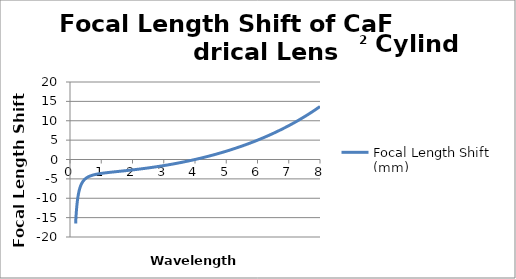
| Category | Focal Length Shift (mm) |
|---|---|
| 0.18 | -16.532 |
| 0.181 | -16.371 |
| 0.182 | -16.213 |
| 0.183 | -16.058 |
| 0.184 | -15.906 |
| 0.185 | -15.757 |
| 0.186 | -15.611 |
| 0.187 | -15.467 |
| 0.188 | -15.326 |
| 0.189 | -15.188 |
| 0.19 | -15.052 |
| 0.191 | -14.918 |
| 0.192 | -14.787 |
| 0.193 | -14.658 |
| 0.194 | -14.532 |
| 0.195 | -14.407 |
| 0.196 | -14.285 |
| 0.197 | -14.165 |
| 0.198 | -14.047 |
| 0.199 | -13.931 |
| 0.2 | -13.817 |
| 0.201 | -13.705 |
| 0.202 | -13.594 |
| 0.203 | -13.486 |
| 0.204 | -13.379 |
| 0.205 | -13.274 |
| 0.206 | -13.171 |
| 0.207 | -13.069 |
| 0.208 | -12.969 |
| 0.209 | -12.871 |
| 0.21 | -12.774 |
| 0.211 | -12.679 |
| 0.212 | -12.585 |
| 0.213 | -12.493 |
| 0.214 | -12.402 |
| 0.215 | -12.312 |
| 0.216 | -12.224 |
| 0.217 | -12.137 |
| 0.218 | -12.051 |
| 0.219 | -11.967 |
| 0.22 | -11.884 |
| 0.221 | -11.802 |
| 0.222 | -11.722 |
| 0.223 | -11.642 |
| 0.224 | -11.564 |
| 0.225 | -11.487 |
| 0.226 | -11.411 |
| 0.227 | -11.336 |
| 0.228 | -11.262 |
| 0.229 | -11.19 |
| 0.23 | -11.118 |
| 0.231 | -11.047 |
| 0.232 | -10.977 |
| 0.233 | -10.909 |
| 0.234 | -10.841 |
| 0.235 | -10.774 |
| 0.236 | -10.708 |
| 0.237 | -10.643 |
| 0.238 | -10.578 |
| 0.239 | -10.515 |
| 0.24 | -10.453 |
| 0.241 | -10.391 |
| 0.242 | -10.33 |
| 0.243 | -10.27 |
| 0.244 | -10.211 |
| 0.245 | -10.152 |
| 0.246 | -10.095 |
| 0.247 | -10.038 |
| 0.248 | -9.981 |
| 0.249 | -9.926 |
| 0.25 | -9.871 |
| 0.251 | -9.817 |
| 0.252 | -9.764 |
| 0.253 | -9.711 |
| 0.254 | -9.659 |
| 0.255 | -9.607 |
| 0.256 | -9.557 |
| 0.257 | -9.506 |
| 0.258 | -9.457 |
| 0.259 | -9.408 |
| 0.26 | -9.36 |
| 0.261 | -9.312 |
| 0.262 | -9.265 |
| 0.263 | -9.218 |
| 0.264 | -9.172 |
| 0.265 | -9.126 |
| 0.266 | -9.081 |
| 0.267 | -9.037 |
| 0.268 | -8.993 |
| 0.269 | -8.95 |
| 0.27 | -8.907 |
| 0.271 | -8.864 |
| 0.272 | -8.823 |
| 0.273 | -8.781 |
| 0.274 | -8.74 |
| 0.275 | -8.7 |
| 0.276 | -8.66 |
| 0.277 | -8.62 |
| 0.278 | -8.581 |
| 0.279 | -8.542 |
| 0.28 | -8.504 |
| 0.281 | -8.466 |
| 0.282 | -8.429 |
| 0.283 | -8.392 |
| 0.284 | -8.355 |
| 0.285 | -8.319 |
| 0.286 | -8.284 |
| 0.287 | -8.248 |
| 0.288 | -8.213 |
| 0.289 | -8.179 |
| 0.29 | -8.144 |
| 0.291 | -8.11 |
| 0.292 | -8.077 |
| 0.293 | -8.044 |
| 0.294 | -8.011 |
| 0.295 | -7.979 |
| 0.296 | -7.946 |
| 0.297 | -7.915 |
| 0.298 | -7.883 |
| 0.299 | -7.852 |
| 0.3 | -7.821 |
| 0.301 | -7.791 |
| 0.302 | -7.761 |
| 0.303 | -7.731 |
| 0.304 | -7.701 |
| 0.305 | -7.672 |
| 0.306 | -7.643 |
| 0.307 | -7.614 |
| 0.308 | -7.586 |
| 0.309 | -7.558 |
| 0.31 | -7.53 |
| 0.311 | -7.503 |
| 0.312 | -7.475 |
| 0.313 | -7.448 |
| 0.314 | -7.422 |
| 0.315 | -7.395 |
| 0.316 | -7.369 |
| 0.317 | -7.343 |
| 0.318 | -7.317 |
| 0.319 | -7.292 |
| 0.32 | -7.267 |
| 0.321 | -7.242 |
| 0.322 | -7.217 |
| 0.323 | -7.193 |
| 0.324 | -7.168 |
| 0.325 | -7.144 |
| 0.326 | -7.121 |
| 0.327 | -7.097 |
| 0.328 | -7.074 |
| 0.329 | -7.051 |
| 0.33 | -7.028 |
| 0.331 | -7.005 |
| 0.332 | -6.982 |
| 0.333 | -6.96 |
| 0.334 | -6.938 |
| 0.335 | -6.916 |
| 0.336 | -6.895 |
| 0.337 | -6.873 |
| 0.338 | -6.852 |
| 0.339 | -6.831 |
| 0.34 | -6.81 |
| 0.341 | -6.789 |
| 0.342 | -6.769 |
| 0.343 | -6.748 |
| 0.344 | -6.728 |
| 0.345 | -6.708 |
| 0.346 | -6.688 |
| 0.347 | -6.669 |
| 0.348 | -6.649 |
| 0.349 | -6.63 |
| 0.35 | -6.611 |
| 0.351 | -6.592 |
| 0.352 | -6.573 |
| 0.353 | -6.555 |
| 0.354 | -6.536 |
| 0.355 | -6.518 |
| 0.356 | -6.5 |
| 0.357 | -6.482 |
| 0.358 | -6.464 |
| 0.359 | -6.446 |
| 0.36 | -6.429 |
| 0.361 | -6.411 |
| 0.362 | -6.394 |
| 0.363 | -6.377 |
| 0.364 | -6.36 |
| 0.365 | -6.343 |
| 0.366 | -6.327 |
| 0.367 | -6.31 |
| 0.368 | -6.294 |
| 0.369 | -6.277 |
| 0.37 | -6.261 |
| 0.371 | -6.245 |
| 0.372 | -6.229 |
| 0.373 | -6.214 |
| 0.374 | -6.198 |
| 0.375 | -6.183 |
| 0.376 | -6.167 |
| 0.377 | -6.152 |
| 0.378 | -6.137 |
| 0.379 | -6.122 |
| 0.38 | -6.107 |
| 0.381 | -6.092 |
| 0.382 | -6.078 |
| 0.383 | -6.063 |
| 0.384 | -6.049 |
| 0.385 | -6.034 |
| 0.386 | -6.02 |
| 0.387 | -6.006 |
| 0.388 | -5.992 |
| 0.389 | -5.978 |
| 0.39 | -5.965 |
| 0.391 | -5.951 |
| 0.392 | -5.937 |
| 0.393 | -5.924 |
| 0.394 | -5.911 |
| 0.395 | -5.898 |
| 0.396 | -5.884 |
| 0.397 | -5.871 |
| 0.398 | -5.858 |
| 0.399 | -5.846 |
| 0.4 | -5.833 |
| 0.401 | -5.82 |
| 0.402 | -5.808 |
| 0.403 | -5.795 |
| 0.404 | -5.783 |
| 0.405 | -5.771 |
| 0.406 | -5.759 |
| 0.407 | -5.746 |
| 0.408 | -5.734 |
| 0.409 | -5.723 |
| 0.41 | -5.711 |
| 0.411 | -5.699 |
| 0.412 | -5.687 |
| 0.413 | -5.676 |
| 0.414 | -5.664 |
| 0.415 | -5.653 |
| 0.416 | -5.642 |
| 0.417 | -5.63 |
| 0.418 | -5.619 |
| 0.419 | -5.608 |
| 0.42 | -5.597 |
| 0.421 | -5.586 |
| 0.422 | -5.575 |
| 0.423 | -5.565 |
| 0.424 | -5.554 |
| 0.425 | -5.543 |
| 0.426 | -5.533 |
| 0.427 | -5.522 |
| 0.428 | -5.512 |
| 0.429 | -5.502 |
| 0.43 | -5.492 |
| 0.431 | -5.481 |
| 0.432 | -5.471 |
| 0.433 | -5.461 |
| 0.434 | -5.451 |
| 0.435 | -5.441 |
| 0.436 | -5.432 |
| 0.437 | -5.422 |
| 0.438 | -5.412 |
| 0.439 | -5.403 |
| 0.44 | -5.393 |
| 0.441 | -5.383 |
| 0.442 | -5.374 |
| 0.443 | -5.365 |
| 0.444 | -5.355 |
| 0.445 | -5.346 |
| 0.446 | -5.337 |
| 0.447 | -5.328 |
| 0.448 | -5.319 |
| 0.449 | -5.31 |
| 0.45 | -5.301 |
| 0.451 | -5.292 |
| 0.452 | -5.283 |
| 0.453 | -5.274 |
| 0.454 | -5.266 |
| 0.455 | -5.257 |
| 0.456 | -5.248 |
| 0.457 | -5.24 |
| 0.458 | -5.231 |
| 0.459 | -5.223 |
| 0.46 | -5.215 |
| 0.461 | -5.206 |
| 0.462 | -5.198 |
| 0.463 | -5.19 |
| 0.464 | -5.182 |
| 0.465 | -5.174 |
| 0.466 | -5.165 |
| 0.467 | -5.157 |
| 0.468 | -5.149 |
| 0.469 | -5.142 |
| 0.47 | -5.134 |
| 0.471 | -5.126 |
| 0.472 | -5.118 |
| 0.473 | -5.11 |
| 0.474 | -5.103 |
| 0.475 | -5.095 |
| 0.476 | -5.088 |
| 0.477 | -5.08 |
| 0.478 | -5.073 |
| 0.479 | -5.065 |
| 0.48 | -5.058 |
| 0.481 | -5.05 |
| 0.482 | -5.043 |
| 0.483 | -5.036 |
| 0.484 | -5.029 |
| 0.485 | -5.022 |
| 0.486 | -5.014 |
| 0.487 | -5.007 |
| 0.488 | -5 |
| 0.489 | -4.993 |
| 0.49 | -4.986 |
| 0.491 | -4.979 |
| 0.492 | -4.973 |
| 0.493 | -4.966 |
| 0.494 | -4.959 |
| 0.495 | -4.952 |
| 0.496 | -4.945 |
| 0.497 | -4.939 |
| 0.498 | -4.932 |
| 0.499 | -4.926 |
| 0.5 | -4.919 |
| 0.501 | -4.913 |
| 0.502 | -4.906 |
| 0.503 | -4.9 |
| 0.504 | -4.893 |
| 0.505 | -4.887 |
| 0.506 | -4.881 |
| 0.507 | -4.874 |
| 0.508 | -4.868 |
| 0.509 | -4.862 |
| 0.51 | -4.856 |
| 0.511 | -4.849 |
| 0.512 | -4.843 |
| 0.513 | -4.837 |
| 0.514 | -4.831 |
| 0.515 | -4.825 |
| 0.516 | -4.819 |
| 0.517 | -4.813 |
| 0.518 | -4.807 |
| 0.519 | -4.801 |
| 0.52 | -4.796 |
| 0.521 | -4.79 |
| 0.522 | -4.784 |
| 0.523 | -4.778 |
| 0.524 | -4.773 |
| 0.525 | -4.767 |
| 0.526 | -4.761 |
| 0.527 | -4.756 |
| 0.528 | -4.75 |
| 0.529 | -4.744 |
| 0.53 | -4.739 |
| 0.531 | -4.733 |
| 0.532 | -4.728 |
| 0.533 | -4.723 |
| 0.534 | -4.717 |
| 0.535 | -4.712 |
| 0.536 | -4.706 |
| 0.537 | -4.701 |
| 0.538 | -4.696 |
| 0.539 | -4.69 |
| 0.54 | -4.685 |
| 0.541 | -4.68 |
| 0.542 | -4.675 |
| 0.543 | -4.67 |
| 0.544 | -4.665 |
| 0.545 | -4.659 |
| 0.546 | -4.654 |
| 0.547 | -4.649 |
| 0.548 | -4.644 |
| 0.549 | -4.639 |
| 0.55 | -4.634 |
| 0.551 | -4.629 |
| 0.552 | -4.624 |
| 0.553 | -4.62 |
| 0.554 | -4.615 |
| 0.555 | -4.61 |
| 0.556 | -4.605 |
| 0.557 | -4.6 |
| 0.558 | -4.595 |
| 0.559 | -4.591 |
| 0.56 | -4.586 |
| 0.561 | -4.581 |
| 0.562 | -4.577 |
| 0.563 | -4.572 |
| 0.564 | -4.567 |
| 0.565 | -4.563 |
| 0.566 | -4.558 |
| 0.567 | -4.554 |
| 0.568 | -4.549 |
| 0.569 | -4.544 |
| 0.57 | -4.54 |
| 0.571 | -4.536 |
| 0.572 | -4.531 |
| 0.573 | -4.527 |
| 0.574 | -4.522 |
| 0.575 | -4.518 |
| 0.576 | -4.513 |
| 0.577 | -4.509 |
| 0.578 | -4.505 |
| 0.579 | -4.501 |
| 0.58 | -4.496 |
| 0.581 | -4.492 |
| 0.582 | -4.488 |
| 0.583 | -4.484 |
| 0.584 | -4.479 |
| 0.585 | -4.475 |
| 0.586 | -4.471 |
| 0.587 | -4.467 |
| 0.588 | -4.463 |
| 0.589 | -4.459 |
| 0.59 | -4.455 |
| 0.591 | -4.451 |
| 0.592 | -4.446 |
| 0.593 | -4.442 |
| 0.594 | -4.438 |
| 0.595 | -4.434 |
| 0.596 | -4.431 |
| 0.597 | -4.427 |
| 0.598 | -4.423 |
| 0.599 | -4.419 |
| 0.6 | -4.415 |
| 0.601 | -4.411 |
| 0.602 | -4.407 |
| 0.603 | -4.403 |
| 0.604 | -4.399 |
| 0.605 | -4.396 |
| 0.606 | -4.392 |
| 0.607 | -4.388 |
| 0.608 | -4.384 |
| 0.609 | -4.381 |
| 0.61 | -4.377 |
| 0.611 | -4.373 |
| 0.612 | -4.37 |
| 0.613 | -4.366 |
| 0.614 | -4.362 |
| 0.615 | -4.359 |
| 0.616 | -4.355 |
| 0.617 | -4.351 |
| 0.618 | -4.348 |
| 0.619 | -4.344 |
| 0.62 | -4.341 |
| 0.621 | -4.337 |
| 0.622 | -4.334 |
| 0.623 | -4.33 |
| 0.624 | -4.327 |
| 0.625 | -4.323 |
| 0.626 | -4.32 |
| 0.627 | -4.316 |
| 0.628 | -4.313 |
| 0.629 | -4.309 |
| 0.63 | -4.306 |
| 0.631 | -4.303 |
| 0.632 | -4.299 |
| 0.633 | -4.296 |
| 0.634 | -4.292 |
| 0.635 | -4.289 |
| 0.636 | -4.286 |
| 0.637 | -4.283 |
| 0.638 | -4.279 |
| 0.639 | -4.276 |
| 0.64 | -4.273 |
| 0.641 | -4.269 |
| 0.642 | -4.266 |
| 0.643 | -4.263 |
| 0.644 | -4.26 |
| 0.645 | -4.257 |
| 0.646 | -4.253 |
| 0.647 | -4.25 |
| 0.648 | -4.247 |
| 0.649 | -4.244 |
| 0.65 | -4.241 |
| 0.651 | -4.238 |
| 0.652 | -4.235 |
| 0.653 | -4.232 |
| 0.654 | -4.228 |
| 0.655 | -4.225 |
| 0.656 | -4.222 |
| 0.657 | -4.219 |
| 0.658 | -4.216 |
| 0.659 | -4.213 |
| 0.66 | -4.21 |
| 0.661 | -4.207 |
| 0.662 | -4.204 |
| 0.663 | -4.201 |
| 0.664 | -4.198 |
| 0.665 | -4.195 |
| 0.666 | -4.193 |
| 0.667 | -4.19 |
| 0.668 | -4.187 |
| 0.669 | -4.184 |
| 0.67 | -4.181 |
| 0.671 | -4.178 |
| 0.672 | -4.175 |
| 0.673 | -4.172 |
| 0.674 | -4.17 |
| 0.675 | -4.167 |
| 0.676 | -4.164 |
| 0.677 | -4.161 |
| 0.678 | -4.158 |
| 0.679 | -4.156 |
| 0.68 | -4.153 |
| 0.681 | -4.15 |
| 0.682 | -4.147 |
| 0.683 | -4.144 |
| 0.684 | -4.142 |
| 0.685 | -4.139 |
| 0.686 | -4.136 |
| 0.687 | -4.134 |
| 0.688 | -4.131 |
| 0.689 | -4.128 |
| 0.69 | -4.126 |
| 0.691 | -4.123 |
| 0.692 | -4.12 |
| 0.693 | -4.118 |
| 0.694 | -4.115 |
| 0.695 | -4.112 |
| 0.696 | -4.11 |
| 0.697 | -4.107 |
| 0.698 | -4.105 |
| 0.699 | -4.102 |
| 0.7 | -4.099 |
| 0.701 | -4.097 |
| 0.702 | -4.094 |
| 0.703 | -4.092 |
| 0.704 | -4.089 |
| 0.705 | -4.087 |
| 0.706 | -4.084 |
| 0.707 | -4.082 |
| 0.708 | -4.079 |
| 0.709 | -4.077 |
| 0.71 | -4.074 |
| 0.711 | -4.072 |
| 0.712 | -4.069 |
| 0.713 | -4.067 |
| 0.714 | -4.064 |
| 0.715 | -4.062 |
| 0.716 | -4.06 |
| 0.717 | -4.057 |
| 0.718 | -4.055 |
| 0.719 | -4.052 |
| 0.72 | -4.05 |
| 0.721 | -4.048 |
| 0.722 | -4.045 |
| 0.723 | -4.043 |
| 0.724 | -4.04 |
| 0.725 | -4.038 |
| 0.726 | -4.036 |
| 0.727 | -4.033 |
| 0.728 | -4.031 |
| 0.729 | -4.029 |
| 0.73 | -4.026 |
| 0.731 | -4.024 |
| 0.732 | -4.022 |
| 0.733 | -4.02 |
| 0.734 | -4.017 |
| 0.735 | -4.015 |
| 0.736 | -4.013 |
| 0.737 | -4.011 |
| 0.738 | -4.008 |
| 0.739 | -4.006 |
| 0.74 | -4.004 |
| 0.741 | -4.002 |
| 0.742 | -3.999 |
| 0.743 | -3.997 |
| 0.744 | -3.995 |
| 0.745 | -3.993 |
| 0.746 | -3.991 |
| 0.747 | -3.988 |
| 0.748 | -3.986 |
| 0.749 | -3.984 |
| 0.75 | -3.982 |
| 0.751 | -3.98 |
| 0.752 | -3.978 |
| 0.753 | -3.975 |
| 0.754 | -3.973 |
| 0.755 | -3.971 |
| 0.756 | -3.969 |
| 0.757 | -3.967 |
| 0.758 | -3.965 |
| 0.759 | -3.963 |
| 0.76 | -3.961 |
| 0.761 | -3.959 |
| 0.762 | -3.956 |
| 0.763 | -3.954 |
| 0.764 | -3.952 |
| 0.765 | -3.95 |
| 0.766 | -3.948 |
| 0.767 | -3.946 |
| 0.768 | -3.944 |
| 0.769 | -3.942 |
| 0.77 | -3.94 |
| 0.771 | -3.938 |
| 0.772 | -3.936 |
| 0.773 | -3.934 |
| 0.774 | -3.932 |
| 0.775 | -3.93 |
| 0.776 | -3.928 |
| 0.777 | -3.926 |
| 0.778 | -3.924 |
| 0.779 | -3.922 |
| 0.78 | -3.92 |
| 0.781 | -3.918 |
| 0.782 | -3.916 |
| 0.783 | -3.914 |
| 0.784 | -3.912 |
| 0.785 | -3.91 |
| 0.786 | -3.908 |
| 0.787 | -3.907 |
| 0.788 | -3.905 |
| 0.789 | -3.903 |
| 0.79 | -3.901 |
| 0.791 | -3.899 |
| 0.792 | -3.897 |
| 0.793 | -3.895 |
| 0.794 | -3.893 |
| 0.795 | -3.891 |
| 0.796 | -3.89 |
| 0.797 | -3.888 |
| 0.798 | -3.886 |
| 0.799 | -3.884 |
| 0.8 | -3.882 |
| 0.801 | -3.88 |
| 0.802 | -3.878 |
| 0.803 | -3.877 |
| 0.804 | -3.875 |
| 0.805 | -3.873 |
| 0.806 | -3.871 |
| 0.807 | -3.869 |
| 0.808 | -3.867 |
| 0.809 | -3.866 |
| 0.81 | -3.864 |
| 0.811 | -3.862 |
| 0.812 | -3.86 |
| 0.813 | -3.858 |
| 0.814 | -3.857 |
| 0.815 | -3.855 |
| 0.816 | -3.853 |
| 0.817 | -3.851 |
| 0.818 | -3.85 |
| 0.819 | -3.848 |
| 0.82 | -3.846 |
| 0.821 | -3.844 |
| 0.822 | -3.843 |
| 0.823 | -3.841 |
| 0.824 | -3.839 |
| 0.825 | -3.837 |
| 0.826 | -3.836 |
| 0.827 | -3.834 |
| 0.828 | -3.832 |
| 0.829 | -3.831 |
| 0.83 | -3.829 |
| 0.831 | -3.827 |
| 0.832 | -3.825 |
| 0.833 | -3.824 |
| 0.834 | -3.822 |
| 0.835 | -3.82 |
| 0.836 | -3.819 |
| 0.837 | -3.817 |
| 0.838 | -3.815 |
| 0.839 | -3.814 |
| 0.84 | -3.812 |
| 0.841 | -3.81 |
| 0.842 | -3.809 |
| 0.843 | -3.807 |
| 0.844 | -3.806 |
| 0.845 | -3.804 |
| 0.846 | -3.802 |
| 0.847 | -3.801 |
| 0.848 | -3.799 |
| 0.849 | -3.797 |
| 0.85 | -3.796 |
| 0.851 | -3.794 |
| 0.852 | -3.793 |
| 0.853 | -3.791 |
| 0.854 | -3.789 |
| 0.855 | -3.788 |
| 0.856 | -3.786 |
| 0.857 | -3.785 |
| 0.858 | -3.783 |
| 0.859 | -3.781 |
| 0.86 | -3.78 |
| 0.861 | -3.778 |
| 0.862 | -3.777 |
| 0.863 | -3.775 |
| 0.864 | -3.774 |
| 0.865 | -3.772 |
| 0.866 | -3.77 |
| 0.867 | -3.769 |
| 0.868 | -3.767 |
| 0.869 | -3.766 |
| 0.87 | -3.764 |
| 0.871 | -3.763 |
| 0.872 | -3.761 |
| 0.873 | -3.76 |
| 0.874 | -3.758 |
| 0.875 | -3.757 |
| 0.876 | -3.755 |
| 0.877 | -3.754 |
| 0.878 | -3.752 |
| 0.879 | -3.751 |
| 0.88 | -3.749 |
| 0.881 | -3.748 |
| 0.882 | -3.746 |
| 0.883 | -3.745 |
| 0.884 | -3.743 |
| 0.885 | -3.742 |
| 0.886 | -3.74 |
| 0.887 | -3.739 |
| 0.888 | -3.737 |
| 0.889 | -3.736 |
| 0.89 | -3.734 |
| 0.891 | -3.733 |
| 0.892 | -3.731 |
| 0.893 | -3.73 |
| 0.894 | -3.728 |
| 0.895 | -3.727 |
| 0.896 | -3.725 |
| 0.897 | -3.724 |
| 0.898 | -3.723 |
| 0.899 | -3.721 |
| 0.9 | -3.72 |
| 0.901 | -3.718 |
| 0.902 | -3.717 |
| 0.903 | -3.715 |
| 0.904 | -3.714 |
| 0.905 | -3.713 |
| 0.906 | -3.711 |
| 0.907 | -3.71 |
| 0.908 | -3.708 |
| 0.909 | -3.707 |
| 0.91 | -3.706 |
| 0.911 | -3.704 |
| 0.912 | -3.703 |
| 0.913 | -3.701 |
| 0.914 | -3.7 |
| 0.915 | -3.699 |
| 0.916 | -3.697 |
| 0.917 | -3.696 |
| 0.918 | -3.694 |
| 0.919 | -3.693 |
| 0.92 | -3.692 |
| 0.921 | -3.69 |
| 0.922 | -3.689 |
| 0.923 | -3.688 |
| 0.924 | -3.686 |
| 0.925 | -3.685 |
| 0.926 | -3.683 |
| 0.927 | -3.682 |
| 0.928 | -3.681 |
| 0.929 | -3.679 |
| 0.93 | -3.678 |
| 0.931 | -3.677 |
| 0.932 | -3.675 |
| 0.933 | -3.674 |
| 0.934 | -3.673 |
| 0.935 | -3.671 |
| 0.936 | -3.67 |
| 0.937 | -3.669 |
| 0.938 | -3.667 |
| 0.939 | -3.666 |
| 0.94 | -3.665 |
| 0.941 | -3.663 |
| 0.942 | -3.662 |
| 0.943 | -3.661 |
| 0.944 | -3.659 |
| 0.945 | -3.658 |
| 0.946 | -3.657 |
| 0.947 | -3.656 |
| 0.948 | -3.654 |
| 0.949 | -3.653 |
| 0.95 | -3.652 |
| 0.951 | -3.65 |
| 0.952 | -3.649 |
| 0.953 | -3.648 |
| 0.954 | -3.647 |
| 0.955 | -3.645 |
| 0.956 | -3.644 |
| 0.957 | -3.643 |
| 0.958 | -3.641 |
| 0.959 | -3.64 |
| 0.96 | -3.639 |
| 0.961 | -3.638 |
| 0.962 | -3.636 |
| 0.963 | -3.635 |
| 0.964 | -3.634 |
| 0.965 | -3.633 |
| 0.966 | -3.631 |
| 0.967 | -3.63 |
| 0.968 | -3.629 |
| 0.969 | -3.628 |
| 0.97 | -3.626 |
| 0.971 | -3.625 |
| 0.972 | -3.624 |
| 0.973 | -3.623 |
| 0.974 | -3.621 |
| 0.975 | -3.62 |
| 0.976 | -3.619 |
| 0.977 | -3.618 |
| 0.978 | -3.616 |
| 0.979 | -3.615 |
| 0.98 | -3.614 |
| 0.981 | -3.613 |
| 0.982 | -3.611 |
| 0.983 | -3.61 |
| 0.984 | -3.609 |
| 0.985 | -3.608 |
| 0.986 | -3.607 |
| 0.987 | -3.605 |
| 0.988 | -3.604 |
| 0.989 | -3.603 |
| 0.99 | -3.602 |
| 0.991 | -3.601 |
| 0.992 | -3.599 |
| 0.993 | -3.598 |
| 0.994 | -3.597 |
| 0.995 | -3.596 |
| 0.996 | -3.595 |
| 0.997 | -3.593 |
| 0.998 | -3.592 |
| 0.999 | -3.591 |
| 1.0 | -3.59 |
| 1.001 | -3.589 |
| 1.002 | -3.587 |
| 1.003 | -3.586 |
| 1.004 | -3.585 |
| 1.005 | -3.584 |
| 1.006 | -3.583 |
| 1.007 | -3.582 |
| 1.008 | -3.58 |
| 1.009 | -3.579 |
| 1.01 | -3.578 |
| 1.011 | -3.577 |
| 1.012 | -3.576 |
| 1.013 | -3.575 |
| 1.014 | -3.573 |
| 1.015 | -3.572 |
| 1.016 | -3.571 |
| 1.017 | -3.57 |
| 1.018 | -3.569 |
| 1.019 | -3.568 |
| 1.02 | -3.567 |
| 1.021 | -3.565 |
| 1.022 | -3.564 |
| 1.023 | -3.563 |
| 1.024 | -3.562 |
| 1.025 | -3.561 |
| 1.026 | -3.56 |
| 1.027 | -3.559 |
| 1.028 | -3.557 |
| 1.029 | -3.556 |
| 1.03 | -3.555 |
| 1.031 | -3.554 |
| 1.032 | -3.553 |
| 1.033 | -3.552 |
| 1.034 | -3.551 |
| 1.035 | -3.55 |
| 1.036 | -3.548 |
| 1.037 | -3.547 |
| 1.038 | -3.546 |
| 1.039 | -3.545 |
| 1.04 | -3.544 |
| 1.041 | -3.543 |
| 1.042 | -3.542 |
| 1.043 | -3.541 |
| 1.044 | -3.539 |
| 1.045 | -3.538 |
| 1.046 | -3.537 |
| 1.047 | -3.536 |
| 1.048 | -3.535 |
| 1.049 | -3.534 |
| 1.05 | -3.533 |
| 1.051 | -3.532 |
| 1.052 | -3.531 |
| 1.053 | -3.53 |
| 1.054 | -3.528 |
| 1.055 | -3.527 |
| 1.056 | -3.526 |
| 1.057 | -3.525 |
| 1.058 | -3.524 |
| 1.059 | -3.523 |
| 1.06 | -3.522 |
| 1.061 | -3.521 |
| 1.062 | -3.52 |
| 1.063 | -3.519 |
| 1.064 | -3.518 |
| 1.065 | -3.517 |
| 1.066 | -3.515 |
| 1.067 | -3.514 |
| 1.068 | -3.513 |
| 1.069 | -3.512 |
| 1.07 | -3.511 |
| 1.071 | -3.51 |
| 1.072 | -3.509 |
| 1.073 | -3.508 |
| 1.074 | -3.507 |
| 1.075 | -3.506 |
| 1.076 | -3.505 |
| 1.077 | -3.504 |
| 1.078 | -3.503 |
| 1.079 | -3.502 |
| 1.08 | -3.501 |
| 1.081 | -3.5 |
| 1.082 | -3.498 |
| 1.083 | -3.497 |
| 1.084 | -3.496 |
| 1.085 | -3.495 |
| 1.086 | -3.494 |
| 1.087 | -3.493 |
| 1.088 | -3.492 |
| 1.089 | -3.491 |
| 1.09 | -3.49 |
| 1.091 | -3.489 |
| 1.092 | -3.488 |
| 1.093 | -3.487 |
| 1.094 | -3.486 |
| 1.095 | -3.485 |
| 1.096 | -3.484 |
| 1.097 | -3.483 |
| 1.098 | -3.482 |
| 1.099 | -3.481 |
| 1.1 | -3.48 |
| 1.101 | -3.479 |
| 1.102 | -3.478 |
| 1.103 | -3.477 |
| 1.104 | -3.476 |
| 1.105 | -3.475 |
| 1.106 | -3.474 |
| 1.107 | -3.472 |
| 1.108 | -3.471 |
| 1.109 | -3.47 |
| 1.11 | -3.469 |
| 1.111 | -3.468 |
| 1.112 | -3.467 |
| 1.113 | -3.466 |
| 1.114 | -3.465 |
| 1.115 | -3.464 |
| 1.116 | -3.463 |
| 1.117 | -3.462 |
| 1.118 | -3.461 |
| 1.119 | -3.46 |
| 1.12 | -3.459 |
| 1.121 | -3.458 |
| 1.122 | -3.457 |
| 1.123 | -3.456 |
| 1.124 | -3.455 |
| 1.125 | -3.454 |
| 1.126 | -3.453 |
| 1.127 | -3.452 |
| 1.128 | -3.451 |
| 1.129 | -3.45 |
| 1.13 | -3.449 |
| 1.131 | -3.448 |
| 1.132 | -3.447 |
| 1.133 | -3.446 |
| 1.134 | -3.445 |
| 1.135 | -3.444 |
| 1.136 | -3.443 |
| 1.137 | -3.442 |
| 1.138 | -3.441 |
| 1.139 | -3.44 |
| 1.14 | -3.439 |
| 1.141 | -3.438 |
| 1.142 | -3.437 |
| 1.143 | -3.436 |
| 1.144 | -3.435 |
| 1.145 | -3.434 |
| 1.146 | -3.433 |
| 1.147 | -3.432 |
| 1.148 | -3.431 |
| 1.149 | -3.43 |
| 1.15 | -3.429 |
| 1.151 | -3.429 |
| 1.152 | -3.428 |
| 1.153 | -3.427 |
| 1.154 | -3.426 |
| 1.155 | -3.425 |
| 1.156 | -3.424 |
| 1.157 | -3.423 |
| 1.158 | -3.422 |
| 1.159 | -3.421 |
| 1.16 | -3.42 |
| 1.161 | -3.419 |
| 1.162 | -3.418 |
| 1.163 | -3.417 |
| 1.164 | -3.416 |
| 1.165 | -3.415 |
| 1.166 | -3.414 |
| 1.167 | -3.413 |
| 1.168 | -3.412 |
| 1.169 | -3.411 |
| 1.17 | -3.41 |
| 1.171 | -3.409 |
| 1.172 | -3.408 |
| 1.173 | -3.407 |
| 1.174 | -3.406 |
| 1.175 | -3.405 |
| 1.176 | -3.404 |
| 1.177 | -3.403 |
| 1.178 | -3.402 |
| 1.179 | -3.401 |
| 1.18 | -3.401 |
| 1.181 | -3.4 |
| 1.182 | -3.399 |
| 1.183 | -3.398 |
| 1.184 | -3.397 |
| 1.185 | -3.396 |
| 1.186 | -3.395 |
| 1.187 | -3.394 |
| 1.188 | -3.393 |
| 1.189 | -3.392 |
| 1.19 | -3.391 |
| 1.191 | -3.39 |
| 1.192 | -3.389 |
| 1.193 | -3.388 |
| 1.194 | -3.387 |
| 1.195 | -3.386 |
| 1.196 | -3.385 |
| 1.197 | -3.384 |
| 1.198 | -3.384 |
| 1.199 | -3.383 |
| 1.2 | -3.382 |
| 1.201 | -3.381 |
| 1.202 | -3.38 |
| 1.203 | -3.379 |
| 1.204 | -3.378 |
| 1.205 | -3.377 |
| 1.206 | -3.376 |
| 1.207 | -3.375 |
| 1.208 | -3.374 |
| 1.209 | -3.373 |
| 1.21 | -3.372 |
| 1.211 | -3.371 |
| 1.212 | -3.37 |
| 1.213 | -3.369 |
| 1.214 | -3.369 |
| 1.215 | -3.368 |
| 1.216 | -3.367 |
| 1.217 | -3.366 |
| 1.218 | -3.365 |
| 1.219 | -3.364 |
| 1.22 | -3.363 |
| 1.221 | -3.362 |
| 1.222 | -3.361 |
| 1.223 | -3.36 |
| 1.224 | -3.359 |
| 1.225 | -3.358 |
| 1.226 | -3.357 |
| 1.227 | -3.357 |
| 1.228 | -3.356 |
| 1.229 | -3.355 |
| 1.23 | -3.354 |
| 1.231 | -3.353 |
| 1.232 | -3.352 |
| 1.233 | -3.351 |
| 1.234 | -3.35 |
| 1.235 | -3.349 |
| 1.236 | -3.348 |
| 1.237 | -3.347 |
| 1.238 | -3.346 |
| 1.239 | -3.346 |
| 1.24 | -3.345 |
| 1.241 | -3.344 |
| 1.242 | -3.343 |
| 1.243 | -3.342 |
| 1.244 | -3.341 |
| 1.245 | -3.34 |
| 1.246 | -3.339 |
| 1.247 | -3.338 |
| 1.248 | -3.337 |
| 1.249 | -3.336 |
| 1.25 | -3.336 |
| 1.251 | -3.335 |
| 1.252 | -3.334 |
| 1.253 | -3.333 |
| 1.254 | -3.332 |
| 1.255 | -3.331 |
| 1.256 | -3.33 |
| 1.257 | -3.329 |
| 1.258 | -3.328 |
| 1.259 | -3.327 |
| 1.26 | -3.327 |
| 1.261 | -3.326 |
| 1.262 | -3.325 |
| 1.263 | -3.324 |
| 1.264 | -3.323 |
| 1.265 | -3.322 |
| 1.266 | -3.321 |
| 1.267 | -3.32 |
| 1.268 | -3.319 |
| 1.269 | -3.318 |
| 1.27 | -3.318 |
| 1.271 | -3.317 |
| 1.272 | -3.316 |
| 1.273 | -3.315 |
| 1.274 | -3.314 |
| 1.275 | -3.313 |
| 1.276 | -3.312 |
| 1.277 | -3.311 |
| 1.278 | -3.31 |
| 1.279 | -3.309 |
| 1.28 | -3.309 |
| 1.281 | -3.308 |
| 1.282 | -3.307 |
| 1.283 | -3.306 |
| 1.284 | -3.305 |
| 1.285 | -3.304 |
| 1.286 | -3.303 |
| 1.287 | -3.302 |
| 1.288 | -3.301 |
| 1.289 | -3.301 |
| 1.29 | -3.3 |
| 1.291 | -3.299 |
| 1.292 | -3.298 |
| 1.293 | -3.297 |
| 1.294 | -3.296 |
| 1.295 | -3.295 |
| 1.296 | -3.294 |
| 1.297 | -3.293 |
| 1.298 | -3.293 |
| 1.299 | -3.292 |
| 1.3 | -3.291 |
| 1.301 | -3.29 |
| 1.302 | -3.289 |
| 1.303 | -3.288 |
| 1.304 | -3.287 |
| 1.305 | -3.286 |
| 1.306 | -3.286 |
| 1.307 | -3.285 |
| 1.308 | -3.284 |
| 1.309 | -3.283 |
| 1.31 | -3.282 |
| 1.311 | -3.281 |
| 1.312 | -3.28 |
| 1.313 | -3.279 |
| 1.314 | -3.278 |
| 1.315 | -3.278 |
| 1.316 | -3.277 |
| 1.317 | -3.276 |
| 1.318 | -3.275 |
| 1.319 | -3.274 |
| 1.32 | -3.273 |
| 1.321 | -3.272 |
| 1.322 | -3.271 |
| 1.323 | -3.271 |
| 1.324 | -3.27 |
| 1.325 | -3.269 |
| 1.326 | -3.268 |
| 1.327 | -3.267 |
| 1.328 | -3.266 |
| 1.329 | -3.265 |
| 1.33 | -3.264 |
| 1.331 | -3.264 |
| 1.332 | -3.263 |
| 1.333 | -3.262 |
| 1.334 | -3.261 |
| 1.335 | -3.26 |
| 1.336 | -3.259 |
| 1.337 | -3.258 |
| 1.338 | -3.258 |
| 1.339 | -3.257 |
| 1.34 | -3.256 |
| 1.341 | -3.255 |
| 1.342 | -3.254 |
| 1.343 | -3.253 |
| 1.344 | -3.252 |
| 1.345 | -3.251 |
| 1.346 | -3.251 |
| 1.347 | -3.25 |
| 1.348 | -3.249 |
| 1.349 | -3.248 |
| 1.35 | -3.247 |
| 1.351 | -3.246 |
| 1.352 | -3.245 |
| 1.353 | -3.245 |
| 1.354 | -3.244 |
| 1.355 | -3.243 |
| 1.356 | -3.242 |
| 1.357 | -3.241 |
| 1.358 | -3.24 |
| 1.359 | -3.239 |
| 1.36 | -3.238 |
| 1.361 | -3.238 |
| 1.362 | -3.237 |
| 1.363 | -3.236 |
| 1.364 | -3.235 |
| 1.365 | -3.234 |
| 1.366 | -3.233 |
| 1.367 | -3.232 |
| 1.368 | -3.232 |
| 1.369 | -3.231 |
| 1.37 | -3.23 |
| 1.371 | -3.229 |
| 1.372 | -3.228 |
| 1.373 | -3.227 |
| 1.374 | -3.226 |
| 1.375 | -3.226 |
| 1.376 | -3.225 |
| 1.377 | -3.224 |
| 1.378 | -3.223 |
| 1.379 | -3.222 |
| 1.38 | -3.221 |
| 1.381 | -3.22 |
| 1.382 | -3.22 |
| 1.383 | -3.219 |
| 1.384 | -3.218 |
| 1.385 | -3.217 |
| 1.386 | -3.216 |
| 1.387 | -3.215 |
| 1.388 | -3.214 |
| 1.389 | -3.214 |
| 1.39 | -3.213 |
| 1.391 | -3.212 |
| 1.392 | -3.211 |
| 1.393 | -3.21 |
| 1.394 | -3.209 |
| 1.395 | -3.208 |
| 1.396 | -3.208 |
| 1.397 | -3.207 |
| 1.398 | -3.206 |
| 1.399 | -3.205 |
| 1.4 | -3.204 |
| 1.401 | -3.203 |
| 1.402 | -3.202 |
| 1.403 | -3.202 |
| 1.404 | -3.201 |
| 1.405 | -3.2 |
| 1.406 | -3.199 |
| 1.407 | -3.198 |
| 1.408 | -3.197 |
| 1.409 | -3.196 |
| 1.41 | -3.196 |
| 1.411 | -3.195 |
| 1.412 | -3.194 |
| 1.413 | -3.193 |
| 1.414 | -3.192 |
| 1.415 | -3.191 |
| 1.416 | -3.19 |
| 1.417 | -3.19 |
| 1.418 | -3.189 |
| 1.419 | -3.188 |
| 1.42 | -3.187 |
| 1.421 | -3.186 |
| 1.422 | -3.185 |
| 1.423 | -3.184 |
| 1.424 | -3.184 |
| 1.425 | -3.183 |
| 1.426 | -3.182 |
| 1.427 | -3.181 |
| 1.428 | -3.18 |
| 1.429 | -3.179 |
| 1.43 | -3.179 |
| 1.431 | -3.178 |
| 1.432 | -3.177 |
| 1.433 | -3.176 |
| 1.434 | -3.175 |
| 1.435 | -3.174 |
| 1.436 | -3.173 |
| 1.437 | -3.173 |
| 1.438 | -3.172 |
| 1.439 | -3.171 |
| 1.44 | -3.17 |
| 1.441 | -3.169 |
| 1.442 | -3.168 |
| 1.443 | -3.168 |
| 1.444 | -3.167 |
| 1.445 | -3.166 |
| 1.446 | -3.165 |
| 1.447 | -3.164 |
| 1.448 | -3.163 |
| 1.449 | -3.162 |
| 1.45 | -3.162 |
| 1.451 | -3.161 |
| 1.452 | -3.16 |
| 1.453 | -3.159 |
| 1.454 | -3.158 |
| 1.455 | -3.157 |
| 1.456 | -3.156 |
| 1.457 | -3.156 |
| 1.458 | -3.155 |
| 1.459 | -3.154 |
| 1.46 | -3.153 |
| 1.461 | -3.152 |
| 1.462 | -3.151 |
| 1.463 | -3.151 |
| 1.464 | -3.15 |
| 1.465 | -3.149 |
| 1.466 | -3.148 |
| 1.467 | -3.147 |
| 1.468 | -3.146 |
| 1.469 | -3.146 |
| 1.47 | -3.145 |
| 1.471 | -3.144 |
| 1.472 | -3.143 |
| 1.473 | -3.142 |
| 1.474 | -3.141 |
| 1.475 | -3.14 |
| 1.476 | -3.14 |
| 1.477 | -3.139 |
| 1.478 | -3.138 |
| 1.479 | -3.137 |
| 1.48 | -3.136 |
| 1.481 | -3.135 |
| 1.482 | -3.135 |
| 1.483 | -3.134 |
| 1.484 | -3.133 |
| 1.485 | -3.132 |
| 1.486 | -3.131 |
| 1.487 | -3.13 |
| 1.488 | -3.129 |
| 1.489 | -3.129 |
| 1.49 | -3.128 |
| 1.491 | -3.127 |
| 1.492 | -3.126 |
| 1.493 | -3.125 |
| 1.494 | -3.124 |
| 1.495 | -3.124 |
| 1.496 | -3.123 |
| 1.497 | -3.122 |
| 1.498 | -3.121 |
| 1.499 | -3.12 |
| 1.5 | -3.119 |
| 1.501 | -3.118 |
| 1.502 | -3.118 |
| 1.503 | -3.117 |
| 1.504 | -3.116 |
| 1.505 | -3.115 |
| 1.506 | -3.114 |
| 1.507 | -3.113 |
| 1.508 | -3.113 |
| 1.509 | -3.112 |
| 1.51 | -3.111 |
| 1.511 | -3.11 |
| 1.512 | -3.109 |
| 1.513 | -3.108 |
| 1.514 | -3.108 |
| 1.515 | -3.107 |
| 1.516 | -3.106 |
| 1.517 | -3.105 |
| 1.518 | -3.104 |
| 1.519 | -3.103 |
| 1.52 | -3.102 |
| 1.521 | -3.102 |
| 1.522 | -3.101 |
| 1.523 | -3.1 |
| 1.524 | -3.099 |
| 1.525 | -3.098 |
| 1.526 | -3.097 |
| 1.527 | -3.097 |
| 1.528 | -3.096 |
| 1.529 | -3.095 |
| 1.53 | -3.094 |
| 1.531 | -3.093 |
| 1.532 | -3.092 |
| 1.533 | -3.092 |
| 1.534 | -3.091 |
| 1.535 | -3.09 |
| 1.536 | -3.089 |
| 1.537 | -3.088 |
| 1.538 | -3.087 |
| 1.539 | -3.086 |
| 1.54 | -3.086 |
| 1.541 | -3.085 |
| 1.542 | -3.084 |
| 1.543 | -3.083 |
| 1.544 | -3.082 |
| 1.545 | -3.081 |
| 1.546 | -3.081 |
| 1.547 | -3.08 |
| 1.548 | -3.079 |
| 1.549 | -3.078 |
| 1.55 | -3.077 |
| 1.551 | -3.076 |
| 1.552 | -3.075 |
| 1.553 | -3.075 |
| 1.554 | -3.074 |
| 1.555 | -3.073 |
| 1.556 | -3.072 |
| 1.557 | -3.071 |
| 1.558 | -3.07 |
| 1.559 | -3.07 |
| 1.56 | -3.069 |
| 1.561 | -3.068 |
| 1.562 | -3.067 |
| 1.563 | -3.066 |
| 1.564 | -3.065 |
| 1.565 | -3.065 |
| 1.566 | -3.064 |
| 1.567 | -3.063 |
| 1.568 | -3.062 |
| 1.569 | -3.061 |
| 1.57 | -3.06 |
| 1.571 | -3.059 |
| 1.572 | -3.059 |
| 1.573 | -3.058 |
| 1.574 | -3.057 |
| 1.575 | -3.056 |
| 1.576 | -3.055 |
| 1.577 | -3.054 |
| 1.578 | -3.054 |
| 1.579 | -3.053 |
| 1.58 | -3.052 |
| 1.581 | -3.051 |
| 1.582 | -3.05 |
| 1.583 | -3.049 |
| 1.584 | -3.048 |
| 1.585 | -3.048 |
| 1.586 | -3.047 |
| 1.587 | -3.046 |
| 1.588 | -3.045 |
| 1.589 | -3.044 |
| 1.59 | -3.043 |
| 1.591 | -3.043 |
| 1.592 | -3.042 |
| 1.593 | -3.041 |
| 1.594 | -3.04 |
| 1.595 | -3.039 |
| 1.596 | -3.038 |
| 1.597 | -3.037 |
| 1.598 | -3.037 |
| 1.599 | -3.036 |
| 1.6 | -3.035 |
| 1.601 | -3.034 |
| 1.602 | -3.033 |
| 1.603 | -3.032 |
| 1.604 | -3.032 |
| 1.605 | -3.031 |
| 1.606 | -3.03 |
| 1.607 | -3.029 |
| 1.608 | -3.028 |
| 1.609 | -3.027 |
| 1.61 | -3.026 |
| 1.611 | -3.026 |
| 1.612 | -3.025 |
| 1.613 | -3.024 |
| 1.614 | -3.023 |
| 1.615 | -3.022 |
| 1.616 | -3.021 |
| 1.617 | -3.021 |
| 1.618 | -3.02 |
| 1.619 | -3.019 |
| 1.62 | -3.018 |
| 1.621 | -3.017 |
| 1.622 | -3.016 |
| 1.623 | -3.015 |
| 1.624 | -3.015 |
| 1.625 | -3.014 |
| 1.626 | -3.013 |
| 1.627 | -3.012 |
| 1.628 | -3.011 |
| 1.629 | -3.01 |
| 1.63 | -3.01 |
| 1.631 | -3.009 |
| 1.632 | -3.008 |
| 1.633 | -3.007 |
| 1.634 | -3.006 |
| 1.635 | -3.005 |
| 1.636 | -3.004 |
| 1.637 | -3.004 |
| 1.638 | -3.003 |
| 1.639 | -3.002 |
| 1.64 | -3.001 |
| 1.641 | -3 |
| 1.642 | -2.999 |
| 1.643 | -2.999 |
| 1.644 | -2.998 |
| 1.645 | -2.997 |
| 1.646 | -2.996 |
| 1.647 | -2.995 |
| 1.648 | -2.994 |
| 1.649 | -2.993 |
| 1.65 | -2.993 |
| 1.651 | -2.992 |
| 1.652 | -2.991 |
| 1.653 | -2.99 |
| 1.654 | -2.989 |
| 1.655 | -2.988 |
| 1.656 | -2.987 |
| 1.657 | -2.987 |
| 1.658 | -2.986 |
| 1.659 | -2.985 |
| 1.66 | -2.984 |
| 1.661 | -2.983 |
| 1.662 | -2.982 |
| 1.663 | -2.982 |
| 1.664 | -2.981 |
| 1.665 | -2.98 |
| 1.666 | -2.979 |
| 1.667 | -2.978 |
| 1.668 | -2.977 |
| 1.669 | -2.976 |
| 1.67 | -2.976 |
| 1.671 | -2.975 |
| 1.672 | -2.974 |
| 1.673 | -2.973 |
| 1.674 | -2.972 |
| 1.675 | -2.971 |
| 1.676 | -2.97 |
| 1.677 | -2.97 |
| 1.678 | -2.969 |
| 1.679 | -2.968 |
| 1.68 | -2.967 |
| 1.681 | -2.966 |
| 1.682 | -2.965 |
| 1.683 | -2.964 |
| 1.684 | -2.964 |
| 1.685 | -2.963 |
| 1.686 | -2.962 |
| 1.687 | -2.961 |
| 1.688 | -2.96 |
| 1.689 | -2.959 |
| 1.69 | -2.958 |
| 1.691 | -2.958 |
| 1.692 | -2.957 |
| 1.693 | -2.956 |
| 1.694 | -2.955 |
| 1.695 | -2.954 |
| 1.696 | -2.953 |
| 1.697 | -2.952 |
| 1.698 | -2.952 |
| 1.699 | -2.951 |
| 1.7 | -2.95 |
| 1.701 | -2.949 |
| 1.702 | -2.948 |
| 1.703 | -2.947 |
| 1.704 | -2.946 |
| 1.705 | -2.946 |
| 1.706 | -2.945 |
| 1.707 | -2.944 |
| 1.708 | -2.943 |
| 1.709 | -2.942 |
| 1.71 | -2.941 |
| 1.711 | -2.94 |
| 1.712 | -2.94 |
| 1.713 | -2.939 |
| 1.714 | -2.938 |
| 1.715 | -2.937 |
| 1.716 | -2.936 |
| 1.717 | -2.935 |
| 1.718 | -2.934 |
| 1.719 | -2.934 |
| 1.72 | -2.933 |
| 1.721 | -2.932 |
| 1.722 | -2.931 |
| 1.723 | -2.93 |
| 1.724 | -2.929 |
| 1.725 | -2.928 |
| 1.726 | -2.928 |
| 1.727 | -2.927 |
| 1.728 | -2.926 |
| 1.729 | -2.925 |
| 1.73 | -2.924 |
| 1.731 | -2.923 |
| 1.732 | -2.922 |
| 1.733 | -2.922 |
| 1.734 | -2.921 |
| 1.735 | -2.92 |
| 1.736 | -2.919 |
| 1.737 | -2.918 |
| 1.738 | -2.917 |
| 1.739 | -2.916 |
| 1.74 | -2.916 |
| 1.741 | -2.915 |
| 1.742 | -2.914 |
| 1.743 | -2.913 |
| 1.744 | -2.912 |
| 1.745 | -2.911 |
| 1.746 | -2.91 |
| 1.747 | -2.909 |
| 1.748 | -2.909 |
| 1.749 | -2.908 |
| 1.75 | -2.907 |
| 1.751 | -2.906 |
| 1.752 | -2.905 |
| 1.753 | -2.904 |
| 1.754 | -2.903 |
| 1.755 | -2.903 |
| 1.756 | -2.902 |
| 1.757 | -2.901 |
| 1.758 | -2.9 |
| 1.759 | -2.899 |
| 1.76 | -2.898 |
| 1.761 | -2.897 |
| 1.762 | -2.896 |
| 1.763 | -2.896 |
| 1.764 | -2.895 |
| 1.765 | -2.894 |
| 1.766 | -2.893 |
| 1.767 | -2.892 |
| 1.768 | -2.891 |
| 1.769 | -2.89 |
| 1.77 | -2.89 |
| 1.771 | -2.889 |
| 1.772 | -2.888 |
| 1.773 | -2.887 |
| 1.774 | -2.886 |
| 1.775 | -2.885 |
| 1.776 | -2.884 |
| 1.777 | -2.883 |
| 1.778 | -2.883 |
| 1.779 | -2.882 |
| 1.78 | -2.881 |
| 1.781 | -2.88 |
| 1.782 | -2.879 |
| 1.783 | -2.878 |
| 1.784 | -2.877 |
| 1.785 | -2.876 |
| 1.786 | -2.876 |
| 1.787 | -2.875 |
| 1.788 | -2.874 |
| 1.789 | -2.873 |
| 1.79 | -2.872 |
| 1.791 | -2.871 |
| 1.792 | -2.87 |
| 1.793 | -2.869 |
| 1.794 | -2.869 |
| 1.795 | -2.868 |
| 1.796 | -2.867 |
| 1.797 | -2.866 |
| 1.798 | -2.865 |
| 1.799 | -2.864 |
| 1.8 | -2.863 |
| 1.801 | -2.862 |
| 1.802 | -2.862 |
| 1.803 | -2.861 |
| 1.804 | -2.86 |
| 1.805 | -2.859 |
| 1.806 | -2.858 |
| 1.807 | -2.857 |
| 1.808 | -2.856 |
| 1.809 | -2.855 |
| 1.81 | -2.855 |
| 1.811 | -2.854 |
| 1.812 | -2.853 |
| 1.813 | -2.852 |
| 1.814 | -2.851 |
| 1.815 | -2.85 |
| 1.816 | -2.849 |
| 1.817 | -2.848 |
| 1.818 | -2.848 |
| 1.819 | -2.847 |
| 1.82 | -2.846 |
| 1.821 | -2.845 |
| 1.822 | -2.844 |
| 1.823 | -2.843 |
| 1.824 | -2.842 |
| 1.825 | -2.841 |
| 1.826 | -2.841 |
| 1.827 | -2.84 |
| 1.828 | -2.839 |
| 1.829 | -2.838 |
| 1.83 | -2.837 |
| 1.831 | -2.836 |
| 1.832 | -2.835 |
| 1.833 | -2.834 |
| 1.834 | -2.833 |
| 1.835 | -2.833 |
| 1.836 | -2.832 |
| 1.837 | -2.831 |
| 1.838 | -2.83 |
| 1.839 | -2.829 |
| 1.84 | -2.828 |
| 1.841 | -2.827 |
| 1.842 | -2.826 |
| 1.843 | -2.826 |
| 1.844 | -2.825 |
| 1.845 | -2.824 |
| 1.846 | -2.823 |
| 1.847 | -2.822 |
| 1.848 | -2.821 |
| 1.849 | -2.82 |
| 1.85 | -2.819 |
| 1.851 | -2.818 |
| 1.852 | -2.818 |
| 1.853 | -2.817 |
| 1.854 | -2.816 |
| 1.855 | -2.815 |
| 1.856 | -2.814 |
| 1.857 | -2.813 |
| 1.858 | -2.812 |
| 1.859 | -2.811 |
| 1.86 | -2.81 |
| 1.861 | -2.81 |
| 1.862 | -2.809 |
| 1.863 | -2.808 |
| 1.864 | -2.807 |
| 1.865 | -2.806 |
| 1.866 | -2.805 |
| 1.867 | -2.804 |
| 1.868 | -2.803 |
| 1.869 | -2.802 |
| 1.87 | -2.802 |
| 1.871 | -2.801 |
| 1.872 | -2.8 |
| 1.873 | -2.799 |
| 1.874 | -2.798 |
| 1.875 | -2.797 |
| 1.876 | -2.796 |
| 1.877 | -2.795 |
| 1.878 | -2.794 |
| 1.879 | -2.794 |
| 1.88 | -2.793 |
| 1.881 | -2.792 |
| 1.882 | -2.791 |
| 1.883 | -2.79 |
| 1.884 | -2.789 |
| 1.885 | -2.788 |
| 1.886 | -2.787 |
| 1.887 | -2.786 |
| 1.888 | -2.785 |
| 1.889 | -2.785 |
| 1.89 | -2.784 |
| 1.891 | -2.783 |
| 1.892 | -2.782 |
| 1.893 | -2.781 |
| 1.894 | -2.78 |
| 1.895 | -2.779 |
| 1.896 | -2.778 |
| 1.897 | -2.777 |
| 1.898 | -2.777 |
| 1.899 | -2.776 |
| 1.9 | -2.775 |
| 1.901 | -2.774 |
| 1.902 | -2.773 |
| 1.903 | -2.772 |
| 1.904 | -2.771 |
| 1.905 | -2.77 |
| 1.906 | -2.769 |
| 1.907 | -2.768 |
| 1.908 | -2.768 |
| 1.909 | -2.767 |
| 1.91 | -2.766 |
| 1.911 | -2.765 |
| 1.912 | -2.764 |
| 1.913 | -2.763 |
| 1.914 | -2.762 |
| 1.915 | -2.761 |
| 1.916 | -2.76 |
| 1.917 | -2.759 |
| 1.918 | -2.758 |
| 1.919 | -2.758 |
| 1.92 | -2.757 |
| 1.921 | -2.756 |
| 1.922 | -2.755 |
| 1.923 | -2.754 |
| 1.924 | -2.753 |
| 1.925 | -2.752 |
| 1.926 | -2.751 |
| 1.927 | -2.75 |
| 1.928 | -2.749 |
| 1.929 | -2.749 |
| 1.93 | -2.748 |
| 1.931 | -2.747 |
| 1.932 | -2.746 |
| 1.933 | -2.745 |
| 1.934 | -2.744 |
| 1.935 | -2.743 |
| 1.936 | -2.742 |
| 1.937 | -2.741 |
| 1.938 | -2.74 |
| 1.939 | -2.739 |
| 1.94 | -2.739 |
| 1.941 | -2.738 |
| 1.942 | -2.737 |
| 1.943 | -2.736 |
| 1.944 | -2.735 |
| 1.945 | -2.734 |
| 1.946 | -2.733 |
| 1.947 | -2.732 |
| 1.948 | -2.731 |
| 1.949 | -2.73 |
| 1.95 | -2.729 |
| 1.951 | -2.729 |
| 1.952 | -2.728 |
| 1.953 | -2.727 |
| 1.954 | -2.726 |
| 1.955 | -2.725 |
| 1.956 | -2.724 |
| 1.957 | -2.723 |
| 1.958 | -2.722 |
| 1.959 | -2.721 |
| 1.96 | -2.72 |
| 1.961 | -2.719 |
| 1.962 | -2.718 |
| 1.963 | -2.718 |
| 1.964 | -2.717 |
| 1.965 | -2.716 |
| 1.966 | -2.715 |
| 1.967 | -2.714 |
| 1.968 | -2.713 |
| 1.969 | -2.712 |
| 1.97 | -2.711 |
| 1.971 | -2.71 |
| 1.972 | -2.709 |
| 1.973 | -2.708 |
| 1.974 | -2.707 |
| 1.975 | -2.707 |
| 1.976 | -2.706 |
| 1.977 | -2.705 |
| 1.978 | -2.704 |
| 1.979 | -2.703 |
| 1.98 | -2.702 |
| 1.981 | -2.701 |
| 1.982 | -2.7 |
| 1.983 | -2.699 |
| 1.984 | -2.698 |
| 1.985 | -2.697 |
| 1.986 | -2.696 |
| 1.987 | -2.696 |
| 1.988 | -2.695 |
| 1.989 | -2.694 |
| 1.99 | -2.693 |
| 1.991 | -2.692 |
| 1.992 | -2.691 |
| 1.993 | -2.69 |
| 1.994 | -2.689 |
| 1.995 | -2.688 |
| 1.996 | -2.687 |
| 1.997 | -2.686 |
| 1.998 | -2.685 |
| 1.999 | -2.684 |
| 2.0 | -2.684 |
| 2.001 | -2.683 |
| 2.002 | -2.682 |
| 2.003 | -2.681 |
| 2.004 | -2.68 |
| 2.005 | -2.679 |
| 2.006 | -2.678 |
| 2.007 | -2.677 |
| 2.008 | -2.676 |
| 2.009 | -2.675 |
| 2.01 | -2.674 |
| 2.011 | -2.673 |
| 2.012 | -2.672 |
| 2.013 | -2.671 |
| 2.014 | -2.671 |
| 2.015 | -2.67 |
| 2.016 | -2.669 |
| 2.017 | -2.668 |
| 2.018 | -2.667 |
| 2.019 | -2.666 |
| 2.02 | -2.665 |
| 2.021 | -2.664 |
| 2.022 | -2.663 |
| 2.023 | -2.662 |
| 2.024 | -2.661 |
| 2.025 | -2.66 |
| 2.026 | -2.659 |
| 2.027 | -2.658 |
| 2.028 | -2.657 |
| 2.029 | -2.657 |
| 2.03 | -2.656 |
| 2.031 | -2.655 |
| 2.032 | -2.654 |
| 2.033 | -2.653 |
| 2.034 | -2.652 |
| 2.035 | -2.651 |
| 2.036 | -2.65 |
| 2.037 | -2.649 |
| 2.038 | -2.648 |
| 2.039 | -2.647 |
| 2.04 | -2.646 |
| 2.041 | -2.645 |
| 2.042 | -2.644 |
| 2.043 | -2.643 |
| 2.044 | -2.642 |
| 2.045 | -2.642 |
| 2.046 | -2.641 |
| 2.047 | -2.64 |
| 2.048 | -2.639 |
| 2.049 | -2.638 |
| 2.05 | -2.637 |
| 2.051 | -2.636 |
| 2.052 | -2.635 |
| 2.053 | -2.634 |
| 2.054 | -2.633 |
| 2.055 | -2.632 |
| 2.056 | -2.631 |
| 2.057 | -2.63 |
| 2.058 | -2.629 |
| 2.059 | -2.628 |
| 2.06 | -2.627 |
| 2.061 | -2.626 |
| 2.062 | -2.626 |
| 2.063 | -2.625 |
| 2.064 | -2.624 |
| 2.065 | -2.623 |
| 2.066 | -2.622 |
| 2.067 | -2.621 |
| 2.068 | -2.62 |
| 2.069 | -2.619 |
| 2.07 | -2.618 |
| 2.071 | -2.617 |
| 2.072 | -2.616 |
| 2.073 | -2.615 |
| 2.074 | -2.614 |
| 2.075 | -2.613 |
| 2.076 | -2.612 |
| 2.077 | -2.611 |
| 2.078 | -2.61 |
| 2.079 | -2.609 |
| 2.08 | -2.608 |
| 2.081 | -2.607 |
| 2.082 | -2.607 |
| 2.083 | -2.606 |
| 2.084 | -2.605 |
| 2.085 | -2.604 |
| 2.086 | -2.603 |
| 2.087 | -2.602 |
| 2.088 | -2.601 |
| 2.089 | -2.6 |
| 2.09 | -2.599 |
| 2.091 | -2.598 |
| 2.092 | -2.597 |
| 2.093 | -2.596 |
| 2.094 | -2.595 |
| 2.095 | -2.594 |
| 2.096 | -2.593 |
| 2.097 | -2.592 |
| 2.098 | -2.591 |
| 2.099 | -2.59 |
| 2.1 | -2.589 |
| 2.101 | -2.588 |
| 2.102 | -2.587 |
| 2.103 | -2.586 |
| 2.104 | -2.586 |
| 2.105 | -2.585 |
| 2.106 | -2.584 |
| 2.107 | -2.583 |
| 2.108 | -2.582 |
| 2.109 | -2.581 |
| 2.11 | -2.58 |
| 2.111 | -2.579 |
| 2.112 | -2.578 |
| 2.113 | -2.577 |
| 2.114 | -2.576 |
| 2.115 | -2.575 |
| 2.116 | -2.574 |
| 2.117 | -2.573 |
| 2.118 | -2.572 |
| 2.119 | -2.571 |
| 2.12 | -2.57 |
| 2.121 | -2.569 |
| 2.122 | -2.568 |
| 2.123 | -2.567 |
| 2.124 | -2.566 |
| 2.125 | -2.565 |
| 2.126 | -2.564 |
| 2.127 | -2.563 |
| 2.128 | -2.562 |
| 2.129 | -2.561 |
| 2.13 | -2.56 |
| 2.131 | -2.56 |
| 2.132 | -2.559 |
| 2.133 | -2.558 |
| 2.134 | -2.557 |
| 2.135 | -2.556 |
| 2.136 | -2.555 |
| 2.137 | -2.554 |
| 2.138 | -2.553 |
| 2.139 | -2.552 |
| 2.14 | -2.551 |
| 2.141 | -2.55 |
| 2.142 | -2.549 |
| 2.143 | -2.548 |
| 2.144 | -2.547 |
| 2.145 | -2.546 |
| 2.146 | -2.545 |
| 2.147 | -2.544 |
| 2.148 | -2.543 |
| 2.149 | -2.542 |
| 2.15 | -2.541 |
| 2.151 | -2.54 |
| 2.152 | -2.539 |
| 2.153 | -2.538 |
| 2.154 | -2.537 |
| 2.155 | -2.536 |
| 2.156 | -2.535 |
| 2.157 | -2.534 |
| 2.158 | -2.533 |
| 2.159 | -2.532 |
| 2.16 | -2.531 |
| 2.161 | -2.53 |
| 2.162 | -2.529 |
| 2.163 | -2.528 |
| 2.164 | -2.527 |
| 2.165 | -2.526 |
| 2.166 | -2.525 |
| 2.167 | -2.524 |
| 2.168 | -2.523 |
| 2.169 | -2.523 |
| 2.17 | -2.522 |
| 2.171 | -2.521 |
| 2.172 | -2.52 |
| 2.173 | -2.519 |
| 2.174 | -2.518 |
| 2.175 | -2.517 |
| 2.176 | -2.516 |
| 2.177 | -2.515 |
| 2.178 | -2.514 |
| 2.179 | -2.513 |
| 2.18 | -2.512 |
| 2.181 | -2.511 |
| 2.182 | -2.51 |
| 2.183 | -2.509 |
| 2.184 | -2.508 |
| 2.185 | -2.507 |
| 2.186 | -2.506 |
| 2.187 | -2.505 |
| 2.188 | -2.504 |
| 2.189 | -2.503 |
| 2.19 | -2.502 |
| 2.191 | -2.501 |
| 2.192 | -2.5 |
| 2.193 | -2.499 |
| 2.194 | -2.498 |
| 2.195 | -2.497 |
| 2.196 | -2.496 |
| 2.197 | -2.495 |
| 2.198 | -2.494 |
| 2.199 | -2.493 |
| 2.2 | -2.492 |
| 2.201 | -2.491 |
| 2.202 | -2.49 |
| 2.203 | -2.489 |
| 2.204 | -2.488 |
| 2.205 | -2.487 |
| 2.206 | -2.486 |
| 2.207 | -2.485 |
| 2.208 | -2.484 |
| 2.209 | -2.483 |
| 2.21 | -2.482 |
| 2.211 | -2.481 |
| 2.212 | -2.48 |
| 2.213 | -2.479 |
| 2.214 | -2.478 |
| 2.215 | -2.477 |
| 2.216 | -2.476 |
| 2.217 | -2.475 |
| 2.218 | -2.474 |
| 2.219 | -2.473 |
| 2.22 | -2.472 |
| 2.221 | -2.471 |
| 2.222 | -2.47 |
| 2.223 | -2.469 |
| 2.224 | -2.468 |
| 2.225 | -2.467 |
| 2.226 | -2.466 |
| 2.227 | -2.465 |
| 2.228 | -2.464 |
| 2.229 | -2.463 |
| 2.23 | -2.462 |
| 2.231 | -2.461 |
| 2.232 | -2.46 |
| 2.233 | -2.459 |
| 2.234 | -2.458 |
| 2.235 | -2.457 |
| 2.236 | -2.456 |
| 2.237 | -2.455 |
| 2.238 | -2.454 |
| 2.239 | -2.453 |
| 2.24 | -2.452 |
| 2.241 | -2.451 |
| 2.242 | -2.45 |
| 2.243 | -2.449 |
| 2.244 | -2.448 |
| 2.245 | -2.447 |
| 2.246 | -2.446 |
| 2.247 | -2.445 |
| 2.248 | -2.444 |
| 2.249 | -2.443 |
| 2.25 | -2.442 |
| 2.251 | -2.441 |
| 2.252 | -2.44 |
| 2.253 | -2.439 |
| 2.254 | -2.438 |
| 2.255 | -2.437 |
| 2.256 | -2.436 |
| 2.257 | -2.435 |
| 2.258 | -2.434 |
| 2.259 | -2.433 |
| 2.26 | -2.432 |
| 2.261 | -2.431 |
| 2.262 | -2.43 |
| 2.263 | -2.429 |
| 2.264 | -2.428 |
| 2.265 | -2.427 |
| 2.266 | -2.426 |
| 2.267 | -2.425 |
| 2.268 | -2.424 |
| 2.269 | -2.423 |
| 2.27 | -2.422 |
| 2.271 | -2.421 |
| 2.272 | -2.42 |
| 2.273 | -2.419 |
| 2.274 | -2.418 |
| 2.275 | -2.417 |
| 2.276 | -2.416 |
| 2.277 | -2.415 |
| 2.278 | -2.414 |
| 2.279 | -2.413 |
| 2.28 | -2.412 |
| 2.281 | -2.411 |
| 2.282 | -2.409 |
| 2.283 | -2.408 |
| 2.284 | -2.407 |
| 2.285 | -2.406 |
| 2.286 | -2.405 |
| 2.287 | -2.404 |
| 2.288 | -2.403 |
| 2.289 | -2.402 |
| 2.29 | -2.401 |
| 2.291 | -2.4 |
| 2.292 | -2.399 |
| 2.293 | -2.398 |
| 2.294 | -2.397 |
| 2.295 | -2.396 |
| 2.296 | -2.395 |
| 2.297 | -2.394 |
| 2.298 | -2.393 |
| 2.299 | -2.392 |
| 2.3 | -2.391 |
| 2.301 | -2.39 |
| 2.302 | -2.389 |
| 2.303 | -2.388 |
| 2.304 | -2.387 |
| 2.305 | -2.386 |
| 2.306 | -2.385 |
| 2.307 | -2.384 |
| 2.308 | -2.383 |
| 2.309 | -2.382 |
| 2.31 | -2.381 |
| 2.311 | -2.38 |
| 2.312 | -2.379 |
| 2.313 | -2.378 |
| 2.314 | -2.377 |
| 2.315 | -2.376 |
| 2.316 | -2.375 |
| 2.317 | -2.374 |
| 2.318 | -2.373 |
| 2.319 | -2.371 |
| 2.32 | -2.37 |
| 2.321 | -2.369 |
| 2.322 | -2.368 |
| 2.323 | -2.367 |
| 2.324 | -2.366 |
| 2.325 | -2.365 |
| 2.326 | -2.364 |
| 2.327 | -2.363 |
| 2.328 | -2.362 |
| 2.329 | -2.361 |
| 2.33 | -2.36 |
| 2.331 | -2.359 |
| 2.332 | -2.358 |
| 2.333 | -2.357 |
| 2.334 | -2.356 |
| 2.335 | -2.355 |
| 2.336 | -2.354 |
| 2.337 | -2.353 |
| 2.338 | -2.352 |
| 2.339 | -2.351 |
| 2.34 | -2.35 |
| 2.341 | -2.349 |
| 2.342 | -2.348 |
| 2.343 | -2.347 |
| 2.344 | -2.346 |
| 2.345 | -2.344 |
| 2.346 | -2.343 |
| 2.347 | -2.342 |
| 2.348 | -2.341 |
| 2.349 | -2.34 |
| 2.35 | -2.339 |
| 2.351 | -2.338 |
| 2.352 | -2.337 |
| 2.353 | -2.336 |
| 2.354 | -2.335 |
| 2.355 | -2.334 |
| 2.356 | -2.333 |
| 2.357 | -2.332 |
| 2.358 | -2.331 |
| 2.359 | -2.33 |
| 2.36 | -2.329 |
| 2.361 | -2.328 |
| 2.362 | -2.327 |
| 2.363 | -2.326 |
| 2.364 | -2.325 |
| 2.365 | -2.324 |
| 2.366 | -2.322 |
| 2.367 | -2.321 |
| 2.368 | -2.32 |
| 2.369 | -2.319 |
| 2.37 | -2.318 |
| 2.371 | -2.317 |
| 2.372 | -2.316 |
| 2.373 | -2.315 |
| 2.374 | -2.314 |
| 2.375 | -2.313 |
| 2.376 | -2.312 |
| 2.377 | -2.311 |
| 2.378 | -2.31 |
| 2.379 | -2.309 |
| 2.38 | -2.308 |
| 2.381 | -2.307 |
| 2.382 | -2.306 |
| 2.383 | -2.305 |
| 2.384 | -2.303 |
| 2.385 | -2.302 |
| 2.386 | -2.301 |
| 2.387 | -2.3 |
| 2.388 | -2.299 |
| 2.389 | -2.298 |
| 2.39 | -2.297 |
| 2.391 | -2.296 |
| 2.392 | -2.295 |
| 2.393 | -2.294 |
| 2.394 | -2.293 |
| 2.395 | -2.292 |
| 2.396 | -2.291 |
| 2.397 | -2.29 |
| 2.398 | -2.289 |
| 2.399 | -2.288 |
| 2.4 | -2.286 |
| 2.401 | -2.285 |
| 2.402 | -2.284 |
| 2.403 | -2.283 |
| 2.404 | -2.282 |
| 2.405 | -2.281 |
| 2.406 | -2.28 |
| 2.407 | -2.279 |
| 2.408 | -2.278 |
| 2.409 | -2.277 |
| 2.41 | -2.276 |
| 2.411 | -2.275 |
| 2.412 | -2.274 |
| 2.413 | -2.273 |
| 2.414 | -2.272 |
| 2.415 | -2.27 |
| 2.416 | -2.269 |
| 2.417 | -2.268 |
| 2.418 | -2.267 |
| 2.419 | -2.266 |
| 2.42 | -2.265 |
| 2.421 | -2.264 |
| 2.422 | -2.263 |
| 2.423 | -2.262 |
| 2.424 | -2.261 |
| 2.425 | -2.26 |
| 2.426 | -2.259 |
| 2.427 | -2.258 |
| 2.428 | -2.256 |
| 2.429 | -2.255 |
| 2.43 | -2.254 |
| 2.431 | -2.253 |
| 2.432 | -2.252 |
| 2.433 | -2.251 |
| 2.434 | -2.25 |
| 2.435 | -2.249 |
| 2.436 | -2.248 |
| 2.437 | -2.247 |
| 2.438 | -2.246 |
| 2.439 | -2.245 |
| 2.44 | -2.244 |
| 2.441 | -2.242 |
| 2.442 | -2.241 |
| 2.443 | -2.24 |
| 2.444 | -2.239 |
| 2.445 | -2.238 |
| 2.446 | -2.237 |
| 2.447 | -2.236 |
| 2.448 | -2.235 |
| 2.449 | -2.234 |
| 2.45 | -2.233 |
| 2.451 | -2.232 |
| 2.452 | -2.231 |
| 2.453 | -2.229 |
| 2.454 | -2.228 |
| 2.455 | -2.227 |
| 2.456 | -2.226 |
| 2.457 | -2.225 |
| 2.458 | -2.224 |
| 2.459 | -2.223 |
| 2.46 | -2.222 |
| 2.461 | -2.221 |
| 2.462 | -2.22 |
| 2.463 | -2.219 |
| 2.464 | -2.218 |
| 2.465 | -2.216 |
| 2.466 | -2.215 |
| 2.467 | -2.214 |
| 2.468 | -2.213 |
| 2.469 | -2.212 |
| 2.47 | -2.211 |
| 2.471 | -2.21 |
| 2.472 | -2.209 |
| 2.473 | -2.208 |
| 2.474 | -2.207 |
| 2.475 | -2.205 |
| 2.476 | -2.204 |
| 2.477 | -2.203 |
| 2.478 | -2.202 |
| 2.479 | -2.201 |
| 2.48 | -2.2 |
| 2.481 | -2.199 |
| 2.482 | -2.198 |
| 2.483 | -2.197 |
| 2.484 | -2.196 |
| 2.485 | -2.195 |
| 2.486 | -2.193 |
| 2.487 | -2.192 |
| 2.488 | -2.191 |
| 2.489 | -2.19 |
| 2.49 | -2.189 |
| 2.491 | -2.188 |
| 2.492 | -2.187 |
| 2.493 | -2.186 |
| 2.494 | -2.185 |
| 2.495 | -2.184 |
| 2.496 | -2.182 |
| 2.497 | -2.181 |
| 2.498 | -2.18 |
| 2.499 | -2.179 |
| 2.5 | -2.178 |
| 2.501 | -2.177 |
| 2.502 | -2.176 |
| 2.503 | -2.175 |
| 2.504 | -2.174 |
| 2.505 | -2.172 |
| 2.506 | -2.171 |
| 2.507 | -2.17 |
| 2.508 | -2.169 |
| 2.509 | -2.168 |
| 2.51 | -2.167 |
| 2.511 | -2.166 |
| 2.512 | -2.165 |
| 2.513 | -2.164 |
| 2.514 | -2.162 |
| 2.515 | -2.161 |
| 2.516 | -2.16 |
| 2.517 | -2.159 |
| 2.518 | -2.158 |
| 2.519 | -2.157 |
| 2.52 | -2.156 |
| 2.521 | -2.155 |
| 2.522 | -2.154 |
| 2.523 | -2.152 |
| 2.524 | -2.151 |
| 2.525 | -2.15 |
| 2.526 | -2.149 |
| 2.527 | -2.148 |
| 2.528 | -2.147 |
| 2.529 | -2.146 |
| 2.53 | -2.145 |
| 2.531 | -2.144 |
| 2.532 | -2.142 |
| 2.533 | -2.141 |
| 2.534 | -2.14 |
| 2.535 | -2.139 |
| 2.536 | -2.138 |
| 2.537 | -2.137 |
| 2.538 | -2.136 |
| 2.539 | -2.135 |
| 2.54 | -2.133 |
| 2.541 | -2.132 |
| 2.542 | -2.131 |
| 2.543 | -2.13 |
| 2.544 | -2.129 |
| 2.545 | -2.128 |
| 2.546 | -2.127 |
| 2.547 | -2.126 |
| 2.548 | -2.125 |
| 2.549 | -2.123 |
| 2.55 | -2.122 |
| 2.551 | -2.121 |
| 2.552 | -2.12 |
| 2.553 | -2.119 |
| 2.554 | -2.118 |
| 2.555 | -2.117 |
| 2.556 | -2.116 |
| 2.557 | -2.114 |
| 2.558 | -2.113 |
| 2.559 | -2.112 |
| 2.56 | -2.111 |
| 2.561 | -2.11 |
| 2.562 | -2.109 |
| 2.563 | -2.108 |
| 2.564 | -2.106 |
| 2.565 | -2.105 |
| 2.566 | -2.104 |
| 2.567 | -2.103 |
| 2.568 | -2.102 |
| 2.569 | -2.101 |
| 2.57 | -2.1 |
| 2.571 | -2.099 |
| 2.572 | -2.097 |
| 2.573 | -2.096 |
| 2.574 | -2.095 |
| 2.575 | -2.094 |
| 2.576 | -2.093 |
| 2.577 | -2.092 |
| 2.578 | -2.091 |
| 2.579 | -2.089 |
| 2.58 | -2.088 |
| 2.581 | -2.087 |
| 2.582 | -2.086 |
| 2.583 | -2.085 |
| 2.584 | -2.084 |
| 2.585 | -2.083 |
| 2.586 | -2.081 |
| 2.587 | -2.08 |
| 2.588 | -2.079 |
| 2.589 | -2.078 |
| 2.59 | -2.077 |
| 2.591 | -2.076 |
| 2.592 | -2.075 |
| 2.593 | -2.074 |
| 2.594 | -2.072 |
| 2.595 | -2.071 |
| 2.596 | -2.07 |
| 2.597 | -2.069 |
| 2.598 | -2.068 |
| 2.599 | -2.067 |
| 2.6 | -2.065 |
| 2.601 | -2.064 |
| 2.602 | -2.063 |
| 2.603 | -2.062 |
| 2.604 | -2.061 |
| 2.605 | -2.06 |
| 2.606 | -2.059 |
| 2.607 | -2.057 |
| 2.608 | -2.056 |
| 2.609 | -2.055 |
| 2.61 | -2.054 |
| 2.611 | -2.053 |
| 2.612 | -2.052 |
| 2.613 | -2.051 |
| 2.614 | -2.049 |
| 2.615 | -2.048 |
| 2.616 | -2.047 |
| 2.617 | -2.046 |
| 2.618 | -2.045 |
| 2.619 | -2.044 |
| 2.62 | -2.042 |
| 2.621 | -2.041 |
| 2.622 | -2.04 |
| 2.623 | -2.039 |
| 2.624 | -2.038 |
| 2.625 | -2.037 |
| 2.626 | -2.036 |
| 2.627 | -2.034 |
| 2.628 | -2.033 |
| 2.629 | -2.032 |
| 2.63 | -2.031 |
| 2.631 | -2.03 |
| 2.632 | -2.029 |
| 2.633 | -2.027 |
| 2.634 | -2.026 |
| 2.635 | -2.025 |
| 2.636 | -2.024 |
| 2.637 | -2.023 |
| 2.638 | -2.022 |
| 2.639 | -2.02 |
| 2.64 | -2.019 |
| 2.641 | -2.018 |
| 2.642 | -2.017 |
| 2.643 | -2.016 |
| 2.644 | -2.015 |
| 2.645 | -2.014 |
| 2.646 | -2.012 |
| 2.647 | -2.011 |
| 2.648 | -2.01 |
| 2.649 | -2.009 |
| 2.65 | -2.008 |
| 2.651 | -2.007 |
| 2.652 | -2.005 |
| 2.653 | -2.004 |
| 2.654 | -2.003 |
| 2.655 | -2.002 |
| 2.656 | -2.001 |
| 2.657 | -1.999 |
| 2.658 | -1.998 |
| 2.659 | -1.997 |
| 2.66 | -1.996 |
| 2.661 | -1.995 |
| 2.662 | -1.994 |
| 2.663 | -1.992 |
| 2.664 | -1.991 |
| 2.665 | -1.99 |
| 2.666 | -1.989 |
| 2.667 | -1.988 |
| 2.668 | -1.987 |
| 2.669 | -1.985 |
| 2.67 | -1.984 |
| 2.671 | -1.983 |
| 2.672 | -1.982 |
| 2.673 | -1.981 |
| 2.674 | -1.98 |
| 2.675 | -1.978 |
| 2.676 | -1.977 |
| 2.677 | -1.976 |
| 2.678 | -1.975 |
| 2.679 | -1.974 |
| 2.68 | -1.972 |
| 2.681 | -1.971 |
| 2.682 | -1.97 |
| 2.683 | -1.969 |
| 2.684 | -1.968 |
| 2.685 | -1.967 |
| 2.686 | -1.965 |
| 2.687 | -1.964 |
| 2.688 | -1.963 |
| 2.689 | -1.962 |
| 2.69 | -1.961 |
| 2.691 | -1.959 |
| 2.692 | -1.958 |
| 2.693 | -1.957 |
| 2.694 | -1.956 |
| 2.695 | -1.955 |
| 2.696 | -1.954 |
| 2.697 | -1.952 |
| 2.698 | -1.951 |
| 2.699 | -1.95 |
| 2.7 | -1.949 |
| 2.701 | -1.948 |
| 2.702 | -1.946 |
| 2.703 | -1.945 |
| 2.704 | -1.944 |
| 2.705 | -1.943 |
| 2.706 | -1.942 |
| 2.707 | -1.94 |
| 2.708 | -1.939 |
| 2.709 | -1.938 |
| 2.71 | -1.937 |
| 2.711 | -1.936 |
| 2.712 | -1.935 |
| 2.713 | -1.933 |
| 2.714 | -1.932 |
| 2.715 | -1.931 |
| 2.716 | -1.93 |
| 2.717 | -1.929 |
| 2.718 | -1.927 |
| 2.719 | -1.926 |
| 2.72 | -1.925 |
| 2.721 | -1.924 |
| 2.722 | -1.923 |
| 2.723 | -1.921 |
| 2.724 | -1.92 |
| 2.725 | -1.919 |
| 2.726 | -1.918 |
| 2.727 | -1.917 |
| 2.728 | -1.915 |
| 2.729 | -1.914 |
| 2.73 | -1.913 |
| 2.731 | -1.912 |
| 2.732 | -1.911 |
| 2.733 | -1.909 |
| 2.734 | -1.908 |
| 2.735 | -1.907 |
| 2.736 | -1.906 |
| 2.737 | -1.905 |
| 2.738 | -1.903 |
| 2.739 | -1.902 |
| 2.74 | -1.901 |
| 2.741 | -1.9 |
| 2.742 | -1.899 |
| 2.743 | -1.897 |
| 2.744 | -1.896 |
| 2.745 | -1.895 |
| 2.746 | -1.894 |
| 2.747 | -1.892 |
| 2.748 | -1.891 |
| 2.749 | -1.89 |
| 2.75 | -1.889 |
| 2.751 | -1.888 |
| 2.752 | -1.886 |
| 2.753 | -1.885 |
| 2.754 | -1.884 |
| 2.755 | -1.883 |
| 2.756 | -1.882 |
| 2.757 | -1.88 |
| 2.758 | -1.879 |
| 2.759 | -1.878 |
| 2.76 | -1.877 |
| 2.761 | -1.876 |
| 2.762 | -1.874 |
| 2.763 | -1.873 |
| 2.764 | -1.872 |
| 2.765 | -1.871 |
| 2.766 | -1.869 |
| 2.767 | -1.868 |
| 2.768 | -1.867 |
| 2.769 | -1.866 |
| 2.77 | -1.865 |
| 2.771 | -1.863 |
| 2.772 | -1.862 |
| 2.773 | -1.861 |
| 2.774 | -1.86 |
| 2.775 | -1.858 |
| 2.776 | -1.857 |
| 2.777 | -1.856 |
| 2.778 | -1.855 |
| 2.779 | -1.854 |
| 2.78 | -1.852 |
| 2.781 | -1.851 |
| 2.782 | -1.85 |
| 2.783 | -1.849 |
| 2.784 | -1.847 |
| 2.785 | -1.846 |
| 2.786 | -1.845 |
| 2.787 | -1.844 |
| 2.788 | -1.843 |
| 2.789 | -1.841 |
| 2.79 | -1.84 |
| 2.791 | -1.839 |
| 2.792 | -1.838 |
| 2.793 | -1.836 |
| 2.794 | -1.835 |
| 2.795 | -1.834 |
| 2.796 | -1.833 |
| 2.797 | -1.831 |
| 2.798 | -1.83 |
| 2.799 | -1.829 |
| 2.8 | -1.828 |
| 2.801 | -1.827 |
| 2.802 | -1.825 |
| 2.803 | -1.824 |
| 2.804 | -1.823 |
| 2.805 | -1.822 |
| 2.806 | -1.82 |
| 2.807 | -1.819 |
| 2.808 | -1.818 |
| 2.809 | -1.817 |
| 2.81 | -1.815 |
| 2.811 | -1.814 |
| 2.812 | -1.813 |
| 2.813 | -1.812 |
| 2.814 | -1.81 |
| 2.815 | -1.809 |
| 2.816 | -1.808 |
| 2.817 | -1.807 |
| 2.818 | -1.806 |
| 2.819 | -1.804 |
| 2.82 | -1.803 |
| 2.821 | -1.802 |
| 2.822 | -1.801 |
| 2.823 | -1.799 |
| 2.824 | -1.798 |
| 2.825 | -1.797 |
| 2.826 | -1.796 |
| 2.827 | -1.794 |
| 2.828 | -1.793 |
| 2.829 | -1.792 |
| 2.83 | -1.791 |
| 2.831 | -1.789 |
| 2.832 | -1.788 |
| 2.833 | -1.787 |
| 2.834 | -1.786 |
| 2.835 | -1.784 |
| 2.836 | -1.783 |
| 2.837 | -1.782 |
| 2.838 | -1.781 |
| 2.839 | -1.779 |
| 2.84 | -1.778 |
| 2.841 | -1.777 |
| 2.842 | -1.776 |
| 2.843 | -1.774 |
| 2.844 | -1.773 |
| 2.845 | -1.772 |
| 2.846 | -1.771 |
| 2.847 | -1.769 |
| 2.848 | -1.768 |
| 2.849 | -1.767 |
| 2.85 | -1.766 |
| 2.851 | -1.764 |
| 2.852 | -1.763 |
| 2.853 | -1.762 |
| 2.854 | -1.761 |
| 2.855 | -1.759 |
| 2.856 | -1.758 |
| 2.857 | -1.757 |
| 2.858 | -1.756 |
| 2.859 | -1.754 |
| 2.86 | -1.753 |
| 2.861 | -1.752 |
| 2.862 | -1.751 |
| 2.863 | -1.749 |
| 2.864 | -1.748 |
| 2.865 | -1.747 |
| 2.866 | -1.746 |
| 2.867 | -1.744 |
| 2.868 | -1.743 |
| 2.869 | -1.742 |
| 2.87 | -1.74 |
| 2.871 | -1.739 |
| 2.872 | -1.738 |
| 2.873 | -1.737 |
| 2.874 | -1.735 |
| 2.875 | -1.734 |
| 2.876 | -1.733 |
| 2.877 | -1.732 |
| 2.878 | -1.73 |
| 2.879 | -1.729 |
| 2.88 | -1.728 |
| 2.881 | -1.727 |
| 2.882 | -1.725 |
| 2.883 | -1.724 |
| 2.884 | -1.723 |
| 2.885 | -1.721 |
| 2.886 | -1.72 |
| 2.887 | -1.719 |
| 2.888 | -1.718 |
| 2.889 | -1.716 |
| 2.89 | -1.715 |
| 2.891 | -1.714 |
| 2.892 | -1.713 |
| 2.893 | -1.711 |
| 2.894 | -1.71 |
| 2.895 | -1.709 |
| 2.896 | -1.707 |
| 2.897 | -1.706 |
| 2.898 | -1.705 |
| 2.899 | -1.704 |
| 2.9 | -1.702 |
| 2.901 | -1.701 |
| 2.902 | -1.7 |
| 2.903 | -1.699 |
| 2.904 | -1.697 |
| 2.905 | -1.696 |
| 2.906 | -1.695 |
| 2.907 | -1.693 |
| 2.908 | -1.692 |
| 2.909 | -1.691 |
| 2.91 | -1.69 |
| 2.911 | -1.688 |
| 2.912 | -1.687 |
| 2.913 | -1.686 |
| 2.914 | -1.684 |
| 2.915 | -1.683 |
| 2.916 | -1.682 |
| 2.917 | -1.681 |
| 2.918 | -1.679 |
| 2.919 | -1.678 |
| 2.92 | -1.677 |
| 2.921 | -1.675 |
| 2.922 | -1.674 |
| 2.923 | -1.673 |
| 2.924 | -1.672 |
| 2.925 | -1.67 |
| 2.926 | -1.669 |
| 2.927 | -1.668 |
| 2.928 | -1.666 |
| 2.929 | -1.665 |
| 2.93 | -1.664 |
| 2.931 | -1.663 |
| 2.932 | -1.661 |
| 2.933 | -1.66 |
| 2.934 | -1.659 |
| 2.935 | -1.657 |
| 2.936 | -1.656 |
| 2.937 | -1.655 |
| 2.938 | -1.654 |
| 2.939 | -1.652 |
| 2.94 | -1.651 |
| 2.941 | -1.65 |
| 2.942 | -1.648 |
| 2.943 | -1.647 |
| 2.944 | -1.646 |
| 2.945 | -1.644 |
| 2.946 | -1.643 |
| 2.947 | -1.642 |
| 2.948 | -1.641 |
| 2.949 | -1.639 |
| 2.95 | -1.638 |
| 2.951 | -1.637 |
| 2.952 | -1.635 |
| 2.953 | -1.634 |
| 2.954 | -1.633 |
| 2.955 | -1.631 |
| 2.956 | -1.63 |
| 2.957 | -1.629 |
| 2.958 | -1.628 |
| 2.959 | -1.626 |
| 2.96 | -1.625 |
| 2.961 | -1.624 |
| 2.962 | -1.622 |
| 2.963 | -1.621 |
| 2.964 | -1.62 |
| 2.965 | -1.618 |
| 2.966 | -1.617 |
| 2.967 | -1.616 |
| 2.968 | -1.614 |
| 2.969 | -1.613 |
| 2.97 | -1.612 |
| 2.971 | -1.611 |
| 2.972 | -1.609 |
| 2.973 | -1.608 |
| 2.974 | -1.607 |
| 2.975 | -1.605 |
| 2.976 | -1.604 |
| 2.977 | -1.603 |
| 2.978 | -1.601 |
| 2.979 | -1.6 |
| 2.98 | -1.599 |
| 2.981 | -1.597 |
| 2.982 | -1.596 |
| 2.983 | -1.595 |
| 2.984 | -1.594 |
| 2.985 | -1.592 |
| 2.986 | -1.591 |
| 2.987 | -1.59 |
| 2.988 | -1.588 |
| 2.989 | -1.587 |
| 2.99 | -1.586 |
| 2.991 | -1.584 |
| 2.992 | -1.583 |
| 2.993 | -1.582 |
| 2.994 | -1.58 |
| 2.995 | -1.579 |
| 2.996 | -1.578 |
| 2.997 | -1.576 |
| 2.998 | -1.575 |
| 2.999 | -1.574 |
| 3.0 | -1.572 |
| 3.001 | -1.571 |
| 3.002 | -1.57 |
| 3.003 | -1.568 |
| 3.004 | -1.567 |
| 3.005 | -1.566 |
| 3.006 | -1.564 |
| 3.007 | -1.563 |
| 3.008 | -1.562 |
| 3.009 | -1.56 |
| 3.01 | -1.559 |
| 3.011 | -1.558 |
| 3.012 | -1.556 |
| 3.013 | -1.555 |
| 3.014 | -1.554 |
| 3.015 | -1.553 |
| 3.016 | -1.551 |
| 3.017 | -1.55 |
| 3.018 | -1.549 |
| 3.019 | -1.547 |
| 3.02 | -1.546 |
| 3.021 | -1.545 |
| 3.022 | -1.543 |
| 3.023 | -1.542 |
| 3.024 | -1.541 |
| 3.025 | -1.539 |
| 3.026 | -1.538 |
| 3.027 | -1.537 |
| 3.028 | -1.535 |
| 3.029 | -1.534 |
| 3.03 | -1.533 |
| 3.031 | -1.531 |
| 3.032 | -1.53 |
| 3.033 | -1.528 |
| 3.034 | -1.527 |
| 3.035 | -1.526 |
| 3.036 | -1.524 |
| 3.037 | -1.523 |
| 3.038 | -1.522 |
| 3.039 | -1.52 |
| 3.04 | -1.519 |
| 3.041 | -1.518 |
| 3.042 | -1.516 |
| 3.043 | -1.515 |
| 3.044 | -1.514 |
| 3.045 | -1.512 |
| 3.046 | -1.511 |
| 3.047 | -1.51 |
| 3.048 | -1.508 |
| 3.049 | -1.507 |
| 3.05 | -1.506 |
| 3.051 | -1.504 |
| 3.052 | -1.503 |
| 3.053 | -1.502 |
| 3.054 | -1.5 |
| 3.055 | -1.499 |
| 3.056 | -1.498 |
| 3.057 | -1.496 |
| 3.058 | -1.495 |
| 3.059 | -1.494 |
| 3.06 | -1.492 |
| 3.061 | -1.491 |
| 3.062 | -1.489 |
| 3.063 | -1.488 |
| 3.064 | -1.487 |
| 3.065 | -1.485 |
| 3.066 | -1.484 |
| 3.067 | -1.483 |
| 3.068 | -1.481 |
| 3.069 | -1.48 |
| 3.07 | -1.479 |
| 3.071 | -1.477 |
| 3.072 | -1.476 |
| 3.073 | -1.475 |
| 3.074 | -1.473 |
| 3.075 | -1.472 |
| 3.076 | -1.471 |
| 3.077 | -1.469 |
| 3.078 | -1.468 |
| 3.079 | -1.466 |
| 3.08 | -1.465 |
| 3.081 | -1.464 |
| 3.082 | -1.462 |
| 3.083 | -1.461 |
| 3.084 | -1.46 |
| 3.085 | -1.458 |
| 3.086 | -1.457 |
| 3.087 | -1.456 |
| 3.088 | -1.454 |
| 3.089 | -1.453 |
| 3.09 | -1.451 |
| 3.091 | -1.45 |
| 3.092 | -1.449 |
| 3.093 | -1.447 |
| 3.094 | -1.446 |
| 3.095 | -1.445 |
| 3.096 | -1.443 |
| 3.097 | -1.442 |
| 3.098 | -1.441 |
| 3.099 | -1.439 |
| 3.1 | -1.438 |
| 3.101 | -1.436 |
| 3.102 | -1.435 |
| 3.103 | -1.434 |
| 3.104 | -1.432 |
| 3.105 | -1.431 |
| 3.106 | -1.43 |
| 3.107 | -1.428 |
| 3.108 | -1.427 |
| 3.109 | -1.425 |
| 3.11 | -1.424 |
| 3.111 | -1.423 |
| 3.112 | -1.421 |
| 3.113 | -1.42 |
| 3.114 | -1.419 |
| 3.115 | -1.417 |
| 3.116 | -1.416 |
| 3.117 | -1.414 |
| 3.118 | -1.413 |
| 3.119 | -1.412 |
| 3.12 | -1.41 |
| 3.121 | -1.409 |
| 3.122 | -1.408 |
| 3.123 | -1.406 |
| 3.124 | -1.405 |
| 3.125 | -1.403 |
| 3.126 | -1.402 |
| 3.127 | -1.401 |
| 3.128 | -1.399 |
| 3.129 | -1.398 |
| 3.13 | -1.396 |
| 3.131 | -1.395 |
| 3.132 | -1.394 |
| 3.133 | -1.392 |
| 3.134 | -1.391 |
| 3.135 | -1.39 |
| 3.136 | -1.388 |
| 3.137 | -1.387 |
| 3.138 | -1.385 |
| 3.139 | -1.384 |
| 3.14 | -1.383 |
| 3.141 | -1.381 |
| 3.142 | -1.38 |
| 3.143 | -1.378 |
| 3.144 | -1.377 |
| 3.145 | -1.376 |
| 3.146 | -1.374 |
| 3.147 | -1.373 |
| 3.148 | -1.371 |
| 3.149 | -1.37 |
| 3.15 | -1.369 |
| 3.151 | -1.367 |
| 3.152 | -1.366 |
| 3.153 | -1.365 |
| 3.154 | -1.363 |
| 3.155 | -1.362 |
| 3.156 | -1.36 |
| 3.157 | -1.359 |
| 3.158 | -1.358 |
| 3.159 | -1.356 |
| 3.16 | -1.355 |
| 3.161 | -1.353 |
| 3.162 | -1.352 |
| 3.163 | -1.351 |
| 3.164 | -1.349 |
| 3.165 | -1.348 |
| 3.166 | -1.346 |
| 3.167 | -1.345 |
| 3.168 | -1.344 |
| 3.169 | -1.342 |
| 3.17 | -1.341 |
| 3.171 | -1.339 |
| 3.172 | -1.338 |
| 3.173 | -1.337 |
| 3.174 | -1.335 |
| 3.175 | -1.334 |
| 3.176 | -1.332 |
| 3.177 | -1.331 |
| 3.178 | -1.33 |
| 3.179 | -1.328 |
| 3.18 | -1.327 |
| 3.181 | -1.325 |
| 3.182 | -1.324 |
| 3.183 | -1.322 |
| 3.184 | -1.321 |
| 3.185 | -1.32 |
| 3.186 | -1.318 |
| 3.187 | -1.317 |
| 3.188 | -1.315 |
| 3.189 | -1.314 |
| 3.19 | -1.313 |
| 3.191 | -1.311 |
| 3.192 | -1.31 |
| 3.193 | -1.308 |
| 3.194 | -1.307 |
| 3.195 | -1.306 |
| 3.196 | -1.304 |
| 3.197 | -1.303 |
| 3.198 | -1.301 |
| 3.199 | -1.3 |
| 3.2 | -1.298 |
| 3.201 | -1.297 |
| 3.202 | -1.296 |
| 3.203 | -1.294 |
| 3.204 | -1.293 |
| 3.205 | -1.291 |
| 3.206 | -1.29 |
| 3.207 | -1.288 |
| 3.208 | -1.287 |
| 3.209 | -1.286 |
| 3.21 | -1.284 |
| 3.211 | -1.283 |
| 3.212 | -1.281 |
| 3.213 | -1.28 |
| 3.214 | -1.279 |
| 3.215 | -1.277 |
| 3.216 | -1.276 |
| 3.217 | -1.274 |
| 3.218 | -1.273 |
| 3.219 | -1.271 |
| 3.22 | -1.27 |
| 3.221 | -1.269 |
| 3.222 | -1.267 |
| 3.223 | -1.266 |
| 3.224 | -1.264 |
| 3.225 | -1.263 |
| 3.226 | -1.261 |
| 3.227 | -1.26 |
| 3.228 | -1.259 |
| 3.229 | -1.257 |
| 3.23 | -1.256 |
| 3.231 | -1.254 |
| 3.232 | -1.253 |
| 3.233 | -1.251 |
| 3.234 | -1.25 |
| 3.235 | -1.249 |
| 3.236 | -1.247 |
| 3.237 | -1.246 |
| 3.238 | -1.244 |
| 3.239 | -1.243 |
| 3.24 | -1.241 |
| 3.241 | -1.24 |
| 3.242 | -1.238 |
| 3.243 | -1.237 |
| 3.244 | -1.236 |
| 3.245 | -1.234 |
| 3.246 | -1.233 |
| 3.247 | -1.231 |
| 3.248 | -1.23 |
| 3.249 | -1.228 |
| 3.25 | -1.227 |
| 3.251 | -1.225 |
| 3.252 | -1.224 |
| 3.253 | -1.223 |
| 3.254 | -1.221 |
| 3.255 | -1.22 |
| 3.256 | -1.218 |
| 3.257 | -1.217 |
| 3.258 | -1.215 |
| 3.259 | -1.214 |
| 3.26 | -1.212 |
| 3.261 | -1.211 |
| 3.262 | -1.21 |
| 3.263 | -1.208 |
| 3.264 | -1.207 |
| 3.265 | -1.205 |
| 3.266 | -1.204 |
| 3.267 | -1.202 |
| 3.268 | -1.201 |
| 3.269 | -1.199 |
| 3.27 | -1.198 |
| 3.271 | -1.197 |
| 3.272 | -1.195 |
| 3.273 | -1.194 |
| 3.274 | -1.192 |
| 3.275 | -1.191 |
| 3.276 | -1.189 |
| 3.277 | -1.188 |
| 3.278 | -1.186 |
| 3.279 | -1.185 |
| 3.28 | -1.183 |
| 3.281 | -1.182 |
| 3.282 | -1.181 |
| 3.283 | -1.179 |
| 3.284 | -1.178 |
| 3.285 | -1.176 |
| 3.286 | -1.175 |
| 3.287 | -1.173 |
| 3.288 | -1.172 |
| 3.289 | -1.17 |
| 3.29 | -1.169 |
| 3.291 | -1.167 |
| 3.292 | -1.166 |
| 3.293 | -1.164 |
| 3.294 | -1.163 |
| 3.295 | -1.162 |
| 3.296 | -1.16 |
| 3.297 | -1.159 |
| 3.298 | -1.157 |
| 3.299 | -1.156 |
| 3.3 | -1.154 |
| 3.301 | -1.153 |
| 3.302 | -1.151 |
| 3.303 | -1.15 |
| 3.304 | -1.148 |
| 3.305 | -1.147 |
| 3.306 | -1.145 |
| 3.307 | -1.144 |
| 3.308 | -1.142 |
| 3.309 | -1.141 |
| 3.31 | -1.14 |
| 3.311 | -1.138 |
| 3.312 | -1.137 |
| 3.313 | -1.135 |
| 3.314 | -1.134 |
| 3.315 | -1.132 |
| 3.316 | -1.131 |
| 3.317 | -1.129 |
| 3.318 | -1.128 |
| 3.319 | -1.126 |
| 3.32 | -1.125 |
| 3.321 | -1.123 |
| 3.322 | -1.122 |
| 3.323 | -1.12 |
| 3.324 | -1.119 |
| 3.325 | -1.117 |
| 3.326 | -1.116 |
| 3.327 | -1.114 |
| 3.328 | -1.113 |
| 3.329 | -1.111 |
| 3.33 | -1.11 |
| 3.331 | -1.109 |
| 3.332 | -1.107 |
| 3.333 | -1.106 |
| 3.334 | -1.104 |
| 3.335 | -1.103 |
| 3.336 | -1.101 |
| 3.337 | -1.1 |
| 3.338 | -1.098 |
| 3.339 | -1.097 |
| 3.34 | -1.095 |
| 3.341 | -1.094 |
| 3.342 | -1.092 |
| 3.343 | -1.091 |
| 3.344 | -1.089 |
| 3.345 | -1.088 |
| 3.346 | -1.086 |
| 3.347 | -1.085 |
| 3.348 | -1.083 |
| 3.349 | -1.082 |
| 3.35 | -1.08 |
| 3.351 | -1.079 |
| 3.352 | -1.077 |
| 3.353 | -1.076 |
| 3.354 | -1.074 |
| 3.355 | -1.073 |
| 3.356 | -1.071 |
| 3.357 | -1.07 |
| 3.358 | -1.068 |
| 3.359 | -1.067 |
| 3.36 | -1.065 |
| 3.361 | -1.064 |
| 3.362 | -1.062 |
| 3.363 | -1.061 |
| 3.364 | -1.059 |
| 3.365 | -1.058 |
| 3.366 | -1.056 |
| 3.367 | -1.055 |
| 3.368 | -1.053 |
| 3.369 | -1.052 |
| 3.37 | -1.05 |
| 3.371 | -1.049 |
| 3.372 | -1.047 |
| 3.373 | -1.046 |
| 3.374 | -1.044 |
| 3.375 | -1.043 |
| 3.376 | -1.041 |
| 3.377 | -1.04 |
| 3.378 | -1.038 |
| 3.379 | -1.037 |
| 3.38 | -1.035 |
| 3.381 | -1.034 |
| 3.382 | -1.032 |
| 3.383 | -1.031 |
| 3.384 | -1.029 |
| 3.385 | -1.028 |
| 3.386 | -1.026 |
| 3.387 | -1.025 |
| 3.388 | -1.023 |
| 3.389 | -1.022 |
| 3.39 | -1.02 |
| 3.391 | -1.019 |
| 3.392 | -1.017 |
| 3.393 | -1.016 |
| 3.394 | -1.014 |
| 3.395 | -1.013 |
| 3.396 | -1.011 |
| 3.397 | -1.01 |
| 3.398 | -1.008 |
| 3.399 | -1.007 |
| 3.4 | -1.005 |
| 3.401 | -1.004 |
| 3.402 | -1.002 |
| 3.403 | -1 |
| 3.404 | -0.999 |
| 3.405 | -0.997 |
| 3.406 | -0.996 |
| 3.407 | -0.994 |
| 3.408 | -0.993 |
| 3.409 | -0.991 |
| 3.41 | -0.99 |
| 3.411 | -0.988 |
| 3.412 | -0.987 |
| 3.413 | -0.985 |
| 3.414 | -0.984 |
| 3.415 | -0.982 |
| 3.416 | -0.981 |
| 3.417 | -0.979 |
| 3.418 | -0.978 |
| 3.419 | -0.976 |
| 3.42 | -0.975 |
| 3.421 | -0.973 |
| 3.422 | -0.972 |
| 3.423 | -0.97 |
| 3.424 | -0.969 |
| 3.425 | -0.967 |
| 3.426 | -0.965 |
| 3.427 | -0.964 |
| 3.428 | -0.962 |
| 3.429 | -0.961 |
| 3.43 | -0.959 |
| 3.431 | -0.958 |
| 3.432 | -0.956 |
| 3.433 | -0.955 |
| 3.434 | -0.953 |
| 3.435 | -0.952 |
| 3.436 | -0.95 |
| 3.437 | -0.949 |
| 3.438 | -0.947 |
| 3.439 | -0.946 |
| 3.44 | -0.944 |
| 3.441 | -0.942 |
| 3.442 | -0.941 |
| 3.443 | -0.939 |
| 3.444 | -0.938 |
| 3.445 | -0.936 |
| 3.446 | -0.935 |
| 3.447 | -0.933 |
| 3.448 | -0.932 |
| 3.449 | -0.93 |
| 3.45 | -0.929 |
| 3.451 | -0.927 |
| 3.452 | -0.926 |
| 3.453 | -0.924 |
| 3.454 | -0.922 |
| 3.455 | -0.921 |
| 3.456 | -0.919 |
| 3.457 | -0.918 |
| 3.458 | -0.916 |
| 3.459 | -0.915 |
| 3.46 | -0.913 |
| 3.461 | -0.912 |
| 3.462 | -0.91 |
| 3.463 | -0.908 |
| 3.464 | -0.907 |
| 3.465 | -0.905 |
| 3.466 | -0.904 |
| 3.467 | -0.902 |
| 3.468 | -0.901 |
| 3.469 | -0.899 |
| 3.47 | -0.898 |
| 3.471 | -0.896 |
| 3.472 | -0.895 |
| 3.473 | -0.893 |
| 3.474 | -0.891 |
| 3.475 | -0.89 |
| 3.476 | -0.888 |
| 3.477 | -0.887 |
| 3.478 | -0.885 |
| 3.479 | -0.884 |
| 3.48 | -0.882 |
| 3.481 | -0.881 |
| 3.482 | -0.879 |
| 3.483 | -0.877 |
| 3.484 | -0.876 |
| 3.485 | -0.874 |
| 3.486 | -0.873 |
| 3.487 | -0.871 |
| 3.488 | -0.87 |
| 3.489 | -0.868 |
| 3.49 | -0.866 |
| 3.491 | -0.865 |
| 3.492 | -0.863 |
| 3.493 | -0.862 |
| 3.494 | -0.86 |
| 3.495 | -0.859 |
| 3.496 | -0.857 |
| 3.497 | -0.856 |
| 3.498 | -0.854 |
| 3.499 | -0.852 |
| 3.5 | -0.851 |
| 3.501 | -0.849 |
| 3.502 | -0.848 |
| 3.503 | -0.846 |
| 3.504 | -0.845 |
| 3.505 | -0.843 |
| 3.506 | -0.841 |
| 3.507 | -0.84 |
| 3.508 | -0.838 |
| 3.509 | -0.837 |
| 3.51 | -0.835 |
| 3.511 | -0.834 |
| 3.512 | -0.832 |
| 3.513 | -0.83 |
| 3.514 | -0.829 |
| 3.515 | -0.827 |
| 3.516 | -0.826 |
| 3.517 | -0.824 |
| 3.518 | -0.823 |
| 3.519 | -0.821 |
| 3.52 | -0.819 |
| 3.521 | -0.818 |
| 3.522 | -0.816 |
| 3.523 | -0.815 |
| 3.524 | -0.813 |
| 3.525 | -0.811 |
| 3.526 | -0.81 |
| 3.527 | -0.808 |
| 3.528 | -0.807 |
| 3.529 | -0.805 |
| 3.53 | -0.804 |
| 3.531 | -0.802 |
| 3.532 | -0.8 |
| 3.533 | -0.799 |
| 3.534 | -0.797 |
| 3.535 | -0.796 |
| 3.536 | -0.794 |
| 3.537 | -0.792 |
| 3.538 | -0.791 |
| 3.539 | -0.789 |
| 3.54 | -0.788 |
| 3.541 | -0.786 |
| 3.542 | -0.785 |
| 3.543 | -0.783 |
| 3.544 | -0.781 |
| 3.545 | -0.78 |
| 3.546 | -0.778 |
| 3.547 | -0.777 |
| 3.548 | -0.775 |
| 3.549 | -0.773 |
| 3.55 | -0.772 |
| 3.551 | -0.77 |
| 3.552 | -0.769 |
| 3.553 | -0.767 |
| 3.554 | -0.765 |
| 3.555 | -0.764 |
| 3.556 | -0.762 |
| 3.557 | -0.761 |
| 3.558 | -0.759 |
| 3.559 | -0.757 |
| 3.56 | -0.756 |
| 3.561 | -0.754 |
| 3.562 | -0.753 |
| 3.563 | -0.751 |
| 3.564 | -0.749 |
| 3.565 | -0.748 |
| 3.566 | -0.746 |
| 3.567 | -0.745 |
| 3.568 | -0.743 |
| 3.569 | -0.741 |
| 3.57 | -0.74 |
| 3.571 | -0.738 |
| 3.572 | -0.737 |
| 3.573 | -0.735 |
| 3.574 | -0.733 |
| 3.575 | -0.732 |
| 3.576 | -0.73 |
| 3.577 | -0.729 |
| 3.578 | -0.727 |
| 3.579 | -0.725 |
| 3.58 | -0.724 |
| 3.581 | -0.722 |
| 3.582 | -0.721 |
| 3.583 | -0.719 |
| 3.584 | -0.717 |
| 3.585 | -0.716 |
| 3.586 | -0.714 |
| 3.587 | -0.712 |
| 3.588 | -0.711 |
| 3.589 | -0.709 |
| 3.59 | -0.708 |
| 3.591 | -0.706 |
| 3.592 | -0.704 |
| 3.593 | -0.703 |
| 3.594 | -0.701 |
| 3.595 | -0.7 |
| 3.596 | -0.698 |
| 3.597 | -0.696 |
| 3.598 | -0.695 |
| 3.599 | -0.693 |
| 3.6 | -0.691 |
| 3.601 | -0.69 |
| 3.602 | -0.688 |
| 3.603 | -0.687 |
| 3.604 | -0.685 |
| 3.605 | -0.683 |
| 3.606 | -0.682 |
| 3.607 | -0.68 |
| 3.608 | -0.679 |
| 3.609 | -0.677 |
| 3.61 | -0.675 |
| 3.611 | -0.674 |
| 3.612 | -0.672 |
| 3.613 | -0.67 |
| 3.614 | -0.669 |
| 3.615 | -0.667 |
| 3.616 | -0.666 |
| 3.617 | -0.664 |
| 3.618 | -0.662 |
| 3.619 | -0.661 |
| 3.62 | -0.659 |
| 3.621 | -0.657 |
| 3.622 | -0.656 |
| 3.623 | -0.654 |
| 3.624 | -0.652 |
| 3.625 | -0.651 |
| 3.626 | -0.649 |
| 3.627 | -0.648 |
| 3.628 | -0.646 |
| 3.629 | -0.644 |
| 3.63 | -0.643 |
| 3.631 | -0.641 |
| 3.632 | -0.639 |
| 3.633 | -0.638 |
| 3.634 | -0.636 |
| 3.635 | -0.634 |
| 3.636 | -0.633 |
| 3.637 | -0.631 |
| 3.638 | -0.63 |
| 3.639 | -0.628 |
| 3.64 | -0.626 |
| 3.641 | -0.625 |
| 3.642 | -0.623 |
| 3.643 | -0.621 |
| 3.644 | -0.62 |
| 3.645 | -0.618 |
| 3.646 | -0.616 |
| 3.647 | -0.615 |
| 3.648 | -0.613 |
| 3.649 | -0.611 |
| 3.65 | -0.61 |
| 3.651 | -0.608 |
| 3.652 | -0.607 |
| 3.653 | -0.605 |
| 3.654 | -0.603 |
| 3.655 | -0.602 |
| 3.656 | -0.6 |
| 3.657 | -0.598 |
| 3.658 | -0.597 |
| 3.659 | -0.595 |
| 3.66 | -0.593 |
| 3.661 | -0.592 |
| 3.662 | -0.59 |
| 3.663 | -0.588 |
| 3.664 | -0.587 |
| 3.665 | -0.585 |
| 3.666 | -0.583 |
| 3.667 | -0.582 |
| 3.668 | -0.58 |
| 3.669 | -0.578 |
| 3.67 | -0.577 |
| 3.671 | -0.575 |
| 3.672 | -0.573 |
| 3.673 | -0.572 |
| 3.674 | -0.57 |
| 3.675 | -0.569 |
| 3.676 | -0.567 |
| 3.677 | -0.565 |
| 3.678 | -0.564 |
| 3.679 | -0.562 |
| 3.68 | -0.56 |
| 3.681 | -0.559 |
| 3.682 | -0.557 |
| 3.683 | -0.555 |
| 3.684 | -0.554 |
| 3.685 | -0.552 |
| 3.686 | -0.55 |
| 3.687 | -0.549 |
| 3.688 | -0.547 |
| 3.689 | -0.545 |
| 3.69 | -0.544 |
| 3.691 | -0.542 |
| 3.692 | -0.54 |
| 3.693 | -0.539 |
| 3.694 | -0.537 |
| 3.695 | -0.535 |
| 3.696 | -0.534 |
| 3.697 | -0.532 |
| 3.698 | -0.53 |
| 3.699 | -0.529 |
| 3.7 | -0.527 |
| 3.701 | -0.525 |
| 3.702 | -0.524 |
| 3.703 | -0.522 |
| 3.704 | -0.52 |
| 3.705 | -0.518 |
| 3.706 | -0.517 |
| 3.707 | -0.515 |
| 3.708 | -0.513 |
| 3.709 | -0.512 |
| 3.71 | -0.51 |
| 3.711 | -0.508 |
| 3.712 | -0.507 |
| 3.713 | -0.505 |
| 3.714 | -0.503 |
| 3.715 | -0.502 |
| 3.716 | -0.5 |
| 3.717 | -0.498 |
| 3.718 | -0.497 |
| 3.719 | -0.495 |
| 3.72 | -0.493 |
| 3.721 | -0.492 |
| 3.722 | -0.49 |
| 3.723 | -0.488 |
| 3.724 | -0.487 |
| 3.725 | -0.485 |
| 3.726 | -0.483 |
| 3.727 | -0.482 |
| 3.728 | -0.48 |
| 3.729 | -0.478 |
| 3.73 | -0.476 |
| 3.731 | -0.475 |
| 3.732 | -0.473 |
| 3.733 | -0.471 |
| 3.734 | -0.47 |
| 3.735 | -0.468 |
| 3.736 | -0.466 |
| 3.737 | -0.465 |
| 3.738 | -0.463 |
| 3.739 | -0.461 |
| 3.74 | -0.46 |
| 3.741 | -0.458 |
| 3.742 | -0.456 |
| 3.743 | -0.454 |
| 3.744 | -0.453 |
| 3.745 | -0.451 |
| 3.746 | -0.449 |
| 3.747 | -0.448 |
| 3.748 | -0.446 |
| 3.749 | -0.444 |
| 3.75 | -0.443 |
| 3.751 | -0.441 |
| 3.752 | -0.439 |
| 3.753 | -0.437 |
| 3.754 | -0.436 |
| 3.755 | -0.434 |
| 3.756 | -0.432 |
| 3.757 | -0.431 |
| 3.758 | -0.429 |
| 3.759 | -0.427 |
| 3.76 | -0.426 |
| 3.761 | -0.424 |
| 3.762 | -0.422 |
| 3.763 | -0.42 |
| 3.764 | -0.419 |
| 3.765 | -0.417 |
| 3.766 | -0.415 |
| 3.767 | -0.414 |
| 3.768 | -0.412 |
| 3.769 | -0.41 |
| 3.77 | -0.408 |
| 3.771 | -0.407 |
| 3.772 | -0.405 |
| 3.773 | -0.403 |
| 3.774 | -0.402 |
| 3.775 | -0.4 |
| 3.776 | -0.398 |
| 3.777 | -0.396 |
| 3.778 | -0.395 |
| 3.779 | -0.393 |
| 3.78 | -0.391 |
| 3.781 | -0.39 |
| 3.782 | -0.388 |
| 3.783 | -0.386 |
| 3.784 | -0.384 |
| 3.785 | -0.383 |
| 3.786 | -0.381 |
| 3.787 | -0.379 |
| 3.788 | -0.378 |
| 3.789 | -0.376 |
| 3.79 | -0.374 |
| 3.791 | -0.372 |
| 3.792 | -0.371 |
| 3.793 | -0.369 |
| 3.794 | -0.367 |
| 3.795 | -0.366 |
| 3.796 | -0.364 |
| 3.797 | -0.362 |
| 3.798 | -0.36 |
| 3.799 | -0.359 |
| 3.8 | -0.357 |
| 3.801 | -0.355 |
| 3.802 | -0.353 |
| 3.803 | -0.352 |
| 3.804 | -0.35 |
| 3.805 | -0.348 |
| 3.806 | -0.347 |
| 3.807 | -0.345 |
| 3.808 | -0.343 |
| 3.809 | -0.341 |
| 3.81 | -0.34 |
| 3.811 | -0.338 |
| 3.812 | -0.336 |
| 3.813 | -0.334 |
| 3.814 | -0.333 |
| 3.815 | -0.331 |
| 3.816 | -0.329 |
| 3.817 | -0.327 |
| 3.818 | -0.326 |
| 3.819 | -0.324 |
| 3.82 | -0.322 |
| 3.821 | -0.321 |
| 3.822 | -0.319 |
| 3.823 | -0.317 |
| 3.824 | -0.315 |
| 3.825 | -0.314 |
| 3.826 | -0.312 |
| 3.827 | -0.31 |
| 3.828 | -0.308 |
| 3.829 | -0.307 |
| 3.83 | -0.305 |
| 3.831 | -0.303 |
| 3.832 | -0.301 |
| 3.833 | -0.3 |
| 3.834 | -0.298 |
| 3.835 | -0.296 |
| 3.836 | -0.294 |
| 3.837 | -0.293 |
| 3.838 | -0.291 |
| 3.839 | -0.289 |
| 3.84 | -0.287 |
| 3.841 | -0.286 |
| 3.842 | -0.284 |
| 3.843 | -0.282 |
| 3.844 | -0.28 |
| 3.845 | -0.279 |
| 3.846 | -0.277 |
| 3.847 | -0.275 |
| 3.848 | -0.273 |
| 3.849 | -0.272 |
| 3.85 | -0.27 |
| 3.851 | -0.268 |
| 3.852 | -0.266 |
| 3.853 | -0.265 |
| 3.854 | -0.263 |
| 3.855 | -0.261 |
| 3.856 | -0.259 |
| 3.857 | -0.258 |
| 3.858 | -0.256 |
| 3.859 | -0.254 |
| 3.86 | -0.252 |
| 3.861 | -0.251 |
| 3.862 | -0.249 |
| 3.863 | -0.247 |
| 3.864 | -0.245 |
| 3.865 | -0.244 |
| 3.866 | -0.242 |
| 3.867 | -0.24 |
| 3.868 | -0.238 |
| 3.869 | -0.236 |
| 3.87 | -0.235 |
| 3.871 | -0.233 |
| 3.872 | -0.231 |
| 3.873 | -0.229 |
| 3.874 | -0.228 |
| 3.875 | -0.226 |
| 3.876 | -0.224 |
| 3.877 | -0.222 |
| 3.878 | -0.221 |
| 3.879 | -0.219 |
| 3.88 | -0.217 |
| 3.881 | -0.215 |
| 3.882 | -0.213 |
| 3.883 | -0.212 |
| 3.884 | -0.21 |
| 3.885 | -0.208 |
| 3.886 | -0.206 |
| 3.887 | -0.205 |
| 3.888 | -0.203 |
| 3.889 | -0.201 |
| 3.89 | -0.199 |
| 3.891 | -0.197 |
| 3.892 | -0.196 |
| 3.893 | -0.194 |
| 3.894 | -0.192 |
| 3.895 | -0.19 |
| 3.896 | -0.189 |
| 3.897 | -0.187 |
| 3.898 | -0.185 |
| 3.899 | -0.183 |
| 3.9 | -0.181 |
| 3.901 | -0.18 |
| 3.902 | -0.178 |
| 3.903 | -0.176 |
| 3.904 | -0.174 |
| 3.905 | -0.173 |
| 3.906 | -0.171 |
| 3.907 | -0.169 |
| 3.908 | -0.167 |
| 3.909 | -0.165 |
| 3.91 | -0.164 |
| 3.911 | -0.162 |
| 3.912 | -0.16 |
| 3.913 | -0.158 |
| 3.914 | -0.156 |
| 3.915 | -0.155 |
| 3.916 | -0.153 |
| 3.917 | -0.151 |
| 3.918 | -0.149 |
| 3.919 | -0.148 |
| 3.92 | -0.146 |
| 3.921 | -0.144 |
| 3.922 | -0.142 |
| 3.923 | -0.14 |
| 3.924 | -0.139 |
| 3.925 | -0.137 |
| 3.926 | -0.135 |
| 3.927 | -0.133 |
| 3.928 | -0.131 |
| 3.929 | -0.13 |
| 3.93 | -0.128 |
| 3.931 | -0.126 |
| 3.932 | -0.124 |
| 3.933 | -0.122 |
| 3.934 | -0.121 |
| 3.935 | -0.119 |
| 3.936 | -0.117 |
| 3.937 | -0.115 |
| 3.938 | -0.113 |
| 3.939 | -0.112 |
| 3.94 | -0.11 |
| 3.941 | -0.108 |
| 3.942 | -0.106 |
| 3.943 | -0.104 |
| 3.944 | -0.103 |
| 3.945 | -0.101 |
| 3.946 | -0.099 |
| 3.947 | -0.097 |
| 3.948 | -0.095 |
| 3.949 | -0.093 |
| 3.95 | -0.092 |
| 3.951 | -0.09 |
| 3.952 | -0.088 |
| 3.953 | -0.086 |
| 3.954 | -0.084 |
| 3.955 | -0.083 |
| 3.956 | -0.081 |
| 3.957 | -0.079 |
| 3.958 | -0.077 |
| 3.959 | -0.075 |
| 3.96 | -0.074 |
| 3.961 | -0.072 |
| 3.962 | -0.07 |
| 3.963 | -0.068 |
| 3.964 | -0.066 |
| 3.965 | -0.064 |
| 3.966 | -0.063 |
| 3.967 | -0.061 |
| 3.968 | -0.059 |
| 3.969 | -0.057 |
| 3.97 | -0.055 |
| 3.971 | -0.054 |
| 3.972 | -0.052 |
| 3.973 | -0.05 |
| 3.974 | -0.048 |
| 3.975 | -0.046 |
| 3.976 | -0.044 |
| 3.977 | -0.043 |
| 3.978 | -0.041 |
| 3.979 | -0.039 |
| 3.98 | -0.037 |
| 3.981 | -0.035 |
| 3.982 | -0.033 |
| 3.983 | -0.032 |
| 3.984 | -0.03 |
| 3.985 | -0.028 |
| 3.986 | -0.026 |
| 3.987 | -0.024 |
| 3.988 | -0.022 |
| 3.989 | -0.021 |
| 3.99 | -0.019 |
| 3.991 | -0.017 |
| 3.992 | -0.015 |
| 3.993 | -0.013 |
| 3.994 | -0.012 |
| 3.995 | -0.01 |
| 3.996 | -0.008 |
| 3.997 | -0.006 |
| 3.998 | -0.004 |
| 3.999 | -0.002 |
| 4.0 | 0 |
| 4.001 | 0.001 |
| 4.002 | 0.003 |
| 4.003 | 0.005 |
| 4.004 | 0.007 |
| 4.005 | 0.009 |
| 4.006 | 0.011 |
| 4.007 | 0.012 |
| 4.008 | 0.014 |
| 4.009 | 0.016 |
| 4.01 | 0.018 |
| 4.011 | 0.02 |
| 4.012 | 0.022 |
| 4.013 | 0.023 |
| 4.014 | 0.025 |
| 4.015 | 0.027 |
| 4.016 | 0.029 |
| 4.017 | 0.031 |
| 4.018 | 0.033 |
| 4.019 | 0.035 |
| 4.02 | 0.036 |
| 4.021 | 0.038 |
| 4.022 | 0.04 |
| 4.023 | 0.042 |
| 4.024 | 0.044 |
| 4.025 | 0.046 |
| 4.026 | 0.048 |
| 4.027 | 0.049 |
| 4.028 | 0.051 |
| 4.029 | 0.053 |
| 4.03 | 0.055 |
| 4.031 | 0.057 |
| 4.032 | 0.059 |
| 4.033 | 0.06 |
| 4.034 | 0.062 |
| 4.035 | 0.064 |
| 4.036 | 0.066 |
| 4.037 | 0.068 |
| 4.038 | 0.07 |
| 4.039 | 0.072 |
| 4.04 | 0.074 |
| 4.041 | 0.075 |
| 4.042 | 0.077 |
| 4.043 | 0.079 |
| 4.044 | 0.081 |
| 4.045 | 0.083 |
| 4.046 | 0.085 |
| 4.047 | 0.087 |
| 4.048 | 0.088 |
| 4.049 | 0.09 |
| 4.05 | 0.092 |
| 4.051 | 0.094 |
| 4.052 | 0.096 |
| 4.053 | 0.098 |
| 4.054 | 0.1 |
| 4.055 | 0.101 |
| 4.056 | 0.103 |
| 4.057 | 0.105 |
| 4.058 | 0.107 |
| 4.059 | 0.109 |
| 4.06 | 0.111 |
| 4.061 | 0.113 |
| 4.062 | 0.115 |
| 4.063 | 0.116 |
| 4.064 | 0.118 |
| 4.065 | 0.12 |
| 4.066 | 0.122 |
| 4.067 | 0.124 |
| 4.068 | 0.126 |
| 4.069 | 0.128 |
| 4.07 | 0.13 |
| 4.071 | 0.131 |
| 4.072 | 0.133 |
| 4.073 | 0.135 |
| 4.074 | 0.137 |
| 4.075 | 0.139 |
| 4.076 | 0.141 |
| 4.077 | 0.143 |
| 4.078 | 0.145 |
| 4.079 | 0.147 |
| 4.08 | 0.148 |
| 4.081 | 0.15 |
| 4.082 | 0.152 |
| 4.083 | 0.154 |
| 4.084 | 0.156 |
| 4.085 | 0.158 |
| 4.086 | 0.16 |
| 4.087 | 0.162 |
| 4.088 | 0.163 |
| 4.089 | 0.165 |
| 4.09 | 0.167 |
| 4.091 | 0.169 |
| 4.092 | 0.171 |
| 4.093 | 0.173 |
| 4.094 | 0.175 |
| 4.095 | 0.177 |
| 4.096 | 0.179 |
| 4.097 | 0.181 |
| 4.098 | 0.182 |
| 4.099 | 0.184 |
| 4.1 | 0.186 |
| 4.101 | 0.188 |
| 4.102 | 0.19 |
| 4.103 | 0.192 |
| 4.104 | 0.194 |
| 4.105 | 0.196 |
| 4.106 | 0.198 |
| 4.107 | 0.199 |
| 4.108 | 0.201 |
| 4.109 | 0.203 |
| 4.11 | 0.205 |
| 4.111 | 0.207 |
| 4.112 | 0.209 |
| 4.113 | 0.211 |
| 4.114 | 0.213 |
| 4.115 | 0.215 |
| 4.116 | 0.217 |
| 4.117 | 0.218 |
| 4.118 | 0.22 |
| 4.119 | 0.222 |
| 4.12 | 0.224 |
| 4.121 | 0.226 |
| 4.122 | 0.228 |
| 4.123 | 0.23 |
| 4.124 | 0.232 |
| 4.125 | 0.234 |
| 4.126 | 0.236 |
| 4.127 | 0.238 |
| 4.128 | 0.239 |
| 4.129 | 0.241 |
| 4.13 | 0.243 |
| 4.131 | 0.245 |
| 4.132 | 0.247 |
| 4.133 | 0.249 |
| 4.134 | 0.251 |
| 4.135 | 0.253 |
| 4.136 | 0.255 |
| 4.137 | 0.257 |
| 4.138 | 0.259 |
| 4.139 | 0.261 |
| 4.14 | 0.262 |
| 4.141 | 0.264 |
| 4.142 | 0.266 |
| 4.143 | 0.268 |
| 4.144 | 0.27 |
| 4.145 | 0.272 |
| 4.146 | 0.274 |
| 4.147 | 0.276 |
| 4.148 | 0.278 |
| 4.149 | 0.28 |
| 4.15 | 0.282 |
| 4.151 | 0.284 |
| 4.152 | 0.286 |
| 4.153 | 0.287 |
| 4.154 | 0.289 |
| 4.155 | 0.291 |
| 4.156 | 0.293 |
| 4.157 | 0.295 |
| 4.158 | 0.297 |
| 4.159 | 0.299 |
| 4.16 | 0.301 |
| 4.161 | 0.303 |
| 4.162 | 0.305 |
| 4.163 | 0.307 |
| 4.164 | 0.309 |
| 4.165 | 0.311 |
| 4.166 | 0.313 |
| 4.167 | 0.314 |
| 4.168 | 0.316 |
| 4.169 | 0.318 |
| 4.17 | 0.32 |
| 4.171 | 0.322 |
| 4.172 | 0.324 |
| 4.173 | 0.326 |
| 4.174 | 0.328 |
| 4.175 | 0.33 |
| 4.176 | 0.332 |
| 4.177 | 0.334 |
| 4.178 | 0.336 |
| 4.179 | 0.338 |
| 4.18 | 0.34 |
| 4.181 | 0.342 |
| 4.182 | 0.344 |
| 4.183 | 0.346 |
| 4.184 | 0.347 |
| 4.185 | 0.349 |
| 4.186 | 0.351 |
| 4.187 | 0.353 |
| 4.188 | 0.355 |
| 4.189 | 0.357 |
| 4.19 | 0.359 |
| 4.191 | 0.361 |
| 4.192 | 0.363 |
| 4.193 | 0.365 |
| 4.194 | 0.367 |
| 4.195 | 0.369 |
| 4.196 | 0.371 |
| 4.197 | 0.373 |
| 4.198 | 0.375 |
| 4.199 | 0.377 |
| 4.2 | 0.379 |
| 4.201 | 0.381 |
| 4.202 | 0.383 |
| 4.203 | 0.385 |
| 4.204 | 0.386 |
| 4.205 | 0.388 |
| 4.206 | 0.39 |
| 4.207 | 0.392 |
| 4.208 | 0.394 |
| 4.209 | 0.396 |
| 4.21 | 0.398 |
| 4.211 | 0.4 |
| 4.212 | 0.402 |
| 4.213 | 0.404 |
| 4.214 | 0.406 |
| 4.215 | 0.408 |
| 4.216 | 0.41 |
| 4.217 | 0.412 |
| 4.218 | 0.414 |
| 4.219 | 0.416 |
| 4.22 | 0.418 |
| 4.221 | 0.42 |
| 4.222 | 0.422 |
| 4.223 | 0.424 |
| 4.224 | 0.426 |
| 4.225 | 0.428 |
| 4.226 | 0.43 |
| 4.227 | 0.432 |
| 4.228 | 0.434 |
| 4.229 | 0.436 |
| 4.23 | 0.438 |
| 4.231 | 0.44 |
| 4.232 | 0.441 |
| 4.233 | 0.443 |
| 4.234 | 0.445 |
| 4.235 | 0.447 |
| 4.236 | 0.449 |
| 4.237 | 0.451 |
| 4.238 | 0.453 |
| 4.239 | 0.455 |
| 4.24 | 0.457 |
| 4.241 | 0.459 |
| 4.242 | 0.461 |
| 4.243 | 0.463 |
| 4.244 | 0.465 |
| 4.245 | 0.467 |
| 4.246 | 0.469 |
| 4.247 | 0.471 |
| 4.248 | 0.473 |
| 4.249 | 0.475 |
| 4.25 | 0.477 |
| 4.251 | 0.479 |
| 4.252 | 0.481 |
| 4.253 | 0.483 |
| 4.254 | 0.485 |
| 4.255 | 0.487 |
| 4.256 | 0.489 |
| 4.257 | 0.491 |
| 4.258 | 0.493 |
| 4.259 | 0.495 |
| 4.26 | 0.497 |
| 4.261 | 0.499 |
| 4.262 | 0.501 |
| 4.263 | 0.503 |
| 4.264 | 0.505 |
| 4.265 | 0.507 |
| 4.266 | 0.509 |
| 4.267 | 0.511 |
| 4.268 | 0.513 |
| 4.269 | 0.515 |
| 4.27 | 0.517 |
| 4.271 | 0.519 |
| 4.272 | 0.521 |
| 4.273 | 0.523 |
| 4.274 | 0.525 |
| 4.275 | 0.527 |
| 4.276 | 0.529 |
| 4.277 | 0.531 |
| 4.278 | 0.533 |
| 4.279 | 0.535 |
| 4.28 | 0.537 |
| 4.281 | 0.539 |
| 4.282 | 0.541 |
| 4.283 | 0.543 |
| 4.284 | 0.545 |
| 4.285 | 0.547 |
| 4.286 | 0.549 |
| 4.287 | 0.551 |
| 4.288 | 0.553 |
| 4.289 | 0.555 |
| 4.29 | 0.557 |
| 4.291 | 0.559 |
| 4.292 | 0.561 |
| 4.293 | 0.563 |
| 4.294 | 0.565 |
| 4.295 | 0.567 |
| 4.296 | 0.569 |
| 4.297 | 0.571 |
| 4.298 | 0.573 |
| 4.299 | 0.575 |
| 4.3 | 0.577 |
| 4.301 | 0.579 |
| 4.302 | 0.581 |
| 4.303 | 0.583 |
| 4.304 | 0.585 |
| 4.305 | 0.587 |
| 4.306 | 0.589 |
| 4.307 | 0.591 |
| 4.308 | 0.593 |
| 4.309 | 0.595 |
| 4.31 | 0.597 |
| 4.311 | 0.599 |
| 4.312 | 0.601 |
| 4.313 | 0.603 |
| 4.314 | 0.605 |
| 4.315 | 0.607 |
| 4.316 | 0.609 |
| 4.317 | 0.611 |
| 4.318 | 0.613 |
| 4.319 | 0.615 |
| 4.32 | 0.617 |
| 4.321 | 0.619 |
| 4.322 | 0.621 |
| 4.323 | 0.623 |
| 4.324 | 0.626 |
| 4.325 | 0.628 |
| 4.326 | 0.63 |
| 4.327 | 0.632 |
| 4.328 | 0.634 |
| 4.329 | 0.636 |
| 4.33 | 0.638 |
| 4.331 | 0.64 |
| 4.332 | 0.642 |
| 4.333 | 0.644 |
| 4.334 | 0.646 |
| 4.335 | 0.648 |
| 4.336 | 0.65 |
| 4.337 | 0.652 |
| 4.338 | 0.654 |
| 4.339 | 0.656 |
| 4.34 | 0.658 |
| 4.341 | 0.66 |
| 4.342 | 0.662 |
| 4.343 | 0.664 |
| 4.344 | 0.666 |
| 4.345 | 0.668 |
| 4.346 | 0.67 |
| 4.347 | 0.672 |
| 4.348 | 0.674 |
| 4.349 | 0.676 |
| 4.35 | 0.678 |
| 4.351 | 0.68 |
| 4.352 | 0.683 |
| 4.353 | 0.685 |
| 4.354 | 0.687 |
| 4.355 | 0.689 |
| 4.356 | 0.691 |
| 4.357 | 0.693 |
| 4.358 | 0.695 |
| 4.359 | 0.697 |
| 4.36 | 0.699 |
| 4.361 | 0.701 |
| 4.362 | 0.703 |
| 4.363 | 0.705 |
| 4.364 | 0.707 |
| 4.365 | 0.709 |
| 4.366 | 0.711 |
| 4.367 | 0.713 |
| 4.368 | 0.715 |
| 4.369 | 0.717 |
| 4.37 | 0.719 |
| 4.371 | 0.721 |
| 4.372 | 0.724 |
| 4.373 | 0.726 |
| 4.374 | 0.728 |
| 4.375 | 0.73 |
| 4.376 | 0.732 |
| 4.377 | 0.734 |
| 4.378 | 0.736 |
| 4.379 | 0.738 |
| 4.38 | 0.74 |
| 4.381 | 0.742 |
| 4.382 | 0.744 |
| 4.383 | 0.746 |
| 4.384 | 0.748 |
| 4.385 | 0.75 |
| 4.386 | 0.752 |
| 4.387 | 0.754 |
| 4.388 | 0.757 |
| 4.389 | 0.759 |
| 4.39 | 0.761 |
| 4.391 | 0.763 |
| 4.392 | 0.765 |
| 4.393 | 0.767 |
| 4.394 | 0.769 |
| 4.395 | 0.771 |
| 4.396 | 0.773 |
| 4.397 | 0.775 |
| 4.398 | 0.777 |
| 4.399 | 0.779 |
| 4.4 | 0.781 |
| 4.401 | 0.783 |
| 4.402 | 0.786 |
| 4.403 | 0.788 |
| 4.404 | 0.79 |
| 4.405 | 0.792 |
| 4.406 | 0.794 |
| 4.407 | 0.796 |
| 4.408 | 0.798 |
| 4.409 | 0.8 |
| 4.41 | 0.802 |
| 4.411 | 0.804 |
| 4.412 | 0.806 |
| 4.413 | 0.808 |
| 4.414 | 0.81 |
| 4.415 | 0.813 |
| 4.416 | 0.815 |
| 4.417 | 0.817 |
| 4.418 | 0.819 |
| 4.419 | 0.821 |
| 4.42 | 0.823 |
| 4.421 | 0.825 |
| 4.422 | 0.827 |
| 4.423 | 0.829 |
| 4.424 | 0.831 |
| 4.425 | 0.833 |
| 4.426 | 0.836 |
| 4.427 | 0.838 |
| 4.428 | 0.84 |
| 4.429 | 0.842 |
| 4.43 | 0.844 |
| 4.431 | 0.846 |
| 4.432 | 0.848 |
| 4.433 | 0.85 |
| 4.434 | 0.852 |
| 4.435 | 0.854 |
| 4.436 | 0.856 |
| 4.437 | 0.859 |
| 4.438 | 0.861 |
| 4.439 | 0.863 |
| 4.44 | 0.865 |
| 4.441 | 0.867 |
| 4.442 | 0.869 |
| 4.443 | 0.871 |
| 4.444 | 0.873 |
| 4.445 | 0.875 |
| 4.446 | 0.877 |
| 4.447 | 0.88 |
| 4.448 | 0.882 |
| 4.449 | 0.884 |
| 4.45 | 0.886 |
| 4.451 | 0.888 |
| 4.452 | 0.89 |
| 4.453 | 0.892 |
| 4.454 | 0.894 |
| 4.455 | 0.896 |
| 4.456 | 0.899 |
| 4.457 | 0.901 |
| 4.458 | 0.903 |
| 4.459 | 0.905 |
| 4.46 | 0.907 |
| 4.461 | 0.909 |
| 4.462 | 0.911 |
| 4.463 | 0.913 |
| 4.464 | 0.915 |
| 4.465 | 0.918 |
| 4.466 | 0.92 |
| 4.467 | 0.922 |
| 4.468 | 0.924 |
| 4.469 | 0.926 |
| 4.47 | 0.928 |
| 4.471 | 0.93 |
| 4.472 | 0.932 |
| 4.473 | 0.934 |
| 4.474 | 0.937 |
| 4.475 | 0.939 |
| 4.476 | 0.941 |
| 4.477 | 0.943 |
| 4.478 | 0.945 |
| 4.479 | 0.947 |
| 4.48 | 0.949 |
| 4.481 | 0.951 |
| 4.482 | 0.954 |
| 4.483 | 0.956 |
| 4.484 | 0.958 |
| 4.485 | 0.96 |
| 4.486 | 0.962 |
| 4.487 | 0.964 |
| 4.488 | 0.966 |
| 4.489 | 0.968 |
| 4.49 | 0.971 |
| 4.491 | 0.973 |
| 4.492 | 0.975 |
| 4.493 | 0.977 |
| 4.494 | 0.979 |
| 4.495 | 0.981 |
| 4.496 | 0.983 |
| 4.497 | 0.986 |
| 4.498 | 0.988 |
| 4.499 | 0.99 |
| 4.5 | 0.992 |
| 4.501 | 0.994 |
| 4.502 | 0.996 |
| 4.503 | 0.998 |
| 4.504 | 1 |
| 4.505 | 1.003 |
| 4.506 | 1.005 |
| 4.507 | 1.007 |
| 4.508 | 1.009 |
| 4.509 | 1.011 |
| 4.51 | 1.013 |
| 4.511 | 1.015 |
| 4.512 | 1.018 |
| 4.513 | 1.02 |
| 4.514 | 1.022 |
| 4.515 | 1.024 |
| 4.516 | 1.026 |
| 4.517 | 1.028 |
| 4.518 | 1.03 |
| 4.519 | 1.033 |
| 4.52 | 1.035 |
| 4.521 | 1.037 |
| 4.522 | 1.039 |
| 4.523 | 1.041 |
| 4.524 | 1.043 |
| 4.525 | 1.046 |
| 4.526 | 1.048 |
| 4.527 | 1.05 |
| 4.528 | 1.052 |
| 4.529 | 1.054 |
| 4.53 | 1.056 |
| 4.531 | 1.058 |
| 4.532 | 1.061 |
| 4.533 | 1.063 |
| 4.534 | 1.065 |
| 4.535 | 1.067 |
| 4.536 | 1.069 |
| 4.537 | 1.071 |
| 4.538 | 1.074 |
| 4.539 | 1.076 |
| 4.54 | 1.078 |
| 4.541 | 1.08 |
| 4.542 | 1.082 |
| 4.543 | 1.084 |
| 4.544 | 1.087 |
| 4.545 | 1.089 |
| 4.546 | 1.091 |
| 4.547 | 1.093 |
| 4.548 | 1.095 |
| 4.549 | 1.097 |
| 4.55 | 1.1 |
| 4.551 | 1.102 |
| 4.552 | 1.104 |
| 4.553 | 1.106 |
| 4.554 | 1.108 |
| 4.555 | 1.11 |
| 4.556 | 1.113 |
| 4.557 | 1.115 |
| 4.558 | 1.117 |
| 4.559 | 1.119 |
| 4.56 | 1.121 |
| 4.561 | 1.123 |
| 4.562 | 1.126 |
| 4.563 | 1.128 |
| 4.564 | 1.13 |
| 4.565 | 1.132 |
| 4.566 | 1.134 |
| 4.567 | 1.136 |
| 4.568 | 1.139 |
| 4.569 | 1.141 |
| 4.57 | 1.143 |
| 4.571 | 1.145 |
| 4.572 | 1.147 |
| 4.573 | 1.15 |
| 4.574 | 1.152 |
| 4.575 | 1.154 |
| 4.576 | 1.156 |
| 4.577 | 1.158 |
| 4.578 | 1.16 |
| 4.579 | 1.163 |
| 4.58 | 1.165 |
| 4.581 | 1.167 |
| 4.582 | 1.169 |
| 4.583 | 1.171 |
| 4.584 | 1.174 |
| 4.585 | 1.176 |
| 4.586 | 1.178 |
| 4.587 | 1.18 |
| 4.588 | 1.182 |
| 4.589 | 1.185 |
| 4.59 | 1.187 |
| 4.591 | 1.189 |
| 4.592 | 1.191 |
| 4.593 | 1.193 |
| 4.594 | 1.196 |
| 4.595 | 1.198 |
| 4.596 | 1.2 |
| 4.597 | 1.202 |
| 4.598 | 1.204 |
| 4.599 | 1.207 |
| 4.6 | 1.209 |
| 4.601 | 1.211 |
| 4.602 | 1.213 |
| 4.603 | 1.215 |
| 4.604 | 1.218 |
| 4.605 | 1.22 |
| 4.606 | 1.222 |
| 4.607 | 1.224 |
| 4.608 | 1.226 |
| 4.609 | 1.229 |
| 4.61 | 1.231 |
| 4.611 | 1.233 |
| 4.612 | 1.235 |
| 4.613 | 1.237 |
| 4.614 | 1.24 |
| 4.615 | 1.242 |
| 4.616 | 1.244 |
| 4.617 | 1.246 |
| 4.618 | 1.248 |
| 4.619 | 1.251 |
| 4.62 | 1.253 |
| 4.621 | 1.255 |
| 4.622 | 1.257 |
| 4.623 | 1.26 |
| 4.624 | 1.262 |
| 4.625 | 1.264 |
| 4.626 | 1.266 |
| 4.627 | 1.268 |
| 4.628 | 1.271 |
| 4.629 | 1.273 |
| 4.63 | 1.275 |
| 4.631 | 1.277 |
| 4.632 | 1.279 |
| 4.633 | 1.282 |
| 4.634 | 1.284 |
| 4.635 | 1.286 |
| 4.636 | 1.288 |
| 4.637 | 1.291 |
| 4.638 | 1.293 |
| 4.639 | 1.295 |
| 4.64 | 1.297 |
| 4.641 | 1.299 |
| 4.642 | 1.302 |
| 4.643 | 1.304 |
| 4.644 | 1.306 |
| 4.645 | 1.308 |
| 4.646 | 1.311 |
| 4.647 | 1.313 |
| 4.648 | 1.315 |
| 4.649 | 1.317 |
| 4.65 | 1.32 |
| 4.651 | 1.322 |
| 4.652 | 1.324 |
| 4.653 | 1.326 |
| 4.654 | 1.328 |
| 4.655 | 1.331 |
| 4.656 | 1.333 |
| 4.657 | 1.335 |
| 4.658 | 1.337 |
| 4.659 | 1.34 |
| 4.66 | 1.342 |
| 4.661 | 1.344 |
| 4.662 | 1.346 |
| 4.663 | 1.349 |
| 4.664 | 1.351 |
| 4.665 | 1.353 |
| 4.666 | 1.355 |
| 4.667 | 1.358 |
| 4.668 | 1.36 |
| 4.669 | 1.362 |
| 4.67 | 1.364 |
| 4.671 | 1.367 |
| 4.672 | 1.369 |
| 4.673 | 1.371 |
| 4.674 | 1.373 |
| 4.675 | 1.376 |
| 4.676 | 1.378 |
| 4.677 | 1.38 |
| 4.678 | 1.382 |
| 4.679 | 1.385 |
| 4.68 | 1.387 |
| 4.681 | 1.389 |
| 4.682 | 1.391 |
| 4.683 | 1.394 |
| 4.684 | 1.396 |
| 4.685 | 1.398 |
| 4.686 | 1.4 |
| 4.687 | 1.403 |
| 4.688 | 1.405 |
| 4.689 | 1.407 |
| 4.69 | 1.409 |
| 4.691 | 1.412 |
| 4.692 | 1.414 |
| 4.693 | 1.416 |
| 4.694 | 1.418 |
| 4.695 | 1.421 |
| 4.696 | 1.423 |
| 4.697 | 1.425 |
| 4.698 | 1.427 |
| 4.699 | 1.43 |
| 4.7 | 1.432 |
| 4.701 | 1.434 |
| 4.702 | 1.436 |
| 4.703 | 1.439 |
| 4.704 | 1.441 |
| 4.705 | 1.443 |
| 4.706 | 1.446 |
| 4.707 | 1.448 |
| 4.708 | 1.45 |
| 4.709 | 1.452 |
| 4.71 | 1.455 |
| 4.711 | 1.457 |
| 4.712 | 1.459 |
| 4.713 | 1.461 |
| 4.714 | 1.464 |
| 4.715 | 1.466 |
| 4.716 | 1.468 |
| 4.717 | 1.471 |
| 4.718 | 1.473 |
| 4.719 | 1.475 |
| 4.72 | 1.477 |
| 4.721 | 1.48 |
| 4.722 | 1.482 |
| 4.723 | 1.484 |
| 4.724 | 1.486 |
| 4.725 | 1.489 |
| 4.726 | 1.491 |
| 4.727 | 1.493 |
| 4.728 | 1.496 |
| 4.729 | 1.498 |
| 4.73 | 1.5 |
| 4.731 | 1.502 |
| 4.732 | 1.505 |
| 4.733 | 1.507 |
| 4.734 | 1.509 |
| 4.735 | 1.512 |
| 4.736 | 1.514 |
| 4.737 | 1.516 |
| 4.738 | 1.518 |
| 4.739 | 1.521 |
| 4.74 | 1.523 |
| 4.741 | 1.525 |
| 4.742 | 1.528 |
| 4.743 | 1.53 |
| 4.744 | 1.532 |
| 4.745 | 1.535 |
| 4.746 | 1.537 |
| 4.747 | 1.539 |
| 4.748 | 1.541 |
| 4.749 | 1.544 |
| 4.75 | 1.546 |
| 4.751 | 1.548 |
| 4.752 | 1.551 |
| 4.753 | 1.553 |
| 4.754 | 1.555 |
| 4.755 | 1.558 |
| 4.756 | 1.56 |
| 4.757 | 1.562 |
| 4.758 | 1.564 |
| 4.759 | 1.567 |
| 4.76 | 1.569 |
| 4.761 | 1.571 |
| 4.762 | 1.574 |
| 4.763 | 1.576 |
| 4.764 | 1.578 |
| 4.765 | 1.581 |
| 4.766 | 1.583 |
| 4.767 | 1.585 |
| 4.768 | 1.587 |
| 4.769 | 1.59 |
| 4.77 | 1.592 |
| 4.771 | 1.594 |
| 4.772 | 1.597 |
| 4.773 | 1.599 |
| 4.774 | 1.601 |
| 4.775 | 1.604 |
| 4.776 | 1.606 |
| 4.777 | 1.608 |
| 4.778 | 1.611 |
| 4.779 | 1.613 |
| 4.78 | 1.615 |
| 4.781 | 1.618 |
| 4.782 | 1.62 |
| 4.783 | 1.622 |
| 4.784 | 1.624 |
| 4.785 | 1.627 |
| 4.786 | 1.629 |
| 4.787 | 1.631 |
| 4.788 | 1.634 |
| 4.789 | 1.636 |
| 4.79 | 1.638 |
| 4.791 | 1.641 |
| 4.792 | 1.643 |
| 4.793 | 1.645 |
| 4.794 | 1.648 |
| 4.795 | 1.65 |
| 4.796 | 1.652 |
| 4.797 | 1.655 |
| 4.798 | 1.657 |
| 4.799 | 1.659 |
| 4.8 | 1.662 |
| 4.801 | 1.664 |
| 4.802 | 1.666 |
| 4.803 | 1.669 |
| 4.804 | 1.671 |
| 4.805 | 1.673 |
| 4.806 | 1.676 |
| 4.807 | 1.678 |
| 4.808 | 1.68 |
| 4.809 | 1.683 |
| 4.81 | 1.685 |
| 4.811 | 1.687 |
| 4.812 | 1.69 |
| 4.813 | 1.692 |
| 4.814 | 1.694 |
| 4.815 | 1.697 |
| 4.816 | 1.699 |
| 4.817 | 1.701 |
| 4.818 | 1.704 |
| 4.819 | 1.706 |
| 4.82 | 1.708 |
| 4.821 | 1.711 |
| 4.822 | 1.713 |
| 4.823 | 1.716 |
| 4.824 | 1.718 |
| 4.825 | 1.72 |
| 4.826 | 1.723 |
| 4.827 | 1.725 |
| 4.828 | 1.727 |
| 4.829 | 1.73 |
| 4.83 | 1.732 |
| 4.831 | 1.734 |
| 4.832 | 1.737 |
| 4.833 | 1.739 |
| 4.834 | 1.741 |
| 4.835 | 1.744 |
| 4.836 | 1.746 |
| 4.837 | 1.748 |
| 4.838 | 1.751 |
| 4.839 | 1.753 |
| 4.84 | 1.755 |
| 4.841 | 1.758 |
| 4.842 | 1.76 |
| 4.843 | 1.763 |
| 4.844 | 1.765 |
| 4.845 | 1.767 |
| 4.846 | 1.77 |
| 4.847 | 1.772 |
| 4.848 | 1.774 |
| 4.849 | 1.777 |
| 4.85 | 1.779 |
| 4.851 | 1.781 |
| 4.852 | 1.784 |
| 4.853 | 1.786 |
| 4.854 | 1.789 |
| 4.855 | 1.791 |
| 4.856 | 1.793 |
| 4.857 | 1.796 |
| 4.858 | 1.798 |
| 4.859 | 1.8 |
| 4.86 | 1.803 |
| 4.861 | 1.805 |
| 4.862 | 1.808 |
| 4.863 | 1.81 |
| 4.864 | 1.812 |
| 4.865 | 1.815 |
| 4.866 | 1.817 |
| 4.867 | 1.819 |
| 4.868 | 1.822 |
| 4.869 | 1.824 |
| 4.87 | 1.827 |
| 4.871 | 1.829 |
| 4.872 | 1.831 |
| 4.873 | 1.834 |
| 4.874 | 1.836 |
| 4.875 | 1.838 |
| 4.876 | 1.841 |
| 4.877 | 1.843 |
| 4.878 | 1.846 |
| 4.879 | 1.848 |
| 4.88 | 1.85 |
| 4.881 | 1.853 |
| 4.882 | 1.855 |
| 4.883 | 1.857 |
| 4.884 | 1.86 |
| 4.885 | 1.862 |
| 4.886 | 1.865 |
| 4.887 | 1.867 |
| 4.888 | 1.869 |
| 4.889 | 1.872 |
| 4.89 | 1.874 |
| 4.891 | 1.877 |
| 4.892 | 1.879 |
| 4.893 | 1.881 |
| 4.894 | 1.884 |
| 4.895 | 1.886 |
| 4.896 | 1.889 |
| 4.897 | 1.891 |
| 4.898 | 1.893 |
| 4.899 | 1.896 |
| 4.9 | 1.898 |
| 4.901 | 1.901 |
| 4.902 | 1.903 |
| 4.903 | 1.905 |
| 4.904 | 1.908 |
| 4.905 | 1.91 |
| 4.906 | 1.913 |
| 4.907 | 1.915 |
| 4.908 | 1.917 |
| 4.909 | 1.92 |
| 4.91 | 1.922 |
| 4.911 | 1.925 |
| 4.912 | 1.927 |
| 4.913 | 1.929 |
| 4.914 | 1.932 |
| 4.915 | 1.934 |
| 4.916 | 1.937 |
| 4.917 | 1.939 |
| 4.918 | 1.941 |
| 4.919 | 1.944 |
| 4.92 | 1.946 |
| 4.921 | 1.949 |
| 4.922 | 1.951 |
| 4.923 | 1.954 |
| 4.924 | 1.956 |
| 4.925 | 1.958 |
| 4.926 | 1.961 |
| 4.927 | 1.963 |
| 4.928 | 1.966 |
| 4.929 | 1.968 |
| 4.93 | 1.97 |
| 4.931 | 1.973 |
| 4.932 | 1.975 |
| 4.933 | 1.978 |
| 4.934 | 1.98 |
| 4.935 | 1.983 |
| 4.936 | 1.985 |
| 4.937 | 1.987 |
| 4.938 | 1.99 |
| 4.939 | 1.992 |
| 4.94 | 1.995 |
| 4.941 | 1.997 |
| 4.942 | 2 |
| 4.943 | 2.002 |
| 4.944 | 2.004 |
| 4.945 | 2.007 |
| 4.946 | 2.009 |
| 4.947 | 2.012 |
| 4.948 | 2.014 |
| 4.949 | 2.017 |
| 4.95 | 2.019 |
| 4.951 | 2.021 |
| 4.952 | 2.024 |
| 4.953 | 2.026 |
| 4.954 | 2.029 |
| 4.955 | 2.031 |
| 4.956 | 2.034 |
| 4.957 | 2.036 |
| 4.958 | 2.038 |
| 4.959 | 2.041 |
| 4.96 | 2.043 |
| 4.961 | 2.046 |
| 4.962 | 2.048 |
| 4.963 | 2.051 |
| 4.964 | 2.053 |
| 4.965 | 2.056 |
| 4.966 | 2.058 |
| 4.967 | 2.06 |
| 4.968 | 2.063 |
| 4.969 | 2.065 |
| 4.97 | 2.068 |
| 4.971 | 2.07 |
| 4.972 | 2.073 |
| 4.973 | 2.075 |
| 4.974 | 2.078 |
| 4.975 | 2.08 |
| 4.976 | 2.082 |
| 4.977 | 2.085 |
| 4.978 | 2.087 |
| 4.979 | 2.09 |
| 4.98 | 2.092 |
| 4.981 | 2.095 |
| 4.982 | 2.097 |
| 4.983 | 2.1 |
| 4.984 | 2.102 |
| 4.985 | 2.105 |
| 4.986 | 2.107 |
| 4.987 | 2.109 |
| 4.988 | 2.112 |
| 4.989 | 2.114 |
| 4.99 | 2.117 |
| 4.991 | 2.119 |
| 4.992 | 2.122 |
| 4.993 | 2.124 |
| 4.994 | 2.127 |
| 4.995 | 2.129 |
| 4.996 | 2.132 |
| 4.997 | 2.134 |
| 4.998 | 2.137 |
| 4.999 | 2.139 |
| 5.0 | 2.141 |
| 5.001 | 2.144 |
| 5.002 | 2.146 |
| 5.003 | 2.149 |
| 5.004 | 2.151 |
| 5.005 | 2.154 |
| 5.006 | 2.156 |
| 5.007 | 2.159 |
| 5.008 | 2.161 |
| 5.009 | 2.164 |
| 5.01 | 2.166 |
| 5.011 | 2.169 |
| 5.012 | 2.171 |
| 5.013 | 2.174 |
| 5.014 | 2.176 |
| 5.015 | 2.179 |
| 5.016 | 2.181 |
| 5.017 | 2.184 |
| 5.018 | 2.186 |
| 5.019 | 2.188 |
| 5.02 | 2.191 |
| 5.021 | 2.193 |
| 5.022 | 2.196 |
| 5.023 | 2.198 |
| 5.024 | 2.201 |
| 5.025 | 2.203 |
| 5.026 | 2.206 |
| 5.027 | 2.208 |
| 5.028 | 2.211 |
| 5.029 | 2.213 |
| 5.03 | 2.216 |
| 5.031 | 2.218 |
| 5.032 | 2.221 |
| 5.033 | 2.223 |
| 5.034 | 2.226 |
| 5.035 | 2.228 |
| 5.036 | 2.231 |
| 5.037 | 2.233 |
| 5.038 | 2.236 |
| 5.039 | 2.238 |
| 5.04 | 2.241 |
| 5.041 | 2.243 |
| 5.042 | 2.246 |
| 5.043 | 2.248 |
| 5.044 | 2.251 |
| 5.045 | 2.253 |
| 5.046 | 2.256 |
| 5.047 | 2.258 |
| 5.048 | 2.261 |
| 5.049 | 2.263 |
| 5.05 | 2.266 |
| 5.051 | 2.268 |
| 5.052 | 2.271 |
| 5.053 | 2.273 |
| 5.054 | 2.276 |
| 5.055 | 2.278 |
| 5.056 | 2.281 |
| 5.057 | 2.283 |
| 5.058 | 2.286 |
| 5.059 | 2.288 |
| 5.06 | 2.291 |
| 5.061 | 2.293 |
| 5.062 | 2.296 |
| 5.063 | 2.298 |
| 5.064 | 2.301 |
| 5.065 | 2.303 |
| 5.066 | 2.306 |
| 5.067 | 2.308 |
| 5.068 | 2.311 |
| 5.069 | 2.313 |
| 5.07 | 2.316 |
| 5.071 | 2.318 |
| 5.072 | 2.321 |
| 5.073 | 2.323 |
| 5.074 | 2.326 |
| 5.075 | 2.328 |
| 5.076 | 2.331 |
| 5.077 | 2.334 |
| 5.078 | 2.336 |
| 5.079 | 2.339 |
| 5.08 | 2.341 |
| 5.081 | 2.344 |
| 5.082 | 2.346 |
| 5.083 | 2.349 |
| 5.084 | 2.351 |
| 5.085 | 2.354 |
| 5.086 | 2.356 |
| 5.087 | 2.359 |
| 5.088 | 2.361 |
| 5.089 | 2.364 |
| 5.09 | 2.366 |
| 5.091 | 2.369 |
| 5.092 | 2.371 |
| 5.093 | 2.374 |
| 5.094 | 2.377 |
| 5.095 | 2.379 |
| 5.096 | 2.382 |
| 5.097 | 2.384 |
| 5.098 | 2.387 |
| 5.099 | 2.389 |
| 5.1 | 2.392 |
| 5.101 | 2.394 |
| 5.102 | 2.397 |
| 5.103 | 2.399 |
| 5.104 | 2.402 |
| 5.105 | 2.404 |
| 5.106 | 2.407 |
| 5.107 | 2.41 |
| 5.108 | 2.412 |
| 5.109 | 2.415 |
| 5.11 | 2.417 |
| 5.111 | 2.42 |
| 5.112 | 2.422 |
| 5.113 | 2.425 |
| 5.114 | 2.427 |
| 5.115 | 2.43 |
| 5.116 | 2.432 |
| 5.117 | 2.435 |
| 5.118 | 2.438 |
| 5.119 | 2.44 |
| 5.12 | 2.443 |
| 5.121 | 2.445 |
| 5.122 | 2.448 |
| 5.123 | 2.45 |
| 5.124 | 2.453 |
| 5.125 | 2.455 |
| 5.126 | 2.458 |
| 5.127 | 2.461 |
| 5.128 | 2.463 |
| 5.129 | 2.466 |
| 5.13 | 2.468 |
| 5.131 | 2.471 |
| 5.132 | 2.473 |
| 5.133 | 2.476 |
| 5.134 | 2.478 |
| 5.135 | 2.481 |
| 5.136 | 2.484 |
| 5.137 | 2.486 |
| 5.138 | 2.489 |
| 5.139 | 2.491 |
| 5.14 | 2.494 |
| 5.141 | 2.496 |
| 5.142 | 2.499 |
| 5.143 | 2.502 |
| 5.144 | 2.504 |
| 5.145 | 2.507 |
| 5.146 | 2.509 |
| 5.147 | 2.512 |
| 5.148 | 2.514 |
| 5.149 | 2.517 |
| 5.15 | 2.52 |
| 5.151 | 2.522 |
| 5.152 | 2.525 |
| 5.153 | 2.527 |
| 5.154 | 2.53 |
| 5.155 | 2.532 |
| 5.156 | 2.535 |
| 5.157 | 2.538 |
| 5.158 | 2.54 |
| 5.159 | 2.543 |
| 5.16 | 2.545 |
| 5.161 | 2.548 |
| 5.162 | 2.55 |
| 5.163 | 2.553 |
| 5.164 | 2.556 |
| 5.165 | 2.558 |
| 5.166 | 2.561 |
| 5.167 | 2.563 |
| 5.168 | 2.566 |
| 5.169 | 2.569 |
| 5.17 | 2.571 |
| 5.171 | 2.574 |
| 5.172 | 2.576 |
| 5.173 | 2.579 |
| 5.174 | 2.582 |
| 5.175 | 2.584 |
| 5.176 | 2.587 |
| 5.177 | 2.589 |
| 5.178 | 2.592 |
| 5.179 | 2.594 |
| 5.18 | 2.597 |
| 5.181 | 2.6 |
| 5.182 | 2.602 |
| 5.183 | 2.605 |
| 5.184 | 2.607 |
| 5.185 | 2.61 |
| 5.186 | 2.613 |
| 5.187 | 2.615 |
| 5.188 | 2.618 |
| 5.189 | 2.62 |
| 5.19 | 2.623 |
| 5.191 | 2.626 |
| 5.192 | 2.628 |
| 5.193 | 2.631 |
| 5.194 | 2.634 |
| 5.195 | 2.636 |
| 5.196 | 2.639 |
| 5.197 | 2.641 |
| 5.198 | 2.644 |
| 5.199 | 2.647 |
| 5.2 | 2.649 |
| 5.201 | 2.652 |
| 5.202 | 2.654 |
| 5.203 | 2.657 |
| 5.204 | 2.66 |
| 5.205 | 2.662 |
| 5.206 | 2.665 |
| 5.207 | 2.667 |
| 5.208 | 2.67 |
| 5.209 | 2.673 |
| 5.21 | 2.675 |
| 5.211 | 2.678 |
| 5.212 | 2.681 |
| 5.213 | 2.683 |
| 5.214 | 2.686 |
| 5.215 | 2.688 |
| 5.216 | 2.691 |
| 5.217 | 2.694 |
| 5.218 | 2.696 |
| 5.219 | 2.699 |
| 5.22 | 2.702 |
| 5.221 | 2.704 |
| 5.222 | 2.707 |
| 5.223 | 2.709 |
| 5.224 | 2.712 |
| 5.225 | 2.715 |
| 5.226 | 2.717 |
| 5.227 | 2.72 |
| 5.228 | 2.723 |
| 5.229 | 2.725 |
| 5.23 | 2.728 |
| 5.231 | 2.73 |
| 5.232 | 2.733 |
| 5.233 | 2.736 |
| 5.234 | 2.738 |
| 5.235 | 2.741 |
| 5.236 | 2.744 |
| 5.237 | 2.746 |
| 5.238 | 2.749 |
| 5.239 | 2.752 |
| 5.24 | 2.754 |
| 5.241 | 2.757 |
| 5.242 | 2.759 |
| 5.243 | 2.762 |
| 5.244 | 2.765 |
| 5.245 | 2.767 |
| 5.246 | 2.77 |
| 5.247 | 2.773 |
| 5.248 | 2.775 |
| 5.249 | 2.778 |
| 5.25 | 2.781 |
| 5.251 | 2.783 |
| 5.252 | 2.786 |
| 5.253 | 2.789 |
| 5.254 | 2.791 |
| 5.255 | 2.794 |
| 5.256 | 2.796 |
| 5.257 | 2.799 |
| 5.258 | 2.802 |
| 5.259 | 2.804 |
| 5.26 | 2.807 |
| 5.261 | 2.81 |
| 5.262 | 2.812 |
| 5.263 | 2.815 |
| 5.264 | 2.818 |
| 5.265 | 2.82 |
| 5.266 | 2.823 |
| 5.267 | 2.826 |
| 5.268 | 2.828 |
| 5.269 | 2.831 |
| 5.27 | 2.834 |
| 5.271 | 2.836 |
| 5.272 | 2.839 |
| 5.273 | 2.842 |
| 5.274 | 2.844 |
| 5.275 | 2.847 |
| 5.276 | 2.85 |
| 5.277 | 2.852 |
| 5.278 | 2.855 |
| 5.279 | 2.858 |
| 5.28 | 2.86 |
| 5.281 | 2.863 |
| 5.282 | 2.866 |
| 5.283 | 2.868 |
| 5.284 | 2.871 |
| 5.285 | 2.874 |
| 5.286 | 2.876 |
| 5.287 | 2.879 |
| 5.288 | 2.882 |
| 5.289 | 2.884 |
| 5.29 | 2.887 |
| 5.291 | 2.89 |
| 5.292 | 2.892 |
| 5.293 | 2.895 |
| 5.294 | 2.898 |
| 5.295 | 2.9 |
| 5.296 | 2.903 |
| 5.297 | 2.906 |
| 5.298 | 2.909 |
| 5.299 | 2.911 |
| 5.3 | 2.914 |
| 5.301 | 2.917 |
| 5.302 | 2.919 |
| 5.303 | 2.922 |
| 5.304 | 2.925 |
| 5.305 | 2.927 |
| 5.306 | 2.93 |
| 5.307 | 2.933 |
| 5.308 | 2.935 |
| 5.309 | 2.938 |
| 5.31 | 2.941 |
| 5.311 | 2.943 |
| 5.312 | 2.946 |
| 5.313 | 2.949 |
| 5.314 | 2.952 |
| 5.315 | 2.954 |
| 5.316 | 2.957 |
| 5.317 | 2.96 |
| 5.318 | 2.962 |
| 5.319 | 2.965 |
| 5.32 | 2.968 |
| 5.321 | 2.97 |
| 5.322 | 2.973 |
| 5.323 | 2.976 |
| 5.324 | 2.979 |
| 5.325 | 2.981 |
| 5.326 | 2.984 |
| 5.327 | 2.987 |
| 5.328 | 2.989 |
| 5.329 | 2.992 |
| 5.33 | 2.995 |
| 5.331 | 2.997 |
| 5.332 | 3 |
| 5.333 | 3.003 |
| 5.334 | 3.006 |
| 5.335 | 3.008 |
| 5.336 | 3.011 |
| 5.337 | 3.014 |
| 5.338 | 3.016 |
| 5.339 | 3.019 |
| 5.34 | 3.022 |
| 5.341 | 3.025 |
| 5.342 | 3.027 |
| 5.343 | 3.03 |
| 5.344 | 3.033 |
| 5.345 | 3.035 |
| 5.346 | 3.038 |
| 5.347 | 3.041 |
| 5.348 | 3.044 |
| 5.349 | 3.046 |
| 5.35 | 3.049 |
| 5.351 | 3.052 |
| 5.352 | 3.055 |
| 5.353 | 3.057 |
| 5.354 | 3.06 |
| 5.355 | 3.063 |
| 5.356 | 3.065 |
| 5.357 | 3.068 |
| 5.358 | 3.071 |
| 5.359 | 3.074 |
| 5.36 | 3.076 |
| 5.361 | 3.079 |
| 5.362 | 3.082 |
| 5.363 | 3.085 |
| 5.364 | 3.087 |
| 5.365 | 3.09 |
| 5.366 | 3.093 |
| 5.367 | 3.095 |
| 5.368 | 3.098 |
| 5.369 | 3.101 |
| 5.37 | 3.104 |
| 5.371 | 3.106 |
| 5.372 | 3.109 |
| 5.373 | 3.112 |
| 5.374 | 3.115 |
| 5.375 | 3.117 |
| 5.376 | 3.12 |
| 5.377 | 3.123 |
| 5.378 | 3.126 |
| 5.379 | 3.128 |
| 5.38 | 3.131 |
| 5.381 | 3.134 |
| 5.382 | 3.137 |
| 5.383 | 3.139 |
| 5.384 | 3.142 |
| 5.385 | 3.145 |
| 5.386 | 3.148 |
| 5.387 | 3.15 |
| 5.388 | 3.153 |
| 5.389 | 3.156 |
| 5.39 | 3.159 |
| 5.391 | 3.161 |
| 5.392 | 3.164 |
| 5.393 | 3.167 |
| 5.394 | 3.17 |
| 5.395 | 3.172 |
| 5.396 | 3.175 |
| 5.397 | 3.178 |
| 5.398 | 3.181 |
| 5.399 | 3.183 |
| 5.4 | 3.186 |
| 5.401 | 3.189 |
| 5.402 | 3.192 |
| 5.403 | 3.194 |
| 5.404 | 3.197 |
| 5.405 | 3.2 |
| 5.406 | 3.203 |
| 5.407 | 3.205 |
| 5.408 | 3.208 |
| 5.409 | 3.211 |
| 5.41 | 3.214 |
| 5.411 | 3.217 |
| 5.412 | 3.219 |
| 5.413 | 3.222 |
| 5.414 | 3.225 |
| 5.415 | 3.228 |
| 5.416 | 3.23 |
| 5.417 | 3.233 |
| 5.418 | 3.236 |
| 5.419 | 3.239 |
| 5.42 | 3.241 |
| 5.421 | 3.244 |
| 5.422 | 3.247 |
| 5.423 | 3.25 |
| 5.424 | 3.253 |
| 5.425 | 3.255 |
| 5.426 | 3.258 |
| 5.427 | 3.261 |
| 5.428 | 3.264 |
| 5.429 | 3.266 |
| 5.43 | 3.269 |
| 5.431 | 3.272 |
| 5.432 | 3.275 |
| 5.433 | 3.278 |
| 5.434 | 3.28 |
| 5.435 | 3.283 |
| 5.436 | 3.286 |
| 5.437 | 3.289 |
| 5.438 | 3.292 |
| 5.439 | 3.294 |
| 5.44 | 3.297 |
| 5.441 | 3.3 |
| 5.442 | 3.303 |
| 5.443 | 3.306 |
| 5.444 | 3.308 |
| 5.445 | 3.311 |
| 5.446 | 3.314 |
| 5.447 | 3.317 |
| 5.448 | 3.32 |
| 5.449 | 3.322 |
| 5.45 | 3.325 |
| 5.451 | 3.328 |
| 5.452 | 3.331 |
| 5.453 | 3.334 |
| 5.454 | 3.336 |
| 5.455 | 3.339 |
| 5.456 | 3.342 |
| 5.457 | 3.345 |
| 5.458 | 3.348 |
| 5.459 | 3.35 |
| 5.46 | 3.353 |
| 5.461 | 3.356 |
| 5.462 | 3.359 |
| 5.463 | 3.362 |
| 5.464 | 3.364 |
| 5.465 | 3.367 |
| 5.466 | 3.37 |
| 5.467 | 3.373 |
| 5.468 | 3.376 |
| 5.469 | 3.378 |
| 5.47 | 3.381 |
| 5.471 | 3.384 |
| 5.472 | 3.387 |
| 5.473 | 3.39 |
| 5.474 | 3.392 |
| 5.475 | 3.395 |
| 5.476 | 3.398 |
| 5.477 | 3.401 |
| 5.478 | 3.404 |
| 5.479 | 3.407 |
| 5.48 | 3.409 |
| 5.481 | 3.412 |
| 5.482 | 3.415 |
| 5.483 | 3.418 |
| 5.484 | 3.421 |
| 5.485 | 3.424 |
| 5.486 | 3.426 |
| 5.487 | 3.429 |
| 5.488 | 3.432 |
| 5.489 | 3.435 |
| 5.49 | 3.438 |
| 5.491 | 3.441 |
| 5.492 | 3.443 |
| 5.493 | 3.446 |
| 5.494 | 3.449 |
| 5.495 | 3.452 |
| 5.496 | 3.455 |
| 5.497 | 3.458 |
| 5.498 | 3.46 |
| 5.499 | 3.463 |
| 5.5 | 3.466 |
| 5.501 | 3.469 |
| 5.502 | 3.472 |
| 5.503 | 3.475 |
| 5.504 | 3.477 |
| 5.505 | 3.48 |
| 5.506 | 3.483 |
| 5.507 | 3.486 |
| 5.508 | 3.489 |
| 5.509 | 3.492 |
| 5.51 | 3.494 |
| 5.511 | 3.497 |
| 5.512 | 3.5 |
| 5.513 | 3.503 |
| 5.514 | 3.506 |
| 5.515 | 3.509 |
| 5.516 | 3.512 |
| 5.517 | 3.514 |
| 5.518 | 3.517 |
| 5.519 | 3.52 |
| 5.52 | 3.523 |
| 5.521 | 3.526 |
| 5.522 | 3.529 |
| 5.523 | 3.532 |
| 5.524 | 3.534 |
| 5.525 | 3.537 |
| 5.526 | 3.54 |
| 5.527 | 3.543 |
| 5.528 | 3.546 |
| 5.529 | 3.549 |
| 5.53 | 3.552 |
| 5.531 | 3.554 |
| 5.532 | 3.557 |
| 5.533 | 3.56 |
| 5.534 | 3.563 |
| 5.535 | 3.566 |
| 5.536 | 3.569 |
| 5.537 | 3.572 |
| 5.538 | 3.574 |
| 5.539 | 3.577 |
| 5.54 | 3.58 |
| 5.541 | 3.583 |
| 5.542 | 3.586 |
| 5.543 | 3.589 |
| 5.544 | 3.592 |
| 5.545 | 3.595 |
| 5.546 | 3.597 |
| 5.547 | 3.6 |
| 5.548 | 3.603 |
| 5.549 | 3.606 |
| 5.55 | 3.609 |
| 5.551 | 3.612 |
| 5.552 | 3.615 |
| 5.553 | 3.618 |
| 5.554 | 3.62 |
| 5.555 | 3.623 |
| 5.556 | 3.626 |
| 5.557 | 3.629 |
| 5.558 | 3.632 |
| 5.559 | 3.635 |
| 5.56 | 3.638 |
| 5.561 | 3.641 |
| 5.562 | 3.643 |
| 5.563 | 3.646 |
| 5.564 | 3.649 |
| 5.565 | 3.652 |
| 5.566 | 3.655 |
| 5.567 | 3.658 |
| 5.568 | 3.661 |
| 5.569 | 3.664 |
| 5.57 | 3.667 |
| 5.571 | 3.67 |
| 5.572 | 3.672 |
| 5.573 | 3.675 |
| 5.574 | 3.678 |
| 5.575 | 3.681 |
| 5.576 | 3.684 |
| 5.577 | 3.687 |
| 5.578 | 3.69 |
| 5.579 | 3.693 |
| 5.58 | 3.696 |
| 5.581 | 3.698 |
| 5.582 | 3.701 |
| 5.583 | 3.704 |
| 5.584 | 3.707 |
| 5.585 | 3.71 |
| 5.586 | 3.713 |
| 5.587 | 3.716 |
| 5.588 | 3.719 |
| 5.589 | 3.722 |
| 5.59 | 3.725 |
| 5.591 | 3.728 |
| 5.592 | 3.73 |
| 5.593 | 3.733 |
| 5.594 | 3.736 |
| 5.595 | 3.739 |
| 5.596 | 3.742 |
| 5.597 | 3.745 |
| 5.598 | 3.748 |
| 5.599 | 3.751 |
| 5.6 | 3.754 |
| 5.601 | 3.757 |
| 5.602 | 3.76 |
| 5.603 | 3.763 |
| 5.604 | 3.765 |
| 5.605 | 3.768 |
| 5.606 | 3.771 |
| 5.607 | 3.774 |
| 5.608 | 3.777 |
| 5.609 | 3.78 |
| 5.61 | 3.783 |
| 5.611 | 3.786 |
| 5.612 | 3.789 |
| 5.613 | 3.792 |
| 5.614 | 3.795 |
| 5.615 | 3.798 |
| 5.616 | 3.801 |
| 5.617 | 3.803 |
| 5.618 | 3.806 |
| 5.619 | 3.809 |
| 5.62 | 3.812 |
| 5.621 | 3.815 |
| 5.622 | 3.818 |
| 5.623 | 3.821 |
| 5.624 | 3.824 |
| 5.625 | 3.827 |
| 5.626 | 3.83 |
| 5.627 | 3.833 |
| 5.628 | 3.836 |
| 5.629 | 3.839 |
| 5.63 | 3.842 |
| 5.631 | 3.845 |
| 5.632 | 3.848 |
| 5.633 | 3.85 |
| 5.634 | 3.853 |
| 5.635 | 3.856 |
| 5.636 | 3.859 |
| 5.637 | 3.862 |
| 5.638 | 3.865 |
| 5.639 | 3.868 |
| 5.64 | 3.871 |
| 5.641 | 3.874 |
| 5.642 | 3.877 |
| 5.643 | 3.88 |
| 5.644 | 3.883 |
| 5.645 | 3.886 |
| 5.646 | 3.889 |
| 5.647 | 3.892 |
| 5.648 | 3.895 |
| 5.649 | 3.898 |
| 5.65 | 3.901 |
| 5.651 | 3.904 |
| 5.652 | 3.907 |
| 5.653 | 3.91 |
| 5.654 | 3.912 |
| 5.655 | 3.915 |
| 5.656 | 3.918 |
| 5.657 | 3.921 |
| 5.658 | 3.924 |
| 5.659 | 3.927 |
| 5.66 | 3.93 |
| 5.661 | 3.933 |
| 5.662 | 3.936 |
| 5.663 | 3.939 |
| 5.664 | 3.942 |
| 5.665 | 3.945 |
| 5.666 | 3.948 |
| 5.667 | 3.951 |
| 5.668 | 3.954 |
| 5.669 | 3.957 |
| 5.67 | 3.96 |
| 5.671 | 3.963 |
| 5.672 | 3.966 |
| 5.673 | 3.969 |
| 5.674 | 3.972 |
| 5.675 | 3.975 |
| 5.676 | 3.978 |
| 5.677 | 3.981 |
| 5.678 | 3.984 |
| 5.679 | 3.987 |
| 5.68 | 3.99 |
| 5.681 | 3.993 |
| 5.682 | 3.996 |
| 5.683 | 3.999 |
| 5.684 | 4.002 |
| 5.685 | 4.005 |
| 5.686 | 4.008 |
| 5.687 | 4.011 |
| 5.688 | 4.014 |
| 5.689 | 4.017 |
| 5.69 | 4.02 |
| 5.691 | 4.023 |
| 5.692 | 4.026 |
| 5.693 | 4.029 |
| 5.694 | 4.032 |
| 5.695 | 4.035 |
| 5.696 | 4.038 |
| 5.697 | 4.041 |
| 5.698 | 4.044 |
| 5.699 | 4.047 |
| 5.7 | 4.05 |
| 5.701 | 4.053 |
| 5.702 | 4.056 |
| 5.703 | 4.059 |
| 5.704 | 4.062 |
| 5.705 | 4.065 |
| 5.706 | 4.068 |
| 5.707 | 4.071 |
| 5.708 | 4.074 |
| 5.709 | 4.077 |
| 5.71 | 4.08 |
| 5.711 | 4.083 |
| 5.712 | 4.086 |
| 5.713 | 4.089 |
| 5.714 | 4.092 |
| 5.715 | 4.095 |
| 5.716 | 4.098 |
| 5.717 | 4.101 |
| 5.718 | 4.104 |
| 5.719 | 4.107 |
| 5.72 | 4.11 |
| 5.721 | 4.113 |
| 5.722 | 4.116 |
| 5.723 | 4.119 |
| 5.724 | 4.122 |
| 5.725 | 4.125 |
| 5.726 | 4.128 |
| 5.727 | 4.131 |
| 5.728 | 4.134 |
| 5.729 | 4.137 |
| 5.73 | 4.14 |
| 5.731 | 4.143 |
| 5.732 | 4.146 |
| 5.733 | 4.149 |
| 5.734 | 4.152 |
| 5.735 | 4.155 |
| 5.736 | 4.158 |
| 5.737 | 4.161 |
| 5.738 | 4.164 |
| 5.739 | 4.167 |
| 5.74 | 4.17 |
| 5.741 | 4.173 |
| 5.742 | 4.176 |
| 5.743 | 4.179 |
| 5.744 | 4.182 |
| 5.745 | 4.185 |
| 5.746 | 4.188 |
| 5.747 | 4.191 |
| 5.748 | 4.194 |
| 5.749 | 4.198 |
| 5.75 | 4.201 |
| 5.751 | 4.204 |
| 5.752 | 4.207 |
| 5.753 | 4.21 |
| 5.754 | 4.213 |
| 5.755 | 4.216 |
| 5.756 | 4.219 |
| 5.757 | 4.222 |
| 5.758 | 4.225 |
| 5.759 | 4.228 |
| 5.76 | 4.231 |
| 5.761 | 4.234 |
| 5.762 | 4.237 |
| 5.763 | 4.24 |
| 5.764 | 4.243 |
| 5.765 | 4.246 |
| 5.766 | 4.249 |
| 5.767 | 4.252 |
| 5.768 | 4.255 |
| 5.769 | 4.258 |
| 5.77 | 4.262 |
| 5.771 | 4.265 |
| 5.772 | 4.268 |
| 5.773 | 4.271 |
| 5.774 | 4.274 |
| 5.775 | 4.277 |
| 5.776 | 4.28 |
| 5.777 | 4.283 |
| 5.778 | 4.286 |
| 5.779 | 4.289 |
| 5.78 | 4.292 |
| 5.781 | 4.295 |
| 5.782 | 4.298 |
| 5.783 | 4.301 |
| 5.784 | 4.304 |
| 5.785 | 4.307 |
| 5.786 | 4.311 |
| 5.787 | 4.314 |
| 5.788 | 4.317 |
| 5.789 | 4.32 |
| 5.79 | 4.323 |
| 5.791 | 4.326 |
| 5.792 | 4.329 |
| 5.793 | 4.332 |
| 5.794 | 4.335 |
| 5.795 | 4.338 |
| 5.796 | 4.341 |
| 5.797 | 4.344 |
| 5.798 | 4.347 |
| 5.799 | 4.351 |
| 5.8 | 4.354 |
| 5.801 | 4.357 |
| 5.802 | 4.36 |
| 5.803 | 4.363 |
| 5.804 | 4.366 |
| 5.805 | 4.369 |
| 5.806 | 4.372 |
| 5.807 | 4.375 |
| 5.808 | 4.378 |
| 5.809 | 4.381 |
| 5.81 | 4.384 |
| 5.811 | 4.388 |
| 5.812 | 4.391 |
| 5.813 | 4.394 |
| 5.814 | 4.397 |
| 5.815 | 4.4 |
| 5.816 | 4.403 |
| 5.817 | 4.406 |
| 5.818 | 4.409 |
| 5.819 | 4.412 |
| 5.82 | 4.415 |
| 5.821 | 4.419 |
| 5.822 | 4.422 |
| 5.823 | 4.425 |
| 5.824 | 4.428 |
| 5.825 | 4.431 |
| 5.826 | 4.434 |
| 5.827 | 4.437 |
| 5.828 | 4.44 |
| 5.829 | 4.443 |
| 5.83 | 4.446 |
| 5.831 | 4.45 |
| 5.832 | 4.453 |
| 5.833 | 4.456 |
| 5.834 | 4.459 |
| 5.835 | 4.462 |
| 5.836 | 4.465 |
| 5.837 | 4.468 |
| 5.838 | 4.471 |
| 5.839 | 4.474 |
| 5.84 | 4.478 |
| 5.841 | 4.481 |
| 5.842 | 4.484 |
| 5.843 | 4.487 |
| 5.844 | 4.49 |
| 5.845 | 4.493 |
| 5.846 | 4.496 |
| 5.847 | 4.499 |
| 5.848 | 4.503 |
| 5.849 | 4.506 |
| 5.85 | 4.509 |
| 5.851 | 4.512 |
| 5.852 | 4.515 |
| 5.853 | 4.518 |
| 5.854 | 4.521 |
| 5.855 | 4.524 |
| 5.856 | 4.528 |
| 5.857 | 4.531 |
| 5.858 | 4.534 |
| 5.859 | 4.537 |
| 5.86 | 4.54 |
| 5.861 | 4.543 |
| 5.862 | 4.546 |
| 5.863 | 4.549 |
| 5.864 | 4.553 |
| 5.865 | 4.556 |
| 5.866 | 4.559 |
| 5.867 | 4.562 |
| 5.868 | 4.565 |
| 5.869 | 4.568 |
| 5.87 | 4.571 |
| 5.871 | 4.575 |
| 5.872 | 4.578 |
| 5.873 | 4.581 |
| 5.874 | 4.584 |
| 5.875 | 4.587 |
| 5.876 | 4.59 |
| 5.877 | 4.593 |
| 5.878 | 4.597 |
| 5.879 | 4.6 |
| 5.88 | 4.603 |
| 5.881 | 4.606 |
| 5.882 | 4.609 |
| 5.883 | 4.612 |
| 5.884 | 4.616 |
| 5.885 | 4.619 |
| 5.886 | 4.622 |
| 5.887 | 4.625 |
| 5.888 | 4.628 |
| 5.889 | 4.631 |
| 5.89 | 4.634 |
| 5.891 | 4.638 |
| 5.892 | 4.641 |
| 5.893 | 4.644 |
| 5.894 | 4.647 |
| 5.895 | 4.65 |
| 5.896 | 4.653 |
| 5.897 | 4.657 |
| 5.898 | 4.66 |
| 5.899 | 4.663 |
| 5.9 | 4.666 |
| 5.901 | 4.669 |
| 5.902 | 4.672 |
| 5.903 | 4.676 |
| 5.904 | 4.679 |
| 5.905 | 4.682 |
| 5.906 | 4.685 |
| 5.907 | 4.688 |
| 5.908 | 4.692 |
| 5.909 | 4.695 |
| 5.91 | 4.698 |
| 5.911 | 4.701 |
| 5.912 | 4.704 |
| 5.913 | 4.707 |
| 5.914 | 4.711 |
| 5.915 | 4.714 |
| 5.916 | 4.717 |
| 5.917 | 4.72 |
| 5.918 | 4.723 |
| 5.919 | 4.726 |
| 5.92 | 4.73 |
| 5.921 | 4.733 |
| 5.922 | 4.736 |
| 5.923 | 4.739 |
| 5.924 | 4.742 |
| 5.925 | 4.746 |
| 5.926 | 4.749 |
| 5.927 | 4.752 |
| 5.928 | 4.755 |
| 5.929 | 4.758 |
| 5.93 | 4.762 |
| 5.931 | 4.765 |
| 5.932 | 4.768 |
| 5.933 | 4.771 |
| 5.934 | 4.774 |
| 5.935 | 4.778 |
| 5.936 | 4.781 |
| 5.937 | 4.784 |
| 5.938 | 4.787 |
| 5.939 | 4.79 |
| 5.94 | 4.794 |
| 5.941 | 4.797 |
| 5.942 | 4.8 |
| 5.943 | 4.803 |
| 5.944 | 4.806 |
| 5.945 | 4.81 |
| 5.946 | 4.813 |
| 5.947 | 4.816 |
| 5.948 | 4.819 |
| 5.949 | 4.822 |
| 5.95 | 4.826 |
| 5.951 | 4.829 |
| 5.952 | 4.832 |
| 5.953 | 4.835 |
| 5.954 | 4.838 |
| 5.955 | 4.842 |
| 5.956 | 4.845 |
| 5.957 | 4.848 |
| 5.958 | 4.851 |
| 5.959 | 4.855 |
| 5.96 | 4.858 |
| 5.961 | 4.861 |
| 5.962 | 4.864 |
| 5.963 | 4.867 |
| 5.964 | 4.871 |
| 5.965 | 4.874 |
| 5.966 | 4.877 |
| 5.967 | 4.88 |
| 5.968 | 4.884 |
| 5.969 | 4.887 |
| 5.97 | 4.89 |
| 5.971 | 4.893 |
| 5.972 | 4.896 |
| 5.973 | 4.9 |
| 5.974 | 4.903 |
| 5.975 | 4.906 |
| 5.976 | 4.909 |
| 5.977 | 4.913 |
| 5.978 | 4.916 |
| 5.979 | 4.919 |
| 5.98 | 4.922 |
| 5.981 | 4.926 |
| 5.982 | 4.929 |
| 5.983 | 4.932 |
| 5.984 | 4.935 |
| 5.985 | 4.939 |
| 5.986 | 4.942 |
| 5.987 | 4.945 |
| 5.988 | 4.948 |
| 5.989 | 4.952 |
| 5.99 | 4.955 |
| 5.991 | 4.958 |
| 5.992 | 4.961 |
| 5.993 | 4.965 |
| 5.994 | 4.968 |
| 5.995 | 4.971 |
| 5.996 | 4.974 |
| 5.997 | 4.978 |
| 5.998 | 4.981 |
| 5.999 | 4.984 |
| 6.0 | 4.987 |
| 6.001 | 4.991 |
| 6.002 | 4.994 |
| 6.003 | 4.997 |
| 6.004 | 5 |
| 6.005 | 5.004 |
| 6.006 | 5.007 |
| 6.007 | 5.01 |
| 6.008 | 5.013 |
| 6.009 | 5.017 |
| 6.01 | 5.02 |
| 6.011 | 5.023 |
| 6.012 | 5.026 |
| 6.013 | 5.03 |
| 6.014 | 5.033 |
| 6.015 | 5.036 |
| 6.016 | 5.04 |
| 6.017 | 5.043 |
| 6.018 | 5.046 |
| 6.019 | 5.049 |
| 6.02 | 5.053 |
| 6.021 | 5.056 |
| 6.022 | 5.059 |
| 6.023 | 5.062 |
| 6.024 | 5.066 |
| 6.025 | 5.069 |
| 6.026 | 5.072 |
| 6.027 | 5.076 |
| 6.028 | 5.079 |
| 6.029 | 5.082 |
| 6.03 | 5.085 |
| 6.031 | 5.089 |
| 6.032 | 5.092 |
| 6.033 | 5.095 |
| 6.034 | 5.099 |
| 6.035 | 5.102 |
| 6.036 | 5.105 |
| 6.037 | 5.108 |
| 6.038 | 5.112 |
| 6.039 | 5.115 |
| 6.04 | 5.118 |
| 6.041 | 5.122 |
| 6.042 | 5.125 |
| 6.043 | 5.128 |
| 6.044 | 5.131 |
| 6.045 | 5.135 |
| 6.046 | 5.138 |
| 6.047 | 5.141 |
| 6.048 | 5.145 |
| 6.049 | 5.148 |
| 6.05 | 5.151 |
| 6.051 | 5.155 |
| 6.052 | 5.158 |
| 6.053 | 5.161 |
| 6.054 | 5.164 |
| 6.055 | 5.168 |
| 6.056 | 5.171 |
| 6.057 | 5.174 |
| 6.058 | 5.178 |
| 6.059 | 5.181 |
| 6.06 | 5.184 |
| 6.061 | 5.188 |
| 6.062 | 5.191 |
| 6.063 | 5.194 |
| 6.064 | 5.198 |
| 6.065 | 5.201 |
| 6.066 | 5.204 |
| 6.067 | 5.207 |
| 6.068 | 5.211 |
| 6.069 | 5.214 |
| 6.07 | 5.217 |
| 6.071 | 5.221 |
| 6.072 | 5.224 |
| 6.073 | 5.227 |
| 6.074 | 5.231 |
| 6.075 | 5.234 |
| 6.076 | 5.237 |
| 6.077 | 5.241 |
| 6.078 | 5.244 |
| 6.079 | 5.247 |
| 6.08 | 5.251 |
| 6.081 | 5.254 |
| 6.082 | 5.257 |
| 6.083 | 5.261 |
| 6.084 | 5.264 |
| 6.085 | 5.267 |
| 6.086 | 5.271 |
| 6.087 | 5.274 |
| 6.088 | 5.277 |
| 6.089 | 5.281 |
| 6.09 | 5.284 |
| 6.091 | 5.287 |
| 6.092 | 5.291 |
| 6.093 | 5.294 |
| 6.094 | 5.297 |
| 6.095 | 5.301 |
| 6.096 | 5.304 |
| 6.097 | 5.307 |
| 6.098 | 5.311 |
| 6.099 | 5.314 |
| 6.1 | 5.317 |
| 6.101 | 5.321 |
| 6.102 | 5.324 |
| 6.103 | 5.327 |
| 6.104 | 5.331 |
| 6.105 | 5.334 |
| 6.106 | 5.338 |
| 6.107 | 5.341 |
| 6.108 | 5.344 |
| 6.109 | 5.348 |
| 6.11 | 5.351 |
| 6.111 | 5.354 |
| 6.112 | 5.358 |
| 6.113 | 5.361 |
| 6.114 | 5.364 |
| 6.115 | 5.368 |
| 6.116 | 5.371 |
| 6.117 | 5.374 |
| 6.118 | 5.378 |
| 6.119 | 5.381 |
| 6.12 | 5.385 |
| 6.121 | 5.388 |
| 6.122 | 5.391 |
| 6.123 | 5.395 |
| 6.124 | 5.398 |
| 6.125 | 5.401 |
| 6.126 | 5.405 |
| 6.127 | 5.408 |
| 6.128 | 5.411 |
| 6.129 | 5.415 |
| 6.13 | 5.418 |
| 6.131 | 5.422 |
| 6.132 | 5.425 |
| 6.133 | 5.428 |
| 6.134 | 5.432 |
| 6.135 | 5.435 |
| 6.136 | 5.438 |
| 6.137 | 5.442 |
| 6.138 | 5.445 |
| 6.139 | 5.449 |
| 6.14 | 5.452 |
| 6.141 | 5.455 |
| 6.142 | 5.459 |
| 6.143 | 5.462 |
| 6.144 | 5.466 |
| 6.145 | 5.469 |
| 6.146 | 5.472 |
| 6.147 | 5.476 |
| 6.148 | 5.479 |
| 6.149 | 5.482 |
| 6.15 | 5.486 |
| 6.151 | 5.489 |
| 6.152 | 5.493 |
| 6.153 | 5.496 |
| 6.154 | 5.499 |
| 6.155 | 5.503 |
| 6.156 | 5.506 |
| 6.157 | 5.51 |
| 6.158 | 5.513 |
| 6.159 | 5.516 |
| 6.16 | 5.52 |
| 6.161 | 5.523 |
| 6.162 | 5.527 |
| 6.163 | 5.53 |
| 6.164 | 5.533 |
| 6.165 | 5.537 |
| 6.166 | 5.54 |
| 6.167 | 5.544 |
| 6.168 | 5.547 |
| 6.169 | 5.55 |
| 6.17 | 5.554 |
| 6.171 | 5.557 |
| 6.172 | 5.561 |
| 6.173 | 5.564 |
| 6.174 | 5.568 |
| 6.175 | 5.571 |
| 6.176 | 5.574 |
| 6.177 | 5.578 |
| 6.178 | 5.581 |
| 6.179 | 5.585 |
| 6.18 | 5.588 |
| 6.181 | 5.591 |
| 6.182 | 5.595 |
| 6.183 | 5.598 |
| 6.184 | 5.602 |
| 6.185 | 5.605 |
| 6.186 | 5.609 |
| 6.187 | 5.612 |
| 6.188 | 5.615 |
| 6.189 | 5.619 |
| 6.19 | 5.622 |
| 6.191 | 5.626 |
| 6.192 | 5.629 |
| 6.193 | 5.633 |
| 6.194 | 5.636 |
| 6.195 | 5.639 |
| 6.196 | 5.643 |
| 6.197 | 5.646 |
| 6.198 | 5.65 |
| 6.199 | 5.653 |
| 6.2 | 5.657 |
| 6.201 | 5.66 |
| 6.202 | 5.664 |
| 6.203 | 5.667 |
| 6.204 | 5.67 |
| 6.205 | 5.674 |
| 6.206 | 5.677 |
| 6.207 | 5.681 |
| 6.208 | 5.684 |
| 6.209 | 5.688 |
| 6.21 | 5.691 |
| 6.211 | 5.695 |
| 6.212 | 5.698 |
| 6.213 | 5.701 |
| 6.214 | 5.705 |
| 6.215 | 5.708 |
| 6.216 | 5.712 |
| 6.217 | 5.715 |
| 6.218 | 5.719 |
| 6.219 | 5.722 |
| 6.22 | 5.726 |
| 6.221 | 5.729 |
| 6.222 | 5.733 |
| 6.223 | 5.736 |
| 6.224 | 5.739 |
| 6.225 | 5.743 |
| 6.226 | 5.746 |
| 6.227 | 5.75 |
| 6.228 | 5.753 |
| 6.229 | 5.757 |
| 6.23 | 5.76 |
| 6.231 | 5.764 |
| 6.232 | 5.767 |
| 6.233 | 5.771 |
| 6.234 | 5.774 |
| 6.235 | 5.778 |
| 6.236 | 5.781 |
| 6.237 | 5.785 |
| 6.238 | 5.788 |
| 6.239 | 5.791 |
| 6.24 | 5.795 |
| 6.241 | 5.798 |
| 6.242 | 5.802 |
| 6.243 | 5.805 |
| 6.244 | 5.809 |
| 6.245 | 5.812 |
| 6.246 | 5.816 |
| 6.247 | 5.819 |
| 6.248 | 5.823 |
| 6.249 | 5.826 |
| 6.25 | 5.83 |
| 6.251 | 5.833 |
| 6.252 | 5.837 |
| 6.253 | 5.84 |
| 6.254 | 5.844 |
| 6.255 | 5.847 |
| 6.256 | 5.851 |
| 6.257 | 5.854 |
| 6.258 | 5.858 |
| 6.259 | 5.861 |
| 6.26 | 5.865 |
| 6.261 | 5.868 |
| 6.262 | 5.872 |
| 6.263 | 5.875 |
| 6.264 | 5.879 |
| 6.265 | 5.882 |
| 6.266 | 5.886 |
| 6.267 | 5.889 |
| 6.268 | 5.893 |
| 6.269 | 5.896 |
| 6.27 | 5.9 |
| 6.271 | 5.903 |
| 6.272 | 5.907 |
| 6.273 | 5.91 |
| 6.274 | 5.914 |
| 6.275 | 5.917 |
| 6.276 | 5.921 |
| 6.277 | 5.924 |
| 6.278 | 5.928 |
| 6.279 | 5.931 |
| 6.28 | 5.935 |
| 6.281 | 5.938 |
| 6.282 | 5.942 |
| 6.283 | 5.945 |
| 6.284 | 5.949 |
| 6.285 | 5.952 |
| 6.286 | 5.956 |
| 6.287 | 5.959 |
| 6.288 | 5.963 |
| 6.289 | 5.966 |
| 6.29 | 5.97 |
| 6.291 | 5.974 |
| 6.292 | 5.977 |
| 6.293 | 5.981 |
| 6.294 | 5.984 |
| 6.295 | 5.988 |
| 6.296 | 5.991 |
| 6.297 | 5.995 |
| 6.298 | 5.998 |
| 6.299 | 6.002 |
| 6.3 | 6.005 |
| 6.301 | 6.009 |
| 6.302 | 6.012 |
| 6.303 | 6.016 |
| 6.304 | 6.019 |
| 6.305 | 6.023 |
| 6.306 | 6.027 |
| 6.307 | 6.03 |
| 6.308 | 6.034 |
| 6.309 | 6.037 |
| 6.31 | 6.041 |
| 6.311 | 6.044 |
| 6.312 | 6.048 |
| 6.313 | 6.051 |
| 6.314 | 6.055 |
| 6.315 | 6.058 |
| 6.316 | 6.062 |
| 6.317 | 6.066 |
| 6.318 | 6.069 |
| 6.319 | 6.073 |
| 6.32 | 6.076 |
| 6.321 | 6.08 |
| 6.322 | 6.083 |
| 6.323 | 6.087 |
| 6.324 | 6.09 |
| 6.325 | 6.094 |
| 6.326 | 6.098 |
| 6.327 | 6.101 |
| 6.328 | 6.105 |
| 6.329 | 6.108 |
| 6.33 | 6.112 |
| 6.331 | 6.115 |
| 6.332 | 6.119 |
| 6.333 | 6.122 |
| 6.334 | 6.126 |
| 6.335 | 6.13 |
| 6.336 | 6.133 |
| 6.337 | 6.137 |
| 6.338 | 6.14 |
| 6.339 | 6.144 |
| 6.34 | 6.147 |
| 6.341 | 6.151 |
| 6.342 | 6.155 |
| 6.343 | 6.158 |
| 6.344 | 6.162 |
| 6.345 | 6.165 |
| 6.346 | 6.169 |
| 6.347 | 6.172 |
| 6.348 | 6.176 |
| 6.349 | 6.18 |
| 6.35 | 6.183 |
| 6.351 | 6.187 |
| 6.352 | 6.19 |
| 6.353 | 6.194 |
| 6.354 | 6.198 |
| 6.355 | 6.201 |
| 6.356 | 6.205 |
| 6.357 | 6.208 |
| 6.358 | 6.212 |
| 6.359 | 6.216 |
| 6.36 | 6.219 |
| 6.361 | 6.223 |
| 6.362 | 6.226 |
| 6.363 | 6.23 |
| 6.364 | 6.233 |
| 6.365 | 6.237 |
| 6.366 | 6.241 |
| 6.367 | 6.244 |
| 6.368 | 6.248 |
| 6.369 | 6.251 |
| 6.37 | 6.255 |
| 6.371 | 6.259 |
| 6.372 | 6.262 |
| 6.373 | 6.266 |
| 6.374 | 6.27 |
| 6.375 | 6.273 |
| 6.376 | 6.277 |
| 6.377 | 6.28 |
| 6.378 | 6.284 |
| 6.379 | 6.288 |
| 6.38 | 6.291 |
| 6.381 | 6.295 |
| 6.382 | 6.298 |
| 6.383 | 6.302 |
| 6.384 | 6.306 |
| 6.385 | 6.309 |
| 6.386 | 6.313 |
| 6.387 | 6.316 |
| 6.388 | 6.32 |
| 6.389 | 6.324 |
| 6.39 | 6.327 |
| 6.391 | 6.331 |
| 6.392 | 6.335 |
| 6.393 | 6.338 |
| 6.394 | 6.342 |
| 6.395 | 6.345 |
| 6.396 | 6.349 |
| 6.397 | 6.353 |
| 6.398 | 6.356 |
| 6.399 | 6.36 |
| 6.4 | 6.364 |
| 6.401 | 6.367 |
| 6.402 | 6.371 |
| 6.403 | 6.374 |
| 6.404 | 6.378 |
| 6.405 | 6.382 |
| 6.406 | 6.385 |
| 6.407 | 6.389 |
| 6.408 | 6.393 |
| 6.409 | 6.396 |
| 6.41 | 6.4 |
| 6.411 | 6.404 |
| 6.412 | 6.407 |
| 6.413 | 6.411 |
| 6.414 | 6.415 |
| 6.415 | 6.418 |
| 6.416 | 6.422 |
| 6.417 | 6.425 |
| 6.418 | 6.429 |
| 6.419 | 6.433 |
| 6.42 | 6.436 |
| 6.421 | 6.44 |
| 6.422 | 6.444 |
| 6.423 | 6.447 |
| 6.424 | 6.451 |
| 6.425 | 6.455 |
| 6.426 | 6.458 |
| 6.427 | 6.462 |
| 6.428 | 6.466 |
| 6.429 | 6.469 |
| 6.43 | 6.473 |
| 6.431 | 6.477 |
| 6.432 | 6.48 |
| 6.433 | 6.484 |
| 6.434 | 6.488 |
| 6.435 | 6.491 |
| 6.436 | 6.495 |
| 6.437 | 6.499 |
| 6.438 | 6.502 |
| 6.439 | 6.506 |
| 6.44 | 6.51 |
| 6.441 | 6.513 |
| 6.442 | 6.517 |
| 6.443 | 6.521 |
| 6.444 | 6.524 |
| 6.445 | 6.528 |
| 6.446 | 6.532 |
| 6.447 | 6.535 |
| 6.448 | 6.539 |
| 6.449 | 6.543 |
| 6.45 | 6.546 |
| 6.451 | 6.55 |
| 6.452 | 6.554 |
| 6.453 | 6.558 |
| 6.454 | 6.561 |
| 6.455 | 6.565 |
| 6.456 | 6.569 |
| 6.457 | 6.572 |
| 6.458 | 6.576 |
| 6.459 | 6.58 |
| 6.46 | 6.583 |
| 6.461 | 6.587 |
| 6.462 | 6.591 |
| 6.463 | 6.594 |
| 6.464 | 6.598 |
| 6.465 | 6.602 |
| 6.466 | 6.606 |
| 6.467 | 6.609 |
| 6.468 | 6.613 |
| 6.469 | 6.617 |
| 6.47 | 6.62 |
| 6.471 | 6.624 |
| 6.472 | 6.628 |
| 6.473 | 6.631 |
| 6.474 | 6.635 |
| 6.475 | 6.639 |
| 6.476 | 6.643 |
| 6.477 | 6.646 |
| 6.478 | 6.65 |
| 6.479 | 6.654 |
| 6.48 | 6.657 |
| 6.481 | 6.661 |
| 6.482 | 6.665 |
| 6.483 | 6.669 |
| 6.484 | 6.672 |
| 6.485 | 6.676 |
| 6.486 | 6.68 |
| 6.487 | 6.683 |
| 6.488 | 6.687 |
| 6.489 | 6.691 |
| 6.49 | 6.695 |
| 6.491 | 6.698 |
| 6.492 | 6.702 |
| 6.493 | 6.706 |
| 6.494 | 6.709 |
| 6.495 | 6.713 |
| 6.496 | 6.717 |
| 6.497 | 6.721 |
| 6.498 | 6.724 |
| 6.499 | 6.728 |
| 6.5 | 6.732 |
| 6.501 | 6.736 |
| 6.502 | 6.739 |
| 6.503 | 6.743 |
| 6.504 | 6.747 |
| 6.505 | 6.75 |
| 6.506 | 6.754 |
| 6.507 | 6.758 |
| 6.508 | 6.762 |
| 6.509 | 6.765 |
| 6.51 | 6.769 |
| 6.511 | 6.773 |
| 6.512 | 6.777 |
| 6.513 | 6.78 |
| 6.514 | 6.784 |
| 6.515 | 6.788 |
| 6.516 | 6.792 |
| 6.517 | 6.795 |
| 6.518 | 6.799 |
| 6.519 | 6.803 |
| 6.52 | 6.807 |
| 6.521 | 6.81 |
| 6.522 | 6.814 |
| 6.523 | 6.818 |
| 6.524 | 6.822 |
| 6.525 | 6.825 |
| 6.526 | 6.829 |
| 6.527 | 6.833 |
| 6.528 | 6.837 |
| 6.529 | 6.841 |
| 6.53 | 6.844 |
| 6.531 | 6.848 |
| 6.532 | 6.852 |
| 6.533 | 6.856 |
| 6.534 | 6.859 |
| 6.535 | 6.863 |
| 6.536 | 6.867 |
| 6.537 | 6.871 |
| 6.538 | 6.874 |
| 6.539 | 6.878 |
| 6.54 | 6.882 |
| 6.541 | 6.886 |
| 6.542 | 6.89 |
| 6.543 | 6.893 |
| 6.544 | 6.897 |
| 6.545 | 6.901 |
| 6.546 | 6.905 |
| 6.547 | 6.908 |
| 6.548 | 6.912 |
| 6.549 | 6.916 |
| 6.55 | 6.92 |
| 6.551 | 6.924 |
| 6.552 | 6.927 |
| 6.553 | 6.931 |
| 6.554 | 6.935 |
| 6.555 | 6.939 |
| 6.556 | 6.942 |
| 6.557 | 6.946 |
| 6.558 | 6.95 |
| 6.559 | 6.954 |
| 6.56 | 6.958 |
| 6.561 | 6.961 |
| 6.562 | 6.965 |
| 6.563 | 6.969 |
| 6.564 | 6.973 |
| 6.565 | 6.977 |
| 6.566 | 6.98 |
| 6.567 | 6.984 |
| 6.568 | 6.988 |
| 6.569 | 6.992 |
| 6.57 | 6.996 |
| 6.571 | 6.999 |
| 6.572 | 7.003 |
| 6.573 | 7.007 |
| 6.574 | 7.011 |
| 6.575 | 7.015 |
| 6.576 | 7.018 |
| 6.577 | 7.022 |
| 6.578 | 7.026 |
| 6.579 | 7.03 |
| 6.58 | 7.034 |
| 6.581 | 7.038 |
| 6.582 | 7.041 |
| 6.583 | 7.045 |
| 6.584 | 7.049 |
| 6.585 | 7.053 |
| 6.586 | 7.057 |
| 6.587 | 7.06 |
| 6.588 | 7.064 |
| 6.589 | 7.068 |
| 6.59 | 7.072 |
| 6.591 | 7.076 |
| 6.592 | 7.08 |
| 6.593 | 7.083 |
| 6.594 | 7.087 |
| 6.595 | 7.091 |
| 6.596 | 7.095 |
| 6.597 | 7.099 |
| 6.598 | 7.103 |
| 6.599 | 7.106 |
| 6.6 | 7.11 |
| 6.601 | 7.114 |
| 6.602 | 7.118 |
| 6.603 | 7.122 |
| 6.604 | 7.126 |
| 6.605 | 7.129 |
| 6.606 | 7.133 |
| 6.607 | 7.137 |
| 6.608 | 7.141 |
| 6.609 | 7.145 |
| 6.61 | 7.149 |
| 6.611 | 7.153 |
| 6.612 | 7.156 |
| 6.613 | 7.16 |
| 6.614 | 7.164 |
| 6.615 | 7.168 |
| 6.616 | 7.172 |
| 6.617 | 7.176 |
| 6.618 | 7.179 |
| 6.619 | 7.183 |
| 6.62 | 7.187 |
| 6.621 | 7.191 |
| 6.622 | 7.195 |
| 6.623 | 7.199 |
| 6.624 | 7.203 |
| 6.625 | 7.207 |
| 6.626 | 7.21 |
| 6.627 | 7.214 |
| 6.628 | 7.218 |
| 6.629 | 7.222 |
| 6.63 | 7.226 |
| 6.631 | 7.23 |
| 6.632 | 7.234 |
| 6.633 | 7.237 |
| 6.634 | 7.241 |
| 6.635 | 7.245 |
| 6.636 | 7.249 |
| 6.637 | 7.253 |
| 6.638 | 7.257 |
| 6.639 | 7.261 |
| 6.64 | 7.265 |
| 6.641 | 7.268 |
| 6.642 | 7.272 |
| 6.643 | 7.276 |
| 6.644 | 7.28 |
| 6.645 | 7.284 |
| 6.646 | 7.288 |
| 6.647 | 7.292 |
| 6.648 | 7.296 |
| 6.649 | 7.3 |
| 6.65 | 7.303 |
| 6.651 | 7.307 |
| 6.652 | 7.311 |
| 6.653 | 7.315 |
| 6.654 | 7.319 |
| 6.655 | 7.323 |
| 6.656 | 7.327 |
| 6.657 | 7.331 |
| 6.658 | 7.335 |
| 6.659 | 7.338 |
| 6.66 | 7.342 |
| 6.661 | 7.346 |
| 6.662 | 7.35 |
| 6.663 | 7.354 |
| 6.664 | 7.358 |
| 6.665 | 7.362 |
| 6.666 | 7.366 |
| 6.667 | 7.37 |
| 6.668 | 7.374 |
| 6.669 | 7.378 |
| 6.67 | 7.381 |
| 6.671 | 7.385 |
| 6.672 | 7.389 |
| 6.673 | 7.393 |
| 6.674 | 7.397 |
| 6.675 | 7.401 |
| 6.676 | 7.405 |
| 6.677 | 7.409 |
| 6.678 | 7.413 |
| 6.679 | 7.417 |
| 6.68 | 7.421 |
| 6.681 | 7.424 |
| 6.682 | 7.428 |
| 6.683 | 7.432 |
| 6.684 | 7.436 |
| 6.685 | 7.44 |
| 6.686 | 7.444 |
| 6.687 | 7.448 |
| 6.688 | 7.452 |
| 6.689 | 7.456 |
| 6.69 | 7.46 |
| 6.691 | 7.464 |
| 6.692 | 7.468 |
| 6.693 | 7.472 |
| 6.694 | 7.476 |
| 6.695 | 7.48 |
| 6.696 | 7.483 |
| 6.697 | 7.487 |
| 6.698 | 7.491 |
| 6.699 | 7.495 |
| 6.7 | 7.499 |
| 6.701 | 7.503 |
| 6.702 | 7.507 |
| 6.703 | 7.511 |
| 6.704 | 7.515 |
| 6.705 | 7.519 |
| 6.706 | 7.523 |
| 6.707 | 7.527 |
| 6.708 | 7.531 |
| 6.709 | 7.535 |
| 6.71 | 7.539 |
| 6.711 | 7.543 |
| 6.712 | 7.547 |
| 6.713 | 7.551 |
| 6.714 | 7.555 |
| 6.715 | 7.558 |
| 6.716 | 7.562 |
| 6.717 | 7.566 |
| 6.718 | 7.57 |
| 6.719 | 7.574 |
| 6.72 | 7.578 |
| 6.721 | 7.582 |
| 6.722 | 7.586 |
| 6.723 | 7.59 |
| 6.724 | 7.594 |
| 6.725 | 7.598 |
| 6.726 | 7.602 |
| 6.727 | 7.606 |
| 6.728 | 7.61 |
| 6.729 | 7.614 |
| 6.73 | 7.618 |
| 6.731 | 7.622 |
| 6.732 | 7.626 |
| 6.733 | 7.63 |
| 6.734 | 7.634 |
| 6.735 | 7.638 |
| 6.736 | 7.642 |
| 6.737 | 7.646 |
| 6.738 | 7.65 |
| 6.739 | 7.654 |
| 6.74 | 7.658 |
| 6.741 | 7.662 |
| 6.742 | 7.666 |
| 6.743 | 7.67 |
| 6.744 | 7.674 |
| 6.745 | 7.678 |
| 6.746 | 7.682 |
| 6.747 | 7.686 |
| 6.748 | 7.69 |
| 6.749 | 7.694 |
| 6.75 | 7.698 |
| 6.751 | 7.702 |
| 6.752 | 7.706 |
| 6.753 | 7.71 |
| 6.754 | 7.714 |
| 6.755 | 7.718 |
| 6.756 | 7.722 |
| 6.757 | 7.726 |
| 6.758 | 7.73 |
| 6.759 | 7.734 |
| 6.76 | 7.738 |
| 6.761 | 7.742 |
| 6.762 | 7.746 |
| 6.763 | 7.75 |
| 6.764 | 7.754 |
| 6.765 | 7.758 |
| 6.766 | 7.762 |
| 6.767 | 7.766 |
| 6.768 | 7.77 |
| 6.769 | 7.774 |
| 6.77 | 7.778 |
| 6.771 | 7.782 |
| 6.772 | 7.786 |
| 6.773 | 7.79 |
| 6.774 | 7.794 |
| 6.775 | 7.798 |
| 6.776 | 7.802 |
| 6.777 | 7.806 |
| 6.778 | 7.81 |
| 6.779 | 7.814 |
| 6.78 | 7.818 |
| 6.781 | 7.822 |
| 6.782 | 7.826 |
| 6.783 | 7.83 |
| 6.784 | 7.834 |
| 6.785 | 7.838 |
| 6.786 | 7.842 |
| 6.787 | 7.846 |
| 6.788 | 7.85 |
| 6.789 | 7.854 |
| 6.79 | 7.859 |
| 6.791 | 7.863 |
| 6.792 | 7.867 |
| 6.793 | 7.871 |
| 6.794 | 7.875 |
| 6.795 | 7.879 |
| 6.796 | 7.883 |
| 6.797 | 7.887 |
| 6.798 | 7.891 |
| 6.799 | 7.895 |
| 6.8 | 7.899 |
| 6.801 | 7.903 |
| 6.802 | 7.907 |
| 6.803 | 7.911 |
| 6.804 | 7.915 |
| 6.805 | 7.919 |
| 6.806 | 7.923 |
| 6.807 | 7.927 |
| 6.808 | 7.931 |
| 6.809 | 7.936 |
| 6.81 | 7.94 |
| 6.811 | 7.944 |
| 6.812 | 7.948 |
| 6.813 | 7.952 |
| 6.814 | 7.956 |
| 6.815 | 7.96 |
| 6.816 | 7.964 |
| 6.817 | 7.968 |
| 6.818 | 7.972 |
| 6.819 | 7.976 |
| 6.82 | 7.98 |
| 6.821 | 7.984 |
| 6.822 | 7.988 |
| 6.823 | 7.992 |
| 6.824 | 7.997 |
| 6.825 | 8.001 |
| 6.826 | 8.005 |
| 6.827 | 8.009 |
| 6.828 | 8.013 |
| 6.829 | 8.017 |
| 6.83 | 8.021 |
| 6.831 | 8.025 |
| 6.832 | 8.029 |
| 6.833 | 8.033 |
| 6.834 | 8.037 |
| 6.835 | 8.042 |
| 6.836 | 8.046 |
| 6.837 | 8.05 |
| 6.838 | 8.054 |
| 6.839 | 8.058 |
| 6.84 | 8.062 |
| 6.841 | 8.066 |
| 6.842 | 8.07 |
| 6.843 | 8.074 |
| 6.844 | 8.078 |
| 6.845 | 8.082 |
| 6.846 | 8.087 |
| 6.847 | 8.091 |
| 6.848 | 8.095 |
| 6.849 | 8.099 |
| 6.85 | 8.103 |
| 6.851 | 8.107 |
| 6.852 | 8.111 |
| 6.853 | 8.115 |
| 6.854 | 8.119 |
| 6.855 | 8.124 |
| 6.856 | 8.128 |
| 6.857 | 8.132 |
| 6.858 | 8.136 |
| 6.859 | 8.14 |
| 6.86 | 8.144 |
| 6.861 | 8.148 |
| 6.862 | 8.152 |
| 6.863 | 8.157 |
| 6.864 | 8.161 |
| 6.865 | 8.165 |
| 6.866 | 8.169 |
| 6.867 | 8.173 |
| 6.868 | 8.177 |
| 6.869 | 8.181 |
| 6.87 | 8.185 |
| 6.871 | 8.19 |
| 6.872 | 8.194 |
| 6.873 | 8.198 |
| 6.874 | 8.202 |
| 6.875 | 8.206 |
| 6.876 | 8.21 |
| 6.877 | 8.214 |
| 6.878 | 8.219 |
| 6.879 | 8.223 |
| 6.88 | 8.227 |
| 6.881 | 8.231 |
| 6.882 | 8.235 |
| 6.883 | 8.239 |
| 6.884 | 8.243 |
| 6.885 | 8.248 |
| 6.886 | 8.252 |
| 6.887 | 8.256 |
| 6.888 | 8.26 |
| 6.889 | 8.264 |
| 6.89 | 8.268 |
| 6.891 | 8.272 |
| 6.892 | 8.277 |
| 6.893 | 8.281 |
| 6.894 | 8.285 |
| 6.895 | 8.289 |
| 6.896 | 8.293 |
| 6.897 | 8.297 |
| 6.898 | 8.302 |
| 6.899 | 8.306 |
| 6.9 | 8.31 |
| 6.901 | 8.314 |
| 6.902 | 8.318 |
| 6.903 | 8.322 |
| 6.904 | 8.327 |
| 6.905 | 8.331 |
| 6.906 | 8.335 |
| 6.907 | 8.339 |
| 6.908 | 8.343 |
| 6.909 | 8.347 |
| 6.91 | 8.352 |
| 6.911 | 8.356 |
| 6.912 | 8.36 |
| 6.913 | 8.364 |
| 6.914 | 8.368 |
| 6.915 | 8.372 |
| 6.916 | 8.377 |
| 6.917 | 8.381 |
| 6.918 | 8.385 |
| 6.919 | 8.389 |
| 6.92 | 8.393 |
| 6.921 | 8.398 |
| 6.922 | 8.402 |
| 6.923 | 8.406 |
| 6.924 | 8.41 |
| 6.925 | 8.414 |
| 6.926 | 8.419 |
| 6.927 | 8.423 |
| 6.928 | 8.427 |
| 6.929 | 8.431 |
| 6.93 | 8.435 |
| 6.931 | 8.44 |
| 6.932 | 8.444 |
| 6.933 | 8.448 |
| 6.934 | 8.452 |
| 6.935 | 8.456 |
| 6.936 | 8.461 |
| 6.937 | 8.465 |
| 6.938 | 8.469 |
| 6.939 | 8.473 |
| 6.94 | 8.477 |
| 6.941 | 8.482 |
| 6.942 | 8.486 |
| 6.943 | 8.49 |
| 6.944 | 8.494 |
| 6.945 | 8.499 |
| 6.946 | 8.503 |
| 6.947 | 8.507 |
| 6.948 | 8.511 |
| 6.949 | 8.515 |
| 6.95 | 8.52 |
| 6.951 | 8.524 |
| 6.952 | 8.528 |
| 6.953 | 8.532 |
| 6.954 | 8.537 |
| 6.955 | 8.541 |
| 6.956 | 8.545 |
| 6.957 | 8.549 |
| 6.958 | 8.553 |
| 6.959 | 8.558 |
| 6.96 | 8.562 |
| 6.961 | 8.566 |
| 6.962 | 8.57 |
| 6.963 | 8.575 |
| 6.964 | 8.579 |
| 6.965 | 8.583 |
| 6.966 | 8.587 |
| 6.967 | 8.592 |
| 6.968 | 8.596 |
| 6.969 | 8.6 |
| 6.97 | 8.604 |
| 6.971 | 8.609 |
| 6.972 | 8.613 |
| 6.973 | 8.617 |
| 6.974 | 8.621 |
| 6.975 | 8.626 |
| 6.976 | 8.63 |
| 6.977 | 8.634 |
| 6.978 | 8.638 |
| 6.979 | 8.643 |
| 6.98 | 8.647 |
| 6.981 | 8.651 |
| 6.982 | 8.655 |
| 6.983 | 8.66 |
| 6.984 | 8.664 |
| 6.985 | 8.668 |
| 6.986 | 8.672 |
| 6.987 | 8.677 |
| 6.988 | 8.681 |
| 6.989 | 8.685 |
| 6.99 | 8.69 |
| 6.991 | 8.694 |
| 6.992 | 8.698 |
| 6.993 | 8.702 |
| 6.994 | 8.707 |
| 6.995 | 8.711 |
| 6.996 | 8.715 |
| 6.997 | 8.719 |
| 6.998 | 8.724 |
| 6.999 | 8.728 |
| 7.0 | 8.732 |
| 7.001 | 8.737 |
| 7.002 | 8.741 |
| 7.003 | 8.745 |
| 7.004 | 8.749 |
| 7.005 | 8.754 |
| 7.006 | 8.758 |
| 7.007 | 8.762 |
| 7.008 | 8.767 |
| 7.009 | 8.771 |
| 7.01 | 8.775 |
| 7.011 | 8.779 |
| 7.012 | 8.784 |
| 7.013 | 8.788 |
| 7.014 | 8.792 |
| 7.015 | 8.797 |
| 7.016 | 8.801 |
| 7.017 | 8.805 |
| 7.018 | 8.81 |
| 7.019 | 8.814 |
| 7.02 | 8.818 |
| 7.021 | 8.822 |
| 7.022 | 8.827 |
| 7.023 | 8.831 |
| 7.024 | 8.835 |
| 7.025 | 8.84 |
| 7.026 | 8.844 |
| 7.027 | 8.848 |
| 7.028 | 8.853 |
| 7.029 | 8.857 |
| 7.03 | 8.861 |
| 7.031 | 8.866 |
| 7.032 | 8.87 |
| 7.033 | 8.874 |
| 7.034 | 8.879 |
| 7.035 | 8.883 |
| 7.036 | 8.887 |
| 7.037 | 8.892 |
| 7.038 | 8.896 |
| 7.039 | 8.9 |
| 7.04 | 8.905 |
| 7.041 | 8.909 |
| 7.042 | 8.913 |
| 7.043 | 8.918 |
| 7.044 | 8.922 |
| 7.045 | 8.926 |
| 7.046 | 8.931 |
| 7.047 | 8.935 |
| 7.048 | 8.939 |
| 7.049 | 8.944 |
| 7.05 | 8.948 |
| 7.051 | 8.952 |
| 7.052 | 8.957 |
| 7.053 | 8.961 |
| 7.054 | 8.965 |
| 7.055 | 8.97 |
| 7.056 | 8.974 |
| 7.057 | 8.978 |
| 7.058 | 8.983 |
| 7.059 | 8.987 |
| 7.06 | 8.991 |
| 7.061 | 8.996 |
| 7.062 | 9 |
| 7.063 | 9.004 |
| 7.064 | 9.009 |
| 7.065 | 9.013 |
| 7.066 | 9.018 |
| 7.067 | 9.022 |
| 7.068 | 9.026 |
| 7.069 | 9.031 |
| 7.07 | 9.035 |
| 7.071 | 9.039 |
| 7.072 | 9.044 |
| 7.073 | 9.048 |
| 7.074 | 9.052 |
| 7.075 | 9.057 |
| 7.076 | 9.061 |
| 7.077 | 9.066 |
| 7.078 | 9.07 |
| 7.079 | 9.074 |
| 7.08 | 9.079 |
| 7.081 | 9.083 |
| 7.082 | 9.087 |
| 7.083 | 9.092 |
| 7.084 | 9.096 |
| 7.085 | 9.101 |
| 7.086 | 9.105 |
| 7.087 | 9.109 |
| 7.088 | 9.114 |
| 7.089 | 9.118 |
| 7.09 | 9.123 |
| 7.091 | 9.127 |
| 7.092 | 9.131 |
| 7.093 | 9.136 |
| 7.094 | 9.14 |
| 7.095 | 9.144 |
| 7.096 | 9.149 |
| 7.097 | 9.153 |
| 7.098 | 9.158 |
| 7.099 | 9.162 |
| 7.1 | 9.166 |
| 7.101 | 9.171 |
| 7.102 | 9.175 |
| 7.103 | 9.18 |
| 7.104 | 9.184 |
| 7.105 | 9.189 |
| 7.106 | 9.193 |
| 7.107 | 9.197 |
| 7.108 | 9.202 |
| 7.109 | 9.206 |
| 7.11 | 9.211 |
| 7.111 | 9.215 |
| 7.112 | 9.219 |
| 7.113 | 9.224 |
| 7.114 | 9.228 |
| 7.115 | 9.233 |
| 7.116 | 9.237 |
| 7.117 | 9.242 |
| 7.118 | 9.246 |
| 7.119 | 9.25 |
| 7.12 | 9.255 |
| 7.121 | 9.259 |
| 7.122 | 9.264 |
| 7.123 | 9.268 |
| 7.124 | 9.272 |
| 7.125 | 9.277 |
| 7.126 | 9.281 |
| 7.127 | 9.286 |
| 7.128 | 9.29 |
| 7.129 | 9.295 |
| 7.13 | 9.299 |
| 7.131 | 9.304 |
| 7.132 | 9.308 |
| 7.133 | 9.312 |
| 7.134 | 9.317 |
| 7.135 | 9.321 |
| 7.136 | 9.326 |
| 7.137 | 9.33 |
| 7.138 | 9.335 |
| 7.139 | 9.339 |
| 7.14 | 9.344 |
| 7.141 | 9.348 |
| 7.142 | 9.352 |
| 7.143 | 9.357 |
| 7.144 | 9.361 |
| 7.145 | 9.366 |
| 7.146 | 9.37 |
| 7.147 | 9.375 |
| 7.148 | 9.379 |
| 7.149 | 9.384 |
| 7.15 | 9.388 |
| 7.151 | 9.393 |
| 7.152 | 9.397 |
| 7.153 | 9.402 |
| 7.154 | 9.406 |
| 7.155 | 9.41 |
| 7.156 | 9.415 |
| 7.157 | 9.419 |
| 7.158 | 9.424 |
| 7.159 | 9.428 |
| 7.16 | 9.433 |
| 7.161 | 9.437 |
| 7.162 | 9.442 |
| 7.163 | 9.446 |
| 7.164 | 9.451 |
| 7.165 | 9.455 |
| 7.166 | 9.46 |
| 7.167 | 9.464 |
| 7.168 | 9.469 |
| 7.169 | 9.473 |
| 7.17 | 9.478 |
| 7.171 | 9.482 |
| 7.172 | 9.487 |
| 7.173 | 9.491 |
| 7.174 | 9.496 |
| 7.175 | 9.5 |
| 7.176 | 9.505 |
| 7.177 | 9.509 |
| 7.178 | 9.514 |
| 7.179 | 9.518 |
| 7.18 | 9.523 |
| 7.181 | 9.527 |
| 7.182 | 9.532 |
| 7.183 | 9.536 |
| 7.184 | 9.541 |
| 7.185 | 9.545 |
| 7.186 | 9.55 |
| 7.187 | 9.554 |
| 7.188 | 9.559 |
| 7.189 | 9.563 |
| 7.19 | 9.568 |
| 7.191 | 9.572 |
| 7.192 | 9.577 |
| 7.193 | 9.581 |
| 7.194 | 9.586 |
| 7.195 | 9.59 |
| 7.196 | 9.595 |
| 7.197 | 9.599 |
| 7.198 | 9.604 |
| 7.199 | 9.608 |
| 7.2 | 9.613 |
| 7.201 | 9.617 |
| 7.202 | 9.622 |
| 7.203 | 9.626 |
| 7.204 | 9.631 |
| 7.205 | 9.636 |
| 7.206 | 9.64 |
| 7.207 | 9.645 |
| 7.208 | 9.649 |
| 7.209 | 9.654 |
| 7.21 | 9.658 |
| 7.211 | 9.663 |
| 7.212 | 9.667 |
| 7.213 | 9.672 |
| 7.214 | 9.676 |
| 7.215 | 9.681 |
| 7.216 | 9.685 |
| 7.217 | 9.69 |
| 7.218 | 9.695 |
| 7.219 | 9.699 |
| 7.22 | 9.704 |
| 7.221 | 9.708 |
| 7.222 | 9.713 |
| 7.223 | 9.717 |
| 7.224 | 9.722 |
| 7.225 | 9.726 |
| 7.226 | 9.731 |
| 7.227 | 9.736 |
| 7.228 | 9.74 |
| 7.229 | 9.745 |
| 7.23 | 9.749 |
| 7.231 | 9.754 |
| 7.232 | 9.758 |
| 7.233 | 9.763 |
| 7.234 | 9.768 |
| 7.235 | 9.772 |
| 7.236 | 9.777 |
| 7.237 | 9.781 |
| 7.238 | 9.786 |
| 7.239 | 9.79 |
| 7.24 | 9.795 |
| 7.241 | 9.8 |
| 7.242 | 9.804 |
| 7.243 | 9.809 |
| 7.244 | 9.813 |
| 7.245 | 9.818 |
| 7.246 | 9.822 |
| 7.247 | 9.827 |
| 7.248 | 9.832 |
| 7.249 | 9.836 |
| 7.25 | 9.841 |
| 7.251 | 9.845 |
| 7.252 | 9.85 |
| 7.253 | 9.855 |
| 7.254 | 9.859 |
| 7.255 | 9.864 |
| 7.256 | 9.868 |
| 7.257 | 9.873 |
| 7.258 | 9.878 |
| 7.259 | 9.882 |
| 7.26 | 9.887 |
| 7.261 | 9.891 |
| 7.262 | 9.896 |
| 7.263 | 9.901 |
| 7.264 | 9.905 |
| 7.265 | 9.91 |
| 7.266 | 9.914 |
| 7.267 | 9.919 |
| 7.268 | 9.924 |
| 7.269 | 9.928 |
| 7.27 | 9.933 |
| 7.271 | 9.937 |
| 7.272 | 9.942 |
| 7.273 | 9.947 |
| 7.274 | 9.951 |
| 7.275 | 9.956 |
| 7.276 | 9.961 |
| 7.277 | 9.965 |
| 7.278 | 9.97 |
| 7.279 | 9.974 |
| 7.28 | 9.979 |
| 7.281 | 9.984 |
| 7.282 | 9.988 |
| 7.283 | 9.993 |
| 7.284 | 9.998 |
| 7.285 | 10.002 |
| 7.286 | 10.007 |
| 7.287 | 10.012 |
| 7.288 | 10.016 |
| 7.289 | 10.021 |
| 7.29 | 10.025 |
| 7.291 | 10.03 |
| 7.292 | 10.035 |
| 7.293 | 10.039 |
| 7.294 | 10.044 |
| 7.295 | 10.049 |
| 7.296 | 10.053 |
| 7.297 | 10.058 |
| 7.298 | 10.063 |
| 7.299 | 10.067 |
| 7.3 | 10.072 |
| 7.301 | 10.077 |
| 7.302 | 10.081 |
| 7.303 | 10.086 |
| 7.304 | 10.091 |
| 7.305 | 10.095 |
| 7.306 | 10.1 |
| 7.307 | 10.105 |
| 7.308 | 10.109 |
| 7.309 | 10.114 |
| 7.31 | 10.119 |
| 7.311 | 10.123 |
| 7.312 | 10.128 |
| 7.313 | 10.133 |
| 7.314 | 10.137 |
| 7.315 | 10.142 |
| 7.316 | 10.147 |
| 7.317 | 10.151 |
| 7.318 | 10.156 |
| 7.319 | 10.161 |
| 7.32 | 10.165 |
| 7.321 | 10.17 |
| 7.322 | 10.175 |
| 7.323 | 10.179 |
| 7.324 | 10.184 |
| 7.325 | 10.189 |
| 7.326 | 10.193 |
| 7.327 | 10.198 |
| 7.328 | 10.203 |
| 7.329 | 10.207 |
| 7.33 | 10.212 |
| 7.331 | 10.217 |
| 7.332 | 10.222 |
| 7.333 | 10.226 |
| 7.334 | 10.231 |
| 7.335 | 10.236 |
| 7.336 | 10.24 |
| 7.337 | 10.245 |
| 7.338 | 10.25 |
| 7.339 | 10.254 |
| 7.34 | 10.259 |
| 7.341 | 10.264 |
| 7.342 | 10.269 |
| 7.343 | 10.273 |
| 7.344 | 10.278 |
| 7.345 | 10.283 |
| 7.346 | 10.287 |
| 7.347 | 10.292 |
| 7.348 | 10.297 |
| 7.349 | 10.302 |
| 7.35 | 10.306 |
| 7.351 | 10.311 |
| 7.352 | 10.316 |
| 7.353 | 10.32 |
| 7.354 | 10.325 |
| 7.355 | 10.33 |
| 7.356 | 10.335 |
| 7.357 | 10.339 |
| 7.358 | 10.344 |
| 7.359 | 10.349 |
| 7.36 | 10.354 |
| 7.361 | 10.358 |
| 7.362 | 10.363 |
| 7.363 | 10.368 |
| 7.364 | 10.372 |
| 7.365 | 10.377 |
| 7.366 | 10.382 |
| 7.367 | 10.387 |
| 7.368 | 10.391 |
| 7.369 | 10.396 |
| 7.37 | 10.401 |
| 7.371 | 10.406 |
| 7.372 | 10.41 |
| 7.373 | 10.415 |
| 7.374 | 10.42 |
| 7.375 | 10.425 |
| 7.376 | 10.429 |
| 7.377 | 10.434 |
| 7.378 | 10.439 |
| 7.379 | 10.444 |
| 7.38 | 10.448 |
| 7.381 | 10.453 |
| 7.382 | 10.458 |
| 7.383 | 10.463 |
| 7.384 | 10.468 |
| 7.385 | 10.472 |
| 7.386 | 10.477 |
| 7.387 | 10.482 |
| 7.388 | 10.487 |
| 7.389 | 10.491 |
| 7.39 | 10.496 |
| 7.391 | 10.501 |
| 7.392 | 10.506 |
| 7.393 | 10.51 |
| 7.394 | 10.515 |
| 7.395 | 10.52 |
| 7.396 | 10.525 |
| 7.397 | 10.53 |
| 7.398 | 10.534 |
| 7.399 | 10.539 |
| 7.4 | 10.544 |
| 7.401 | 10.549 |
| 7.402 | 10.554 |
| 7.403 | 10.558 |
| 7.404 | 10.563 |
| 7.405 | 10.568 |
| 7.406 | 10.573 |
| 7.407 | 10.577 |
| 7.408 | 10.582 |
| 7.409 | 10.587 |
| 7.41 | 10.592 |
| 7.411 | 10.597 |
| 7.412 | 10.601 |
| 7.413 | 10.606 |
| 7.414 | 10.611 |
| 7.415 | 10.616 |
| 7.416 | 10.621 |
| 7.417 | 10.625 |
| 7.418 | 10.63 |
| 7.419 | 10.635 |
| 7.42 | 10.64 |
| 7.421 | 10.645 |
| 7.422 | 10.65 |
| 7.423 | 10.654 |
| 7.424 | 10.659 |
| 7.425 | 10.664 |
| 7.426 | 10.669 |
| 7.427 | 10.674 |
| 7.428 | 10.678 |
| 7.429 | 10.683 |
| 7.43 | 10.688 |
| 7.431 | 10.693 |
| 7.432 | 10.698 |
| 7.433 | 10.703 |
| 7.434 | 10.707 |
| 7.435 | 10.712 |
| 7.436 | 10.717 |
| 7.437 | 10.722 |
| 7.438 | 10.727 |
| 7.439 | 10.732 |
| 7.44 | 10.736 |
| 7.441 | 10.741 |
| 7.442 | 10.746 |
| 7.443 | 10.751 |
| 7.444 | 10.756 |
| 7.445 | 10.761 |
| 7.446 | 10.766 |
| 7.447 | 10.77 |
| 7.448 | 10.775 |
| 7.449 | 10.78 |
| 7.45 | 10.785 |
| 7.451 | 10.79 |
| 7.452 | 10.795 |
| 7.453 | 10.8 |
| 7.454 | 10.804 |
| 7.455 | 10.809 |
| 7.456 | 10.814 |
| 7.457 | 10.819 |
| 7.458 | 10.824 |
| 7.459 | 10.829 |
| 7.46 | 10.834 |
| 7.461 | 10.838 |
| 7.462 | 10.843 |
| 7.463 | 10.848 |
| 7.464 | 10.853 |
| 7.465 | 10.858 |
| 7.466 | 10.863 |
| 7.467 | 10.868 |
| 7.468 | 10.873 |
| 7.469 | 10.877 |
| 7.47 | 10.882 |
| 7.471 | 10.887 |
| 7.472 | 10.892 |
| 7.473 | 10.897 |
| 7.474 | 10.902 |
| 7.475 | 10.907 |
| 7.476 | 10.912 |
| 7.477 | 10.916 |
| 7.478 | 10.921 |
| 7.479 | 10.926 |
| 7.48 | 10.931 |
| 7.481 | 10.936 |
| 7.482 | 10.941 |
| 7.483 | 10.946 |
| 7.484 | 10.951 |
| 7.485 | 10.956 |
| 7.486 | 10.961 |
| 7.487 | 10.965 |
| 7.488 | 10.97 |
| 7.489 | 10.975 |
| 7.49 | 10.98 |
| 7.491 | 10.985 |
| 7.492 | 10.99 |
| 7.493 | 10.995 |
| 7.494 | 11 |
| 7.495 | 11.005 |
| 7.496 | 11.01 |
| 7.497 | 11.015 |
| 7.498 | 11.02 |
| 7.499 | 11.024 |
| 7.5 | 11.029 |
| 7.501 | 11.034 |
| 7.502 | 11.039 |
| 7.503 | 11.044 |
| 7.504 | 11.049 |
| 7.505 | 11.054 |
| 7.506 | 11.059 |
| 7.507 | 11.064 |
| 7.508 | 11.069 |
| 7.509 | 11.074 |
| 7.51 | 11.079 |
| 7.511 | 11.084 |
| 7.512 | 11.089 |
| 7.513 | 11.093 |
| 7.514 | 11.098 |
| 7.515 | 11.103 |
| 7.516 | 11.108 |
| 7.517 | 11.113 |
| 7.518 | 11.118 |
| 7.519 | 11.123 |
| 7.52 | 11.128 |
| 7.521 | 11.133 |
| 7.522 | 11.138 |
| 7.523 | 11.143 |
| 7.524 | 11.148 |
| 7.525 | 11.153 |
| 7.526 | 11.158 |
| 7.527 | 11.163 |
| 7.528 | 11.168 |
| 7.529 | 11.173 |
| 7.53 | 11.178 |
| 7.531 | 11.183 |
| 7.532 | 11.188 |
| 7.533 | 11.193 |
| 7.534 | 11.198 |
| 7.535 | 11.203 |
| 7.536 | 11.207 |
| 7.537 | 11.212 |
| 7.538 | 11.217 |
| 7.539 | 11.222 |
| 7.54 | 11.227 |
| 7.541 | 11.232 |
| 7.542 | 11.237 |
| 7.543 | 11.242 |
| 7.544 | 11.247 |
| 7.545 | 11.252 |
| 7.546 | 11.257 |
| 7.547 | 11.262 |
| 7.548 | 11.267 |
| 7.549 | 11.272 |
| 7.55 | 11.277 |
| 7.551 | 11.282 |
| 7.552 | 11.287 |
| 7.553 | 11.292 |
| 7.554 | 11.297 |
| 7.555 | 11.302 |
| 7.556 | 11.307 |
| 7.557 | 11.312 |
| 7.558 | 11.317 |
| 7.559 | 11.322 |
| 7.56 | 11.327 |
| 7.561 | 11.332 |
| 7.562 | 11.337 |
| 7.563 | 11.342 |
| 7.564 | 11.347 |
| 7.565 | 11.352 |
| 7.566 | 11.357 |
| 7.567 | 11.362 |
| 7.568 | 11.367 |
| 7.569 | 11.372 |
| 7.57 | 11.377 |
| 7.571 | 11.382 |
| 7.572 | 11.387 |
| 7.573 | 11.392 |
| 7.574 | 11.397 |
| 7.575 | 11.402 |
| 7.576 | 11.408 |
| 7.577 | 11.413 |
| 7.578 | 11.418 |
| 7.579 | 11.423 |
| 7.58 | 11.428 |
| 7.581 | 11.433 |
| 7.582 | 11.438 |
| 7.583 | 11.443 |
| 7.584 | 11.448 |
| 7.585 | 11.453 |
| 7.586 | 11.458 |
| 7.587 | 11.463 |
| 7.588 | 11.468 |
| 7.589 | 11.473 |
| 7.59 | 11.478 |
| 7.591 | 11.483 |
| 7.592 | 11.488 |
| 7.593 | 11.493 |
| 7.594 | 11.498 |
| 7.595 | 11.503 |
| 7.596 | 11.508 |
| 7.597 | 11.513 |
| 7.598 | 11.519 |
| 7.599 | 11.524 |
| 7.6 | 11.529 |
| 7.601 | 11.534 |
| 7.602 | 11.539 |
| 7.603 | 11.544 |
| 7.604 | 11.549 |
| 7.605 | 11.554 |
| 7.606 | 11.559 |
| 7.607 | 11.564 |
| 7.608 | 11.569 |
| 7.609 | 11.574 |
| 7.61 | 11.579 |
| 7.611 | 11.584 |
| 7.612 | 11.59 |
| 7.613 | 11.595 |
| 7.614 | 11.6 |
| 7.615 | 11.605 |
| 7.616 | 11.61 |
| 7.617 | 11.615 |
| 7.618 | 11.62 |
| 7.619 | 11.625 |
| 7.62 | 11.63 |
| 7.621 | 11.635 |
| 7.622 | 11.64 |
| 7.623 | 11.646 |
| 7.624 | 11.651 |
| 7.625 | 11.656 |
| 7.626 | 11.661 |
| 7.627 | 11.666 |
| 7.628 | 11.671 |
| 7.629 | 11.676 |
| 7.63 | 11.681 |
| 7.631 | 11.686 |
| 7.632 | 11.691 |
| 7.633 | 11.697 |
| 7.634 | 11.702 |
| 7.635 | 11.707 |
| 7.636 | 11.712 |
| 7.637 | 11.717 |
| 7.638 | 11.722 |
| 7.639 | 11.727 |
| 7.64 | 11.732 |
| 7.641 | 11.737 |
| 7.642 | 11.743 |
| 7.643 | 11.748 |
| 7.644 | 11.753 |
| 7.645 | 11.758 |
| 7.646 | 11.763 |
| 7.647 | 11.768 |
| 7.648 | 11.773 |
| 7.649 | 11.779 |
| 7.65 | 11.784 |
| 7.651 | 11.789 |
| 7.652 | 11.794 |
| 7.653 | 11.799 |
| 7.654 | 11.804 |
| 7.655 | 11.809 |
| 7.656 | 11.814 |
| 7.657 | 11.82 |
| 7.658 | 11.825 |
| 7.659 | 11.83 |
| 7.66 | 11.835 |
| 7.661 | 11.84 |
| 7.662 | 11.845 |
| 7.663 | 11.851 |
| 7.664 | 11.856 |
| 7.665 | 11.861 |
| 7.666 | 11.866 |
| 7.667 | 11.871 |
| 7.668 | 11.876 |
| 7.669 | 11.882 |
| 7.67 | 11.887 |
| 7.671 | 11.892 |
| 7.672 | 11.897 |
| 7.673 | 11.902 |
| 7.674 | 11.907 |
| 7.675 | 11.913 |
| 7.676 | 11.918 |
| 7.677 | 11.923 |
| 7.678 | 11.928 |
| 7.679 | 11.933 |
| 7.68 | 11.938 |
| 7.681 | 11.944 |
| 7.682 | 11.949 |
| 7.683 | 11.954 |
| 7.684 | 11.959 |
| 7.685 | 11.964 |
| 7.686 | 11.97 |
| 7.687 | 11.975 |
| 7.688 | 11.98 |
| 7.689 | 11.985 |
| 7.69 | 11.99 |
| 7.691 | 11.995 |
| 7.692 | 12.001 |
| 7.693 | 12.006 |
| 7.694 | 12.011 |
| 7.695 | 12.016 |
| 7.696 | 12.021 |
| 7.697 | 12.027 |
| 7.698 | 12.032 |
| 7.699 | 12.037 |
| 7.7 | 12.042 |
| 7.701 | 12.048 |
| 7.702 | 12.053 |
| 7.703 | 12.058 |
| 7.704 | 12.063 |
| 7.705 | 12.068 |
| 7.706 | 12.074 |
| 7.707 | 12.079 |
| 7.708 | 12.084 |
| 7.709 | 12.089 |
| 7.71 | 12.094 |
| 7.711 | 12.1 |
| 7.712 | 12.105 |
| 7.713 | 12.11 |
| 7.714 | 12.115 |
| 7.715 | 12.121 |
| 7.716 | 12.126 |
| 7.717 | 12.131 |
| 7.718 | 12.136 |
| 7.719 | 12.142 |
| 7.72 | 12.147 |
| 7.721 | 12.152 |
| 7.722 | 12.157 |
| 7.723 | 12.163 |
| 7.724 | 12.168 |
| 7.725 | 12.173 |
| 7.726 | 12.178 |
| 7.727 | 12.184 |
| 7.728 | 12.189 |
| 7.729 | 12.194 |
| 7.73 | 12.199 |
| 7.731 | 12.205 |
| 7.732 | 12.21 |
| 7.733 | 12.215 |
| 7.734 | 12.22 |
| 7.735 | 12.226 |
| 7.736 | 12.231 |
| 7.737 | 12.236 |
| 7.738 | 12.241 |
| 7.739 | 12.247 |
| 7.74 | 12.252 |
| 7.741 | 12.257 |
| 7.742 | 12.262 |
| 7.743 | 12.268 |
| 7.744 | 12.273 |
| 7.745 | 12.278 |
| 7.746 | 12.284 |
| 7.747 | 12.289 |
| 7.748 | 12.294 |
| 7.749 | 12.299 |
| 7.75 | 12.305 |
| 7.751 | 12.31 |
| 7.752 | 12.315 |
| 7.753 | 12.32 |
| 7.754 | 12.326 |
| 7.755 | 12.331 |
| 7.756 | 12.336 |
| 7.757 | 12.342 |
| 7.758 | 12.347 |
| 7.759 | 12.352 |
| 7.76 | 12.358 |
| 7.761 | 12.363 |
| 7.762 | 12.368 |
| 7.763 | 12.373 |
| 7.764 | 12.379 |
| 7.765 | 12.384 |
| 7.766 | 12.389 |
| 7.767 | 12.395 |
| 7.768 | 12.4 |
| 7.769 | 12.405 |
| 7.77 | 12.411 |
| 7.771 | 12.416 |
| 7.772 | 12.421 |
| 7.773 | 12.427 |
| 7.774 | 12.432 |
| 7.775 | 12.437 |
| 7.776 | 12.443 |
| 7.777 | 12.448 |
| 7.778 | 12.453 |
| 7.779 | 12.459 |
| 7.78 | 12.464 |
| 7.781 | 12.469 |
| 7.782 | 12.475 |
| 7.783 | 12.48 |
| 7.784 | 12.485 |
| 7.785 | 12.491 |
| 7.786 | 12.496 |
| 7.787 | 12.501 |
| 7.788 | 12.507 |
| 7.789 | 12.512 |
| 7.79 | 12.517 |
| 7.791 | 12.523 |
| 7.792 | 12.528 |
| 7.793 | 12.533 |
| 7.794 | 12.539 |
| 7.795 | 12.544 |
| 7.796 | 12.549 |
| 7.797 | 12.555 |
| 7.798 | 12.56 |
| 7.799 | 12.565 |
| 7.8 | 12.571 |
| 7.801 | 12.576 |
| 7.802 | 12.581 |
| 7.803 | 12.587 |
| 7.804 | 12.592 |
| 7.805 | 12.598 |
| 7.806 | 12.603 |
| 7.807 | 12.608 |
| 7.808 | 12.614 |
| 7.809 | 12.619 |
| 7.81 | 12.624 |
| 7.811 | 12.63 |
| 7.812 | 12.635 |
| 7.813 | 12.641 |
| 7.814 | 12.646 |
| 7.815 | 12.651 |
| 7.816 | 12.657 |
| 7.817 | 12.662 |
| 7.818 | 12.668 |
| 7.819 | 12.673 |
| 7.82 | 12.678 |
| 7.821 | 12.684 |
| 7.822 | 12.689 |
| 7.823 | 12.694 |
| 7.824 | 12.7 |
| 7.825 | 12.705 |
| 7.826 | 12.711 |
| 7.827 | 12.716 |
| 7.828 | 12.721 |
| 7.829 | 12.727 |
| 7.83 | 12.732 |
| 7.831 | 12.738 |
| 7.832 | 12.743 |
| 7.833 | 12.748 |
| 7.834 | 12.754 |
| 7.835 | 12.759 |
| 7.836 | 12.765 |
| 7.837 | 12.77 |
| 7.838 | 12.776 |
| 7.839 | 12.781 |
| 7.84 | 12.786 |
| 7.841 | 12.792 |
| 7.842 | 12.797 |
| 7.843 | 12.803 |
| 7.844 | 12.808 |
| 7.845 | 12.814 |
| 7.846 | 12.819 |
| 7.847 | 12.824 |
| 7.848 | 12.83 |
| 7.849 | 12.835 |
| 7.85 | 12.841 |
| 7.851 | 12.846 |
| 7.852 | 12.852 |
| 7.853 | 12.857 |
| 7.854 | 12.862 |
| 7.855 | 12.868 |
| 7.856 | 12.873 |
| 7.857 | 12.879 |
| 7.858 | 12.884 |
| 7.859 | 12.89 |
| 7.86 | 12.895 |
| 7.861 | 12.901 |
| 7.862 | 12.906 |
| 7.863 | 12.912 |
| 7.864 | 12.917 |
| 7.865 | 12.922 |
| 7.866 | 12.928 |
| 7.867 | 12.933 |
| 7.868 | 12.939 |
| 7.869 | 12.944 |
| 7.87 | 12.95 |
| 7.871 | 12.955 |
| 7.872 | 12.961 |
| 7.873 | 12.966 |
| 7.874 | 12.972 |
| 7.875 | 12.977 |
| 7.876 | 12.983 |
| 7.877 | 12.988 |
| 7.878 | 12.994 |
| 7.879 | 12.999 |
| 7.88 | 13.005 |
| 7.881 | 13.01 |
| 7.882 | 13.016 |
| 7.883 | 13.021 |
| 7.884 | 13.027 |
| 7.885 | 13.032 |
| 7.886 | 13.038 |
| 7.887 | 13.043 |
| 7.888 | 13.048 |
| 7.889 | 13.054 |
| 7.89 | 13.06 |
| 7.891 | 13.065 |
| 7.892 | 13.07 |
| 7.893 | 13.076 |
| 7.894 | 13.082 |
| 7.895 | 13.087 |
| 7.896 | 13.093 |
| 7.897 | 13.098 |
| 7.898 | 13.104 |
| 7.899 | 13.109 |
| 7.9 | 13.115 |
| 7.901 | 13.12 |
| 7.902 | 13.126 |
| 7.903 | 13.131 |
| 7.904 | 13.137 |
| 7.905 | 13.142 |
| 7.906 | 13.148 |
| 7.907 | 13.153 |
| 7.908 | 13.159 |
| 7.909 | 13.164 |
| 7.91 | 13.17 |
| 7.911 | 13.175 |
| 7.912 | 13.181 |
| 7.913 | 13.186 |
| 7.914 | 13.192 |
| 7.915 | 13.198 |
| 7.916 | 13.203 |
| 7.917 | 13.209 |
| 7.918 | 13.214 |
| 7.919 | 13.22 |
| 7.92 | 13.225 |
| 7.921 | 13.231 |
| 7.922 | 13.236 |
| 7.923 | 13.242 |
| 7.924 | 13.247 |
| 7.925 | 13.253 |
| 7.926 | 13.259 |
| 7.927 | 13.264 |
| 7.928 | 13.27 |
| 7.929 | 13.275 |
| 7.93 | 13.281 |
| 7.931 | 13.286 |
| 7.932 | 13.292 |
| 7.933 | 13.298 |
| 7.934 | 13.303 |
| 7.935 | 13.309 |
| 7.936 | 13.314 |
| 7.937 | 13.32 |
| 7.938 | 13.325 |
| 7.939 | 13.331 |
| 7.94 | 13.337 |
| 7.941 | 13.342 |
| 7.942 | 13.348 |
| 7.943 | 13.353 |
| 7.944 | 13.359 |
| 7.945 | 13.364 |
| 7.946 | 13.37 |
| 7.947 | 13.376 |
| 7.948 | 13.381 |
| 7.949 | 13.387 |
| 7.95 | 13.392 |
| 7.951 | 13.398 |
| 7.952 | 13.404 |
| 7.953 | 13.409 |
| 7.954 | 13.415 |
| 7.955 | 13.42 |
| 7.956 | 13.426 |
| 7.957 | 13.432 |
| 7.958 | 13.437 |
| 7.959 | 13.443 |
| 7.96 | 13.448 |
| 7.961 | 13.454 |
| 7.962 | 13.46 |
| 7.963 | 13.465 |
| 7.964 | 13.471 |
| 7.965 | 13.477 |
| 7.966 | 13.482 |
| 7.967 | 13.488 |
| 7.968 | 13.493 |
| 7.969 | 13.499 |
| 7.97 | 13.505 |
| 7.971 | 13.51 |
| 7.972 | 13.516 |
| 7.973 | 13.522 |
| 7.974 | 13.527 |
| 7.975 | 13.533 |
| 7.976 | 13.538 |
| 7.977 | 13.544 |
| 7.978 | 13.55 |
| 7.979 | 13.555 |
| 7.98 | 13.561 |
| 7.981 | 13.567 |
| 7.982 | 13.572 |
| 7.983 | 13.578 |
| 7.984 | 13.584 |
| 7.985 | 13.589 |
| 7.986 | 13.595 |
| 7.987 | 13.601 |
| 7.988 | 13.606 |
| 7.989 | 13.612 |
| 7.99 | 13.618 |
| 7.991 | 13.623 |
| 7.992 | 13.629 |
| 7.993 | 13.635 |
| 7.994 | 13.64 |
| 7.995 | 13.646 |
| 7.996 | 13.652 |
| 7.997 | 13.657 |
| 7.998 | 13.663 |
| 7.999 | 13.669 |
| 8.0 | 13.674 |